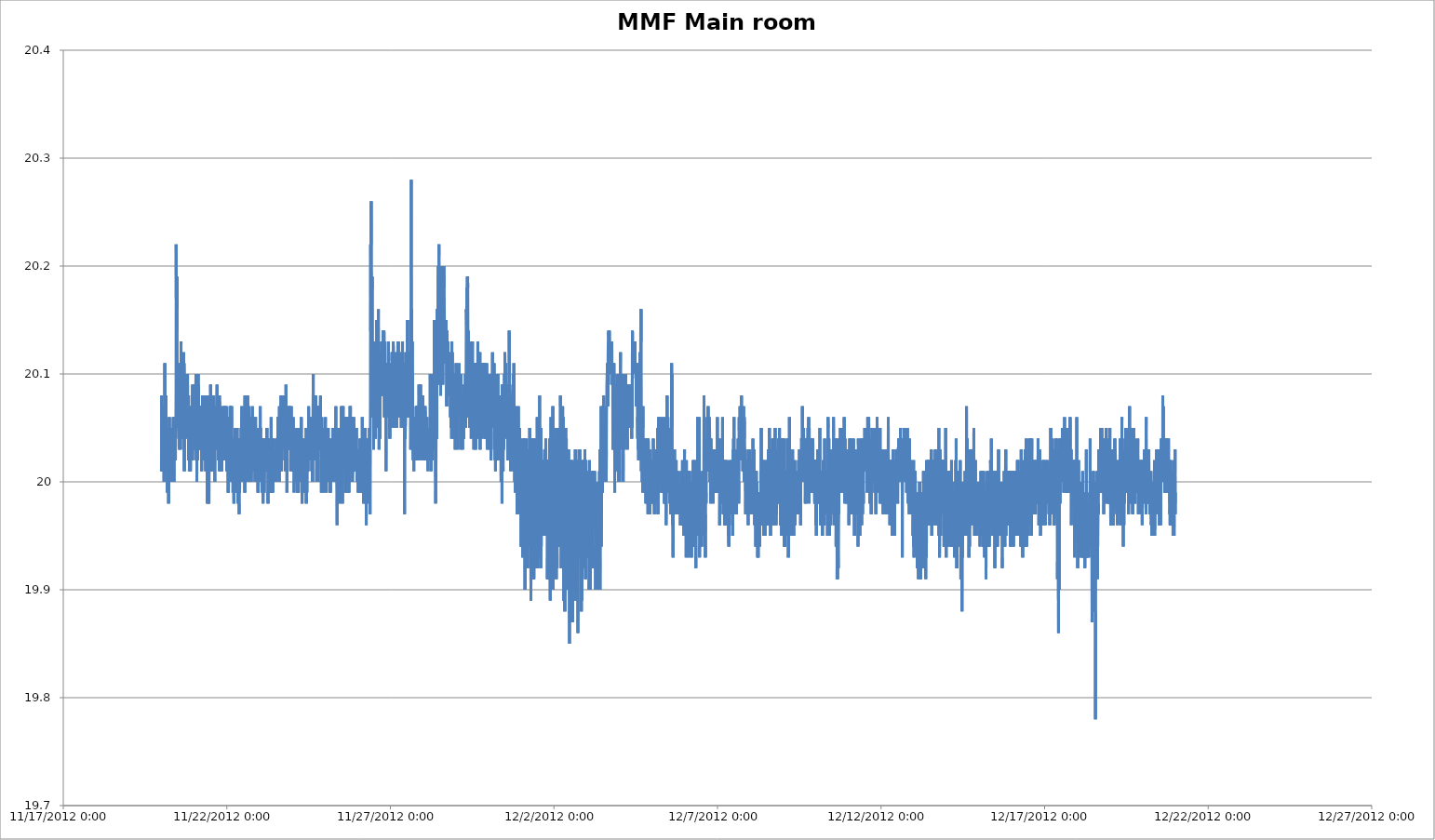
| Category | Series 0 |
|---|---|
| 41233.0 | 20.01 |
| 41233.004166666666 | 20.05 |
| 41233.00833333333 | 20.08 |
| 41233.0125 | 20.01 |
| 41233.01666666667 | 20.03 |
| 41233.020833333336 | 20.02 |
| 41233.025 | 20.02 |
| 41233.02916666667 | 20.03 |
| 41233.03333333333 | 20.01 |
| 41233.0375 | 20.03 |
| 41233.041666666664 | 20.03 |
| 41233.04583333333 | 20.04 |
| 41233.05 | 20.04 |
| 41233.05416666667 | 20.01 |
| 41233.058333333334 | 20.04 |
| 41233.0625 | 20.04 |
| 41233.066666666666 | 20.01 |
| 41233.07083333333 | 20.04 |
| 41233.075 | 20.03 |
| 41233.07916666667 | 20 |
| 41233.083333333336 | 20.04 |
| 41233.0875 | 20.05 |
| 41233.09166666667 | 20.07 |
| 41233.09583333333 | 20.06 |
| 41233.1 | 20.04 |
| 41233.104166666664 | 20.11 |
| 41233.10833333333 | 20.05 |
| 41233.1125 | 20.05 |
| 41233.11666666667 | 20.01 |
| 41233.120833333334 | 20.05 |
| 41233.125 | 20.04 |
| 41233.129166666666 | 20.01 |
| 41233.13333333333 | 20.04 |
| 41233.1375 | 20.08 |
| 41233.14166666667 | 20.05 |
| 41233.145833333336 | 20.01 |
| 41233.15 | 20.03 |
| 41233.15416666667 | 20.04 |
| 41233.15833333333 | 20.03 |
| 41233.1625 | 20.04 |
| 41233.166666666664 | 20.05 |
| 41233.17083333333 | 20.04 |
| 41233.175 | 20.02 |
| 41233.17916666667 | 19.99 |
| 41233.183333333334 | 20.03 |
| 41233.1875 | 20.04 |
| 41233.191666666666 | 20.01 |
| 41233.19583333333 | 20.02 |
| 41233.2 | 20.02 |
| 41233.20416666667 | 20.04 |
| 41233.208333333336 | 20.02 |
| 41233.2125 | 20.04 |
| 41233.21666666667 | 20.04 |
| 41233.22083333333 | 19.98 |
| 41233.225 | 20.02 |
| 41233.229166666664 | 20.03 |
| 41233.23333333333 | 20.02 |
| 41233.2375 | 20.02 |
| 41233.24166666667 | 20.06 |
| 41233.245833333334 | 20.04 |
| 41233.25 | 20 |
| 41233.254166666666 | 20.02 |
| 41233.25833333333 | 20.01 |
| 41233.2625 | 20.05 |
| 41233.26666666667 | 20.05 |
| 41233.270833333336 | 20.05 |
| 41233.275 | 20.02 |
| 41233.27916666667 | 20.02 |
| 41233.28333333333 | 20.04 |
| 41233.2875 | 20.01 |
| 41233.291666666664 | 20.05 |
| 41233.29583333333 | 20.01 |
| 41233.3 | 20.03 |
| 41233.30416666667 | 20.04 |
| 41233.308333333334 | 20.04 |
| 41233.3125 | 20.04 |
| 41233.316666666666 | 20.05 |
| 41233.32083333333 | 20.03 |
| 41233.325 | 20.03 |
| 41233.32916666667 | 20.01 |
| 41233.333333333336 | 20.01 |
| 41233.3375 | 20.02 |
| 41233.34166666667 | 20.03 |
| 41233.34583333333 | 20.04 |
| 41233.35 | 20 |
| 41233.354166666664 | 20.05 |
| 41233.35833333333 | 20.05 |
| 41233.3625 | 20.06 |
| 41233.36666666667 | 20.01 |
| 41233.370833333334 | 20.03 |
| 41233.375 | 20.02 |
| 41233.379166666666 | 20.03 |
| 41233.38333333333 | 20 |
| 41233.3875 | 20.06 |
| 41233.39166666667 | 20.06 |
| 41233.395833333336 | 20.03 |
| 41233.4 | 20.04 |
| 41233.40416666667 | 20.04 |
| 41233.40833333333 | 20.03 |
| 41233.4125 | 20.06 |
| 41233.416666666664 | 20.05 |
| 41233.42083333333 | 20.05 |
| 41233.425 | 20.05 |
| 41233.42916666667 | 20.02 |
| 41233.433333333334 | 20.05 |
| 41233.4375 | 20.04 |
| 41233.441666666666 | 20.06 |
| 41233.44583333333 | 20.09 |
| 41233.45 | 20.22 |
| 41233.45416666667 | 20.17 |
| 41233.458333333336 | 20.18 |
| 41233.4625 | 20.14 |
| 41233.46666666667 | 20.18 |
| 41233.47083333333 | 20.16 |
| 41233.475 | 20.19 |
| 41233.479166666664 | 20.17 |
| 41233.48333333333 | 20.12 |
| 41233.4875 | 20.06 |
| 41233.49166666667 | 20.06 |
| 41233.495833333334 | 20.05 |
| 41233.5 | 20.06 |
| 41233.504166666666 | 20.05 |
| 41233.50833333333 | 20.08 |
| 41233.5125 | 20.08 |
| 41233.51666666667 | 20.08 |
| 41233.520833333336 | 20.1 |
| 41233.525 | 20.09 |
| 41233.52916666667 | 20.06 |
| 41233.53333333333 | 20.06 |
| 41233.5375 | 20.11 |
| 41233.541666666664 | 20.06 |
| 41233.54583333333 | 20.03 |
| 41233.55 | 20.07 |
| 41233.55416666667 | 20.06 |
| 41233.558333333334 | 20.07 |
| 41233.5625 | 20.06 |
| 41233.566666666666 | 20.04 |
| 41233.57083333333 | 20.07 |
| 41233.575 | 20.06 |
| 41233.57916666667 | 20.04 |
| 41233.583333333336 | 20.03 |
| 41233.5875 | 20.09 |
| 41233.59166666667 | 20.08 |
| 41233.59583333333 | 20.07 |
| 41233.6 | 20.13 |
| 41233.604166666664 | 20.11 |
| 41233.60833333333 | 20.06 |
| 41233.6125 | 20.08 |
| 41233.61666666667 | 20.04 |
| 41233.620833333334 | 20.1 |
| 41233.625 | 20.06 |
| 41233.629166666666 | 20.07 |
| 41233.63333333333 | 20.05 |
| 41233.6375 | 20.11 |
| 41233.64166666667 | 20.07 |
| 41233.645833333336 | 20.08 |
| 41233.65 | 20.08 |
| 41233.65416666667 | 20.11 |
| 41233.65833333333 | 20.05 |
| 41233.6625 | 20.08 |
| 41233.666666666664 | 20.09 |
| 41233.67083333333 | 20.05 |
| 41233.675 | 20.05 |
| 41233.67916666667 | 20.09 |
| 41233.683333333334 | 20.12 |
| 41233.6875 | 20.09 |
| 41233.691666666666 | 20.11 |
| 41233.69583333333 | 20.11 |
| 41233.7 | 20.01 |
| 41233.70416666667 | 20.06 |
| 41233.708333333336 | 20.04 |
| 41233.7125 | 20.09 |
| 41233.71666666667 | 20.1 |
| 41233.72083333333 | 20.09 |
| 41233.725 | 20.09 |
| 41233.729166666664 | 20.07 |
| 41233.73333333333 | 20.1 |
| 41233.7375 | 20.08 |
| 41233.74166666667 | 20.07 |
| 41233.745833333334 | 20.09 |
| 41233.75 | 20.09 |
| 41233.754166666666 | 20.08 |
| 41233.75833333333 | 20.09 |
| 41233.7625 | 20.09 |
| 41233.76666666667 | 20.05 |
| 41233.770833333336 | 20.08 |
| 41233.775 | 20.06 |
| 41233.77916666667 | 20.04 |
| 41233.78333333333 | 20.07 |
| 41233.7875 | 20.09 |
| 41233.791666666664 | 20.06 |
| 41233.79583333333 | 20.07 |
| 41233.8 | 20.1 |
| 41233.80416666667 | 20.05 |
| 41233.808333333334 | 20.07 |
| 41233.8125 | 20.08 |
| 41233.816666666666 | 20.07 |
| 41233.82083333333 | 20.05 |
| 41233.825 | 20.04 |
| 41233.82916666667 | 20.08 |
| 41233.833333333336 | 20.02 |
| 41233.8375 | 20.04 |
| 41233.84166666667 | 20.05 |
| 41233.84583333333 | 20.07 |
| 41233.85 | 20.04 |
| 41233.854166666664 | 20.01 |
| 41233.85833333333 | 20.06 |
| 41233.8625 | 20.05 |
| 41233.86666666667 | 20.05 |
| 41233.870833333334 | 20.04 |
| 41233.875 | 20.05 |
| 41233.879166666666 | 20.03 |
| 41233.88333333333 | 20.07 |
| 41233.8875 | 20.01 |
| 41233.89166666667 | 20.04 |
| 41233.895833333336 | 20.06 |
| 41233.9 | 20.05 |
| 41233.90416666667 | 20.04 |
| 41233.90833333333 | 20.06 |
| 41233.9125 | 20.06 |
| 41233.916666666664 | 20.04 |
| 41233.92083333333 | 20.03 |
| 41233.925 | 20.05 |
| 41233.92916666667 | 20.04 |
| 41233.933333333334 | 20.06 |
| 41233.9375 | 20.07 |
| 41233.941666666666 | 20.03 |
| 41233.94583333333 | 20.05 |
| 41233.95 | 20.02 |
| 41233.95416666667 | 20.09 |
| 41233.958333333336 | 20.06 |
| 41233.9625 | 20.08 |
| 41233.96666666667 | 20.06 |
| 41233.97083333333 | 20.05 |
| 41233.975 | 20.04 |
| 41233.979166666664 | 20.08 |
| 41233.98333333333 | 20.07 |
| 41233.9875 | 20.07 |
| 41233.99166666667 | 20.04 |
| 41233.995833333334 | 20.06 |
| 41234.0 | 20.06 |
| 41234.004166666666 | 20.07 |
| 41234.00833333333 | 20.09 |
| 41234.0125 | 20.03 |
| 41234.01666666667 | 20.07 |
| 41234.020833333336 | 20.08 |
| 41234.025 | 20.06 |
| 41234.02916666667 | 20.07 |
| 41234.03333333333 | 20.06 |
| 41234.0375 | 20.06 |
| 41234.041666666664 | 20.06 |
| 41234.04583333333 | 20.08 |
| 41234.05 | 20.09 |
| 41234.05416666667 | 20.1 |
| 41234.058333333334 | 20.04 |
| 41234.0625 | 20.03 |
| 41234.066666666666 | 20.02 |
| 41234.07083333333 | 20.04 |
| 41234.075 | 20.04 |
| 41234.07916666667 | 20.07 |
| 41234.083333333336 | 20 |
| 41234.0875 | 20.07 |
| 41234.09166666667 | 20.05 |
| 41234.09583333333 | 20.05 |
| 41234.1 | 20.07 |
| 41234.104166666664 | 20.02 |
| 41234.10833333333 | 20.04 |
| 41234.1125 | 20.06 |
| 41234.11666666667 | 20.03 |
| 41234.120833333334 | 20.05 |
| 41234.125 | 20.1 |
| 41234.129166666666 | 20.03 |
| 41234.13333333333 | 20.07 |
| 41234.1375 | 20.09 |
| 41234.14166666667 | 20.05 |
| 41234.145833333336 | 20.03 |
| 41234.15 | 20.04 |
| 41234.15416666667 | 20.04 |
| 41234.15833333333 | 20.05 |
| 41234.1625 | 20.05 |
| 41234.166666666664 | 20.05 |
| 41234.17083333333 | 20.07 |
| 41234.175 | 20.05 |
| 41234.17916666667 | 20.05 |
| 41234.183333333334 | 20.03 |
| 41234.1875 | 20.07 |
| 41234.191666666666 | 20.05 |
| 41234.19583333333 | 20.03 |
| 41234.2 | 20.07 |
| 41234.20416666667 | 20.06 |
| 41234.208333333336 | 20.06 |
| 41234.2125 | 20.07 |
| 41234.21666666667 | 20.04 |
| 41234.22083333333 | 20.07 |
| 41234.225 | 20.07 |
| 41234.229166666664 | 20.01 |
| 41234.23333333333 | 20.03 |
| 41234.2375 | 20.05 |
| 41234.24166666667 | 20.02 |
| 41234.245833333334 | 20.02 |
| 41234.25 | 20.05 |
| 41234.254166666666 | 20.08 |
| 41234.25833333333 | 20.06 |
| 41234.2625 | 20.05 |
| 41234.26666666667 | 20.05 |
| 41234.270833333336 | 20.04 |
| 41234.275 | 20.02 |
| 41234.27916666667 | 20.07 |
| 41234.28333333333 | 20.07 |
| 41234.2875 | 20.03 |
| 41234.291666666664 | 20.05 |
| 41234.29583333333 | 20.05 |
| 41234.3 | 20.06 |
| 41234.30416666667 | 20.02 |
| 41234.308333333334 | 20.04 |
| 41234.3125 | 20.07 |
| 41234.316666666666 | 20.02 |
| 41234.32083333333 | 20.05 |
| 41234.325 | 20.05 |
| 41234.32916666667 | 20.05 |
| 41234.333333333336 | 20.06 |
| 41234.3375 | 20.08 |
| 41234.34166666667 | 20.08 |
| 41234.34583333333 | 20.02 |
| 41234.35 | 20.06 |
| 41234.354166666664 | 20.01 |
| 41234.35833333333 | 20.05 |
| 41234.3625 | 20.07 |
| 41234.36666666667 | 20.03 |
| 41234.36790509259 | 20.04 |
| 41234.36869212963 | 20.06 |
| 41234.370833333334 | 20.06 |
| 41234.375 | 20.05 |
| 41234.379166666666 | 20.05 |
| 41234.38333333333 | 20.04 |
| 41234.3875 | 20.08 |
| 41234.39166666667 | 20.05 |
| 41234.395833333336 | 20.01 |
| 41234.4 | 20.02 |
| 41234.40416666667 | 19.98 |
| 41234.40833333333 | 20.07 |
| 41234.4125 | 20.04 |
| 41234.416666666664 | 20.07 |
| 41234.42083333333 | 20.02 |
| 41234.425 | 20.04 |
| 41234.42916666667 | 20.03 |
| 41234.433333333334 | 20.02 |
| 41234.4375 | 19.98 |
| 41234.441666666666 | 19.98 |
| 41234.44583333333 | 20.02 |
| 41234.45 | 20.01 |
| 41234.45416666667 | 19.98 |
| 41234.458333333336 | 20.02 |
| 41234.4625 | 20.04 |
| 41234.46666666667 | 20.06 |
| 41234.47083333333 | 20.06 |
| 41234.475 | 20.04 |
| 41234.479166666664 | 20.08 |
| 41234.48333333333 | 20.08 |
| 41234.4875 | 20.08 |
| 41234.49166666667 | 20.01 |
| 41234.495833333334 | 20.08 |
| 41234.5 | 20.01 |
| 41234.504166666666 | 20.09 |
| 41234.50833333333 | 20.05 |
| 41234.5125 | 20.07 |
| 41234.51666666667 | 20.05 |
| 41234.520833333336 | 20.03 |
| 41234.525 | 20.03 |
| 41234.52916666667 | 20.04 |
| 41234.53333333333 | 20.05 |
| 41234.5375 | 20.04 |
| 41234.541666666664 | 20.01 |
| 41234.54583333333 | 20.03 |
| 41234.55 | 20.05 |
| 41234.55416666667 | 20.02 |
| 41234.558333333334 | 20.03 |
| 41234.5625 | 20.05 |
| 41234.566666666666 | 20.04 |
| 41234.57083333333 | 20.01 |
| 41234.575 | 20.07 |
| 41234.57916666667 | 20.06 |
| 41234.583333333336 | 20.05 |
| 41234.5875 | 20.06 |
| 41234.59166666667 | 20.06 |
| 41234.6 | 20.08 |
| 41234.604166666664 | 20.04 |
| 41234.60833333333 | 20.02 |
| 41234.6125 | 20.04 |
| 41234.61666666667 | 20.06 |
| 41234.620833333334 | 20.04 |
| 41234.625 | 20.04 |
| 41234.629166666666 | 20.01 |
| 41234.63333333333 | 20 |
| 41234.6375 | 20.04 |
| 41234.64166666667 | 20.03 |
| 41234.645833333336 | 20.06 |
| 41234.65 | 20.07 |
| 41234.65416666667 | 20.04 |
| 41234.65833333333 | 20.05 |
| 41234.6625 | 20.07 |
| 41234.666666666664 | 20.05 |
| 41234.67083333333 | 20.05 |
| 41234.675 | 20.05 |
| 41234.683333333334 | 20.04 |
| 41234.6875 | 20.07 |
| 41234.691666666666 | 20.07 |
| 41234.69583333333 | 20.08 |
| 41234.7 | 20.09 |
| 41234.70416666667 | 20.07 |
| 41234.708333333336 | 20.03 |
| 41234.7125 | 20.08 |
| 41234.71666666667 | 20.06 |
| 41234.72083333333 | 20.04 |
| 41234.725 | 20.04 |
| 41234.729166666664 | 20.06 |
| 41234.73333333333 | 20.04 |
| 41234.7375 | 20.08 |
| 41234.74166666667 | 20.02 |
| 41234.745833333334 | 20.03 |
| 41234.75 | 20.06 |
| 41234.754166666666 | 20.07 |
| 41234.75833333333 | 20.05 |
| 41234.7625 | 20.08 |
| 41234.76666666667 | 20.05 |
| 41234.770833333336 | 20.01 |
| 41234.775 | 20.08 |
| 41234.77916666667 | 20.06 |
| 41234.78333333333 | 20.07 |
| 41234.7875 | 20.07 |
| 41234.791666666664 | 20.04 |
| 41234.79583333333 | 20.04 |
| 41234.8 | 20.06 |
| 41234.80416666667 | 20.06 |
| 41234.808333333334 | 20.04 |
| 41234.8125 | 20.01 |
| 41234.816666666666 | 20.01 |
| 41234.82083333333 | 20.03 |
| 41234.825 | 20.04 |
| 41234.82916666667 | 20.05 |
| 41234.833333333336 | 20.05 |
| 41234.8375 | 20.05 |
| 41234.84166666667 | 20.06 |
| 41234.84583333333 | 20.01 |
| 41234.85 | 20.02 |
| 41234.854166666664 | 20.04 |
| 41234.85833333333 | 20.02 |
| 41234.8625 | 20.04 |
| 41234.86666666667 | 20.05 |
| 41234.870833333334 | 20.03 |
| 41234.875 | 20.06 |
| 41234.879166666666 | 20.07 |
| 41234.88333333333 | 20.02 |
| 41234.8875 | 20.04 |
| 41234.89166666667 | 20.04 |
| 41234.895833333336 | 20.02 |
| 41234.9 | 20.05 |
| 41234.90416666667 | 20.06 |
| 41234.90833333333 | 20.07 |
| 41234.9125 | 20.02 |
| 41234.916666666664 | 20.03 |
| 41234.92083333333 | 20.04 |
| 41234.925 | 20.04 |
| 41234.92916666667 | 20.04 |
| 41234.933333333334 | 20.03 |
| 41234.9375 | 20.06 |
| 41234.941666666666 | 20.06 |
| 41234.94583333333 | 20.07 |
| 41234.95 | 20.03 |
| 41234.95416666667 | 20.03 |
| 41234.958333333336 | 20.03 |
| 41234.9625 | 20.06 |
| 41234.96666666667 | 20.03 |
| 41234.97083333333 | 20.03 |
| 41234.975 | 20.03 |
| 41234.979166666664 | 20.03 |
| 41234.98333333333 | 20.07 |
| 41234.9875 | 20.07 |
| 41234.99166666667 | 20.03 |
| 41234.995833333334 | 20.04 |
| 41235.0 | 20.01 |
| 41235.004166666666 | 20.03 |
| 41235.00833333333 | 20.03 |
| 41235.01666666667 | 20.05 |
| 41235.020833333336 | 20.03 |
| 41235.025 | 20.03 |
| 41235.02916666667 | 20.02 |
| 41235.03333333333 | 20.02 |
| 41235.0375 | 20.03 |
| 41235.041666666664 | 19.99 |
| 41235.04583333333 | 20.03 |
| 41235.05 | 19.99 |
| 41235.058333333334 | 20.04 |
| 41235.0625 | 20.03 |
| 41235.066666666666 | 20.06 |
| 41235.07083333333 | 20.06 |
| 41235.075 | 20.04 |
| 41235.07916666667 | 20.01 |
| 41235.083333333336 | 20.04 |
| 41235.0875 | 20.04 |
| 41235.09166666667 | 20.05 |
| 41235.09583333333 | 20.06 |
| 41235.1 | 20.07 |
| 41235.104166666664 | 20.04 |
| 41235.10833333333 | 20.07 |
| 41235.1125 | 20.06 |
| 41235.11666666667 | 20.03 |
| 41235.120833333334 | 20.04 |
| 41235.125 | 20.06 |
| 41235.129166666666 | 20.04 |
| 41235.13333333333 | 20.03 |
| 41235.1375 | 20.03 |
| 41235.14166666667 | 20 |
| 41235.145833333336 | 20.07 |
| 41235.15 | 20.03 |
| 41235.15416666667 | 20 |
| 41235.15833333333 | 20.03 |
| 41235.1625 | 20.02 |
| 41235.166666666664 | 20.02 |
| 41235.17083333333 | 20.03 |
| 41235.175 | 20.01 |
| 41235.17916666667 | 20.04 |
| 41235.183333333334 | 20.02 |
| 41235.1875 | 19.99 |
| 41235.191666666666 | 20.02 |
| 41235.19583333333 | 20.02 |
| 41235.2 | 20.03 |
| 41235.20416666667 | 20 |
| 41235.208333333336 | 20 |
| 41235.2125 | 20.02 |
| 41235.21666666667 | 19.98 |
| 41235.22083333333 | 20.01 |
| 41235.225 | 20.01 |
| 41235.229166666664 | 19.99 |
| 41235.23333333333 | 19.99 |
| 41235.2375 | 20.01 |
| 41235.24166666667 | 20.01 |
| 41235.245833333334 | 20.04 |
| 41235.25 | 20.02 |
| 41235.254166666666 | 20.01 |
| 41235.25833333333 | 20.05 |
| 41235.2625 | 19.99 |
| 41235.26666666667 | 20.01 |
| 41235.270833333336 | 20.05 |
| 41235.275 | 20.05 |
| 41235.27916666667 | 20.03 |
| 41235.28333333333 | 20.03 |
| 41235.2875 | 20.02 |
| 41235.291666666664 | 20.02 |
| 41235.29583333333 | 20 |
| 41235.3 | 20 |
| 41235.30416666667 | 20.01 |
| 41235.308333333334 | 20.04 |
| 41235.3125 | 20.04 |
| 41235.316666666666 | 20.05 |
| 41235.32083333333 | 20.02 |
| 41235.325 | 20.03 |
| 41235.32916666667 | 20.04 |
| 41235.333333333336 | 20 |
| 41235.3375 | 20.03 |
| 41235.34166666667 | 19.98 |
| 41235.34583333333 | 20 |
| 41235.35 | 20.04 |
| 41235.354166666664 | 20.03 |
| 41235.35833333333 | 20.02 |
| 41235.3625 | 20.04 |
| 41235.36666666667 | 20.02 |
| 41235.370833333334 | 20.01 |
| 41235.375 | 19.97 |
| 41235.379166666666 | 19.98 |
| 41235.38333333333 | 20.01 |
| 41235.3875 | 20.04 |
| 41235.39166666667 | 19.99 |
| 41235.395833333336 | 19.99 |
| 41235.4 | 20.04 |
| 41235.40416666667 | 20.02 |
| 41235.40833333333 | 20.02 |
| 41235.4125 | 20.01 |
| 41235.416666666664 | 20.02 |
| 41235.42083333333 | 20.01 |
| 41235.425 | 20.04 |
| 41235.42916666667 | 20.01 |
| 41235.433333333334 | 20.03 |
| 41235.4375 | 20.05 |
| 41235.441666666666 | 20.02 |
| 41235.44583333333 | 20.05 |
| 41235.45 | 20.03 |
| 41235.45416666667 | 20.06 |
| 41235.458333333336 | 20.04 |
| 41235.4625 | 20.07 |
| 41235.46666666667 | 20.05 |
| 41235.47083333333 | 20 |
| 41235.475 | 20 |
| 41235.479166666664 | 20.01 |
| 41235.48333333333 | 20.04 |
| 41235.4875 | 20 |
| 41235.49166666667 | 20.05 |
| 41235.495833333334 | 20.01 |
| 41235.5 | 20.05 |
| 41235.504166666666 | 20.02 |
| 41235.50833333333 | 20.03 |
| 41235.5125 | 20.01 |
| 41235.51666666667 | 20.04 |
| 41235.520833333336 | 20 |
| 41235.525 | 20.03 |
| 41235.52916666667 | 20.02 |
| 41235.53333333333 | 20.04 |
| 41235.5375 | 20.04 |
| 41235.541666666664 | 20.01 |
| 41235.54583333333 | 20.03 |
| 41235.55 | 19.99 |
| 41235.55416666667 | 20.08 |
| 41235.558333333334 | 20.05 |
| 41235.5625 | 20.05 |
| 41235.566666666666 | 20.03 |
| 41235.57083333333 | 20.01 |
| 41235.575 | 20.02 |
| 41235.57916666667 | 20.05 |
| 41235.583333333336 | 20.04 |
| 41235.5875 | 20.04 |
| 41235.59166666667 | 20.03 |
| 41235.59583333333 | 20.04 |
| 41235.6 | 20 |
| 41235.604166666664 | 20.06 |
| 41235.60833333333 | 20.05 |
| 41235.6125 | 20.05 |
| 41235.61666666667 | 20.05 |
| 41235.620833333334 | 20.07 |
| 41235.625 | 20.04 |
| 41235.629166666666 | 20.02 |
| 41235.63333333333 | 20.06 |
| 41235.6375 | 20.08 |
| 41235.64166666667 | 20.05 |
| 41235.645833333336 | 20 |
| 41235.65 | 20.06 |
| 41235.65416666667 | 20.05 |
| 41235.65833333333 | 20.04 |
| 41235.6625 | 20.02 |
| 41235.666666666664 | 20.05 |
| 41235.67083333333 | 20.06 |
| 41235.675 | 20.07 |
| 41235.67916666667 | 20.04 |
| 41235.683333333334 | 20.04 |
| 41235.6875 | 20.03 |
| 41235.691666666666 | 20.03 |
| 41235.69583333333 | 20 |
| 41235.7 | 20.06 |
| 41235.70416666667 | 20.04 |
| 41235.708333333336 | 20.03 |
| 41235.7125 | 20.04 |
| 41235.71666666667 | 20.05 |
| 41235.72083333333 | 20.05 |
| 41235.725 | 20.04 |
| 41235.729166666664 | 20.01 |
| 41235.73333333333 | 20.04 |
| 41235.7375 | 20.04 |
| 41235.74166666667 | 20.05 |
| 41235.745833333334 | 20 |
| 41235.75 | 20.05 |
| 41235.754166666666 | 20.04 |
| 41235.75833333333 | 20.06 |
| 41235.7625 | 20.01 |
| 41235.76666666667 | 20.05 |
| 41235.770833333336 | 20.05 |
| 41235.775 | 20.05 |
| 41235.77916666667 | 20.07 |
| 41235.78333333333 | 20.05 |
| 41235.7875 | 20.04 |
| 41235.791666666664 | 20.04 |
| 41235.79583333333 | 20.04 |
| 41235.8 | 20.03 |
| 41235.80416666667 | 20.03 |
| 41235.808333333334 | 20.02 |
| 41235.8125 | 20.03 |
| 41235.816666666666 | 20.01 |
| 41235.82083333333 | 20.04 |
| 41235.825 | 20.06 |
| 41235.82916666667 | 20.05 |
| 41235.833333333336 | 20.05 |
| 41235.8375 | 20.02 |
| 41235.84166666667 | 20.01 |
| 41235.84583333333 | 20.04 |
| 41235.85 | 20.05 |
| 41235.854166666664 | 20.05 |
| 41235.85833333333 | 20.06 |
| 41235.8625 | 20 |
| 41235.86666666667 | 20.05 |
| 41235.870833333334 | 20.05 |
| 41235.875 | 20.05 |
| 41235.879166666666 | 20.06 |
| 41235.88333333333 | 20.05 |
| 41235.8875 | 20.05 |
| 41235.89166666667 | 20.02 |
| 41235.895833333336 | 20.03 |
| 41235.9 | 20.02 |
| 41235.90416666667 | 20.02 |
| 41235.90833333333 | 20.03 |
| 41235.9125 | 20.05 |
| 41235.916666666664 | 20.05 |
| 41235.92083333333 | 20.03 |
| 41235.925 | 20.01 |
| 41235.92916666667 | 20.04 |
| 41235.933333333334 | 20.04 |
| 41235.9375 | 20.02 |
| 41235.941666666666 | 20.03 |
| 41235.94583333333 | 20.01 |
| 41235.95 | 19.99 |
| 41235.95416666667 | 20.05 |
| 41235.958333333336 | 20.03 |
| 41235.9625 | 19.99 |
| 41235.96666666667 | 20.03 |
| 41235.97083333333 | 20.02 |
| 41235.975 | 20.01 |
| 41235.979166666664 | 20.05 |
| 41235.98333333333 | 20.01 |
| 41235.9875 | 20 |
| 41235.99166666667 | 20.03 |
| 41235.995833333334 | 20.04 |
| 41236.0 | 20.03 |
| 41236.004166666666 | 20.02 |
| 41236.00833333333 | 20.03 |
| 41236.0125 | 20.02 |
| 41236.01666666667 | 20.05 |
| 41236.020833333336 | 20.07 |
| 41236.025 | 20.04 |
| 41236.02916666667 | 20.05 |
| 41236.03333333333 | 20.01 |
| 41236.0375 | 20.03 |
| 41236.041666666664 | 20.04 |
| 41236.04583333333 | 20.02 |
| 41236.05 | 20.01 |
| 41236.05416666667 | 20.03 |
| 41236.058333333334 | 20.02 |
| 41236.0625 | 20 |
| 41236.066666666666 | 20.01 |
| 41236.07083333333 | 20.03 |
| 41236.075 | 20.03 |
| 41236.07916666667 | 19.99 |
| 41236.083333333336 | 20.03 |
| 41236.0875 | 20 |
| 41236.09166666667 | 20.04 |
| 41236.09583333333 | 20.03 |
| 41236.1 | 20.02 |
| 41236.104166666664 | 19.99 |
| 41236.10833333333 | 19.98 |
| 41236.1125 | 20.02 |
| 41236.11666666667 | 20.04 |
| 41236.120833333334 | 20.04 |
| 41236.125 | 20.01 |
| 41236.129166666666 | 20.01 |
| 41236.13333333333 | 20 |
| 41236.1375 | 20.01 |
| 41236.14166666667 | 19.99 |
| 41236.145833333336 | 20.01 |
| 41236.15 | 20.03 |
| 41236.15416666667 | 20.03 |
| 41236.15833333333 | 20.02 |
| 41236.1625 | 20.03 |
| 41236.166666666664 | 20.04 |
| 41236.17083333333 | 20.02 |
| 41236.175 | 20.03 |
| 41236.17916666667 | 20.04 |
| 41236.183333333334 | 20.03 |
| 41236.1875 | 20.03 |
| 41236.191666666666 | 20.02 |
| 41236.19583333333 | 20.04 |
| 41236.2 | 20.01 |
| 41236.20416666667 | 20.04 |
| 41236.208333333336 | 20.01 |
| 41236.2125 | 20.03 |
| 41236.21666666667 | 20.03 |
| 41236.22083333333 | 20.02 |
| 41236.225 | 20.05 |
| 41236.229166666664 | 20.02 |
| 41236.23333333333 | 20.01 |
| 41236.2375 | 20.04 |
| 41236.24166666667 | 20.03 |
| 41236.245833333334 | 20.04 |
| 41236.25 | 20.02 |
| 41236.254166666666 | 20.04 |
| 41236.25833333333 | 19.98 |
| 41236.2625 | 19.99 |
| 41236.26666666667 | 20 |
| 41236.270833333336 | 20.01 |
| 41236.275 | 20 |
| 41236.27916666667 | 20.01 |
| 41236.28333333333 | 20.01 |
| 41236.2875 | 20 |
| 41236.291666666664 | 20 |
| 41236.29583333333 | 20.04 |
| 41236.3 | 20 |
| 41236.30416666667 | 19.99 |
| 41236.308333333334 | 20.01 |
| 41236.3125 | 20 |
| 41236.316666666666 | 20.02 |
| 41236.32083333333 | 20.01 |
| 41236.325 | 20.02 |
| 41236.32916666667 | 20.01 |
| 41236.333333333336 | 20 |
| 41236.3375 | 20.01 |
| 41236.34166666667 | 20.01 |
| 41236.34583333333 | 20.03 |
| 41236.35 | 20.03 |
| 41236.354166666664 | 20.06 |
| 41236.35833333333 | 20.02 |
| 41236.3625 | 20.03 |
| 41236.36666666667 | 20.01 |
| 41236.370833333334 | 19.99 |
| 41236.375 | 20.04 |
| 41236.379166666666 | 19.99 |
| 41236.38333333333 | 20 |
| 41236.3875 | 20.02 |
| 41236.39166666667 | 20.02 |
| 41236.395833333336 | 20 |
| 41236.4 | 20 |
| 41236.40416666667 | 20 |
| 41236.40833333333 | 19.99 |
| 41236.4125 | 20.01 |
| 41236.416666666664 | 20.03 |
| 41236.42083333333 | 20 |
| 41236.425 | 20.02 |
| 41236.42916666667 | 20.02 |
| 41236.433333333334 | 20.04 |
| 41236.4375 | 20.03 |
| 41236.441666666666 | 20.02 |
| 41236.44583333333 | 20.02 |
| 41236.45 | 20.03 |
| 41236.45416666667 | 20 |
| 41236.458333333336 | 20.01 |
| 41236.4625 | 20.01 |
| 41236.46666666667 | 20 |
| 41236.47083333333 | 20 |
| 41236.475 | 20.03 |
| 41236.479166666664 | 20.02 |
| 41236.48333333333 | 20 |
| 41236.4875 | 20.01 |
| 41236.49166666667 | 20.02 |
| 41236.495833333334 | 20 |
| 41236.5 | 20.02 |
| 41236.504166666666 | 20.01 |
| 41236.50833333333 | 20 |
| 41236.5125 | 20.02 |
| 41236.51666666667 | 20.02 |
| 41236.520833333336 | 20.01 |
| 41236.525 | 20.01 |
| 41236.52916666667 | 20.01 |
| 41236.53333333333 | 20.04 |
| 41236.5375 | 20.03 |
| 41236.541666666664 | 20.04 |
| 41236.54583333333 | 20.04 |
| 41236.55 | 20.03 |
| 41236.55416666667 | 20.01 |
| 41236.558333333334 | 20.06 |
| 41236.5625 | 20.04 |
| 41236.566666666666 | 20.04 |
| 41236.57083333333 | 20.04 |
| 41236.575 | 20.04 |
| 41236.57916666667 | 20.04 |
| 41236.583333333336 | 20.05 |
| 41236.5875 | 20.05 |
| 41236.59166666667 | 20.04 |
| 41236.59583333333 | 20.06 |
| 41236.6 | 20 |
| 41236.604166666664 | 20.05 |
| 41236.60833333333 | 20.07 |
| 41236.6125 | 20.05 |
| 41236.61666666667 | 20.05 |
| 41236.620833333334 | 20.06 |
| 41236.625 | 20.06 |
| 41236.629166666666 | 20.01 |
| 41236.63333333333 | 20.02 |
| 41236.6375 | 20.03 |
| 41236.64166666667 | 20.04 |
| 41236.645833333336 | 20.03 |
| 41236.65 | 20.05 |
| 41236.65416666667 | 20.08 |
| 41236.65833333333 | 20.05 |
| 41236.6625 | 20.05 |
| 41236.666666666664 | 20.01 |
| 41236.67083333333 | 20.04 |
| 41236.675 | 20.03 |
| 41236.67916666667 | 20.06 |
| 41236.683333333334 | 20.03 |
| 41236.6875 | 20.02 |
| 41236.691666666666 | 20.07 |
| 41236.69583333333 | 20.05 |
| 41236.7 | 20.05 |
| 41236.70416666667 | 20.06 |
| 41236.708333333336 | 20.06 |
| 41236.7125 | 20.04 |
| 41236.71666666667 | 20.04 |
| 41236.72083333333 | 20.08 |
| 41236.725 | 20.08 |
| 41236.729166666664 | 20.07 |
| 41236.73333333333 | 20.06 |
| 41236.7375 | 20.04 |
| 41236.74166666667 | 20.06 |
| 41236.745833333334 | 20.04 |
| 41236.75 | 20.03 |
| 41236.754166666666 | 20.06 |
| 41236.75833333333 | 20.05 |
| 41236.7625 | 20.04 |
| 41236.76666666667 | 20.05 |
| 41236.770833333336 | 20.08 |
| 41236.775 | 20.05 |
| 41236.77916666667 | 20.04 |
| 41236.78333333333 | 20.01 |
| 41236.7875 | 20.05 |
| 41236.791666666664 | 20.05 |
| 41236.79583333333 | 20.03 |
| 41236.8 | 20.02 |
| 41236.80416666667 | 20.04 |
| 41236.808333333334 | 20.09 |
| 41236.8125 | 20.07 |
| 41236.816666666666 | 20.02 |
| 41236.82083333333 | 20.05 |
| 41236.825 | 20.04 |
| 41236.82916666667 | 20.05 |
| 41236.833333333336 | 20.03 |
| 41236.8375 | 19.99 |
| 41236.84166666667 | 20.05 |
| 41236.84583333333 | 20.03 |
| 41236.85 | 20.04 |
| 41236.854166666664 | 20.05 |
| 41236.85833333333 | 20.06 |
| 41236.8625 | 20.06 |
| 41236.86666666667 | 20.03 |
| 41236.870833333334 | 20.03 |
| 41236.875 | 20.06 |
| 41236.879166666666 | 20.05 |
| 41236.88333333333 | 20.04 |
| 41236.8875 | 20.04 |
| 41236.89166666667 | 20.04 |
| 41236.895833333336 | 20.07 |
| 41236.9 | 20.05 |
| 41236.90416666667 | 20.06 |
| 41236.90833333333 | 20.05 |
| 41236.9125 | 20.04 |
| 41236.916666666664 | 20.06 |
| 41236.92083333333 | 20.07 |
| 41236.925 | 20.03 |
| 41236.92916666667 | 20.06 |
| 41236.933333333334 | 20.04 |
| 41236.9375 | 20.04 |
| 41236.941666666666 | 20.06 |
| 41236.94583333333 | 20.04 |
| 41236.95 | 20.01 |
| 41236.95416666667 | 20.04 |
| 41236.958333333336 | 20.02 |
| 41236.9625 | 20.04 |
| 41236.96666666667 | 20.04 |
| 41236.97083333333 | 20.07 |
| 41236.975 | 20.03 |
| 41236.979166666664 | 20.02 |
| 41236.98333333333 | 20.03 |
| 41236.9875 | 20.05 |
| 41236.99166666667 | 20.04 |
| 41236.995833333334 | 20.02 |
| 41237.0 | 20.04 |
| 41237.004166666666 | 20.02 |
| 41237.00833333333 | 20.01 |
| 41237.0125 | 20.02 |
| 41237.01666666667 | 20.05 |
| 41237.020833333336 | 20.01 |
| 41237.025 | 20.04 |
| 41237.02916666667 | 20.06 |
| 41237.03333333333 | 20.05 |
| 41237.0375 | 20.02 |
| 41237.041666666664 | 20.03 |
| 41237.04583333333 | 20.05 |
| 41237.05 | 20.03 |
| 41237.05416666667 | 19.99 |
| 41237.0625 | 19.99 |
| 41237.066666666666 | 20.03 |
| 41237.07083333333 | 20.04 |
| 41237.075 | 20.02 |
| 41237.07916666667 | 20.02 |
| 41237.083333333336 | 20.05 |
| 41237.0875 | 20.03 |
| 41237.09166666667 | 20 |
| 41237.09583333333 | 20 |
| 41237.1 | 20.02 |
| 41237.104166666664 | 20.02 |
| 41237.10833333333 | 20.03 |
| 41237.1125 | 20.03 |
| 41237.11666666667 | 20.03 |
| 41237.120833333334 | 20.03 |
| 41237.125 | 20.03 |
| 41237.129166666666 | 20.05 |
| 41237.13333333333 | 20.02 |
| 41237.1375 | 20.01 |
| 41237.14166666667 | 20.04 |
| 41237.145833333336 | 20.04 |
| 41237.15 | 20.01 |
| 41237.15416666667 | 20.01 |
| 41237.1625 | 19.99 |
| 41237.166666666664 | 20 |
| 41237.17083333333 | 20.01 |
| 41237.17916666667 | 19.99 |
| 41237.183333333334 | 20.02 |
| 41237.1875 | 19.99 |
| 41237.191666666666 | 20.01 |
| 41237.19583333333 | 20.01 |
| 41237.2 | 20.05 |
| 41237.20416666667 | 20 |
| 41237.208333333336 | 20.02 |
| 41237.2125 | 20.04 |
| 41237.21666666667 | 20.03 |
| 41237.22083333333 | 20.03 |
| 41237.225 | 20.04 |
| 41237.229166666664 | 20.02 |
| 41237.23333333333 | 20.01 |
| 41237.2375 | 20.02 |
| 41237.24166666667 | 20.04 |
| 41237.245833333334 | 20.04 |
| 41237.25 | 20.03 |
| 41237.254166666666 | 20.03 |
| 41237.25833333333 | 20.02 |
| 41237.2625 | 20.01 |
| 41237.26666666667 | 20.03 |
| 41237.270833333336 | 20.02 |
| 41237.275 | 20.06 |
| 41237.27916666667 | 20.03 |
| 41237.28333333333 | 20.01 |
| 41237.2875 | 20.02 |
| 41237.291666666664 | 20 |
| 41237.29583333333 | 20.01 |
| 41237.3 | 19.98 |
| 41237.30416666667 | 20.01 |
| 41237.308333333334 | 20.02 |
| 41237.3125 | 20 |
| 41237.316666666666 | 19.99 |
| 41237.32083333333 | 20 |
| 41237.325 | 20 |
| 41237.32916666667 | 20 |
| 41237.333333333336 | 20.02 |
| 41237.3375 | 20.01 |
| 41237.34166666667 | 20.04 |
| 41237.34583333333 | 20.01 |
| 41237.35 | 20.03 |
| 41237.354166666664 | 20.02 |
| 41237.35833333333 | 20.02 |
| 41237.3625 | 20.02 |
| 41237.36666666667 | 20.02 |
| 41237.370833333334 | 20.02 |
| 41237.375 | 20.01 |
| 41237.379166666666 | 20.02 |
| 41237.38333333333 | 20.01 |
| 41237.3875 | 19.99 |
| 41237.39166666667 | 19.99 |
| 41237.395833333336 | 20.01 |
| 41237.4 | 20.01 |
| 41237.40416666667 | 20.01 |
| 41237.40833333333 | 20.01 |
| 41237.4125 | 20.02 |
| 41237.416666666664 | 20.01 |
| 41237.42083333333 | 20.03 |
| 41237.425 | 20.05 |
| 41237.42916666667 | 19.98 |
| 41237.433333333334 | 20.01 |
| 41237.4375 | 20.01 |
| 41237.441666666666 | 20.03 |
| 41237.44583333333 | 19.99 |
| 41237.45 | 20 |
| 41237.45416666667 | 20 |
| 41237.458333333336 | 20.01 |
| 41237.4625 | 20.04 |
| 41237.46666666667 | 20.02 |
| 41237.47083333333 | 20.04 |
| 41237.475 | 20.04 |
| 41237.479166666664 | 20.01 |
| 41237.48333333333 | 20.02 |
| 41237.4875 | 20.03 |
| 41237.49166666667 | 20.04 |
| 41237.495833333334 | 20.04 |
| 41237.5 | 20.07 |
| 41237.504166666666 | 20.05 |
| 41237.50833333333 | 20.04 |
| 41237.5125 | 20.04 |
| 41237.51666666667 | 20.03 |
| 41237.520833333336 | 20.03 |
| 41237.525 | 20.04 |
| 41237.52916666667 | 20.02 |
| 41237.53333333333 | 20.05 |
| 41237.5375 | 20.03 |
| 41237.541666666664 | 20.05 |
| 41237.54583333333 | 20.04 |
| 41237.55 | 20.06 |
| 41237.55416666667 | 20.05 |
| 41237.558333333334 | 20.04 |
| 41237.5625 | 20.05 |
| 41237.566666666666 | 20.05 |
| 41237.57083333333 | 20.03 |
| 41237.575 | 20.03 |
| 41237.57916666667 | 20.02 |
| 41237.583333333336 | 20.05 |
| 41237.5875 | 20.05 |
| 41237.59166666667 | 20.03 |
| 41237.59583333333 | 20.01 |
| 41237.6 | 20.02 |
| 41237.604166666664 | 20.05 |
| 41237.60833333333 | 20.02 |
| 41237.6125 | 20.02 |
| 41237.61666666667 | 20.03 |
| 41237.620833333334 | 20 |
| 41237.625 | 20.05 |
| 41237.629166666666 | 20.03 |
| 41237.63333333333 | 20.03 |
| 41237.6375 | 20.08 |
| 41237.64166666667 | 20.1 |
| 41237.645833333336 | 20.05 |
| 41237.65 | 20.04 |
| 41237.65416666667 | 20.02 |
| 41237.65833333333 | 20.07 |
| 41237.6625 | 20.06 |
| 41237.666666666664 | 20.06 |
| 41237.67083333333 | 20.05 |
| 41237.675 | 20.04 |
| 41237.683333333334 | 20.03 |
| 41237.6875 | 20.08 |
| 41237.691666666666 | 20.05 |
| 41237.69583333333 | 20.04 |
| 41237.7 | 20.06 |
| 41237.70416666667 | 20.04 |
| 41237.708333333336 | 20.05 |
| 41237.7125 | 20.06 |
| 41237.71666666667 | 20.07 |
| 41237.72083333333 | 20.08 |
| 41237.725 | 20.02 |
| 41237.729166666664 | 20.02 |
| 41237.73333333333 | 20.06 |
| 41237.7375 | 20.07 |
| 41237.74166666667 | 20.05 |
| 41237.745833333334 | 20 |
| 41237.75 | 20.07 |
| 41237.754166666666 | 20.06 |
| 41237.75833333333 | 20.06 |
| 41237.7625 | 20.04 |
| 41237.76666666667 | 20.06 |
| 41237.770833333336 | 20.06 |
| 41237.775 | 20.03 |
| 41237.77916666667 | 20.07 |
| 41237.78333333333 | 20.06 |
| 41237.7875 | 20.06 |
| 41237.791666666664 | 20 |
| 41237.79583333333 | 20.02 |
| 41237.8 | 20.05 |
| 41237.808333333334 | 20.07 |
| 41237.8125 | 20.05 |
| 41237.816666666666 | 20.04 |
| 41237.82083333333 | 20.06 |
| 41237.825 | 20.05 |
| 41237.82916666667 | 20.05 |
| 41237.833333333336 | 20.07 |
| 41237.8375 | 20.05 |
| 41237.84166666667 | 20.07 |
| 41237.84583333333 | 20.07 |
| 41237.85 | 20.03 |
| 41237.854166666664 | 20.03 |
| 41237.85833333333 | 20.07 |
| 41237.8625 | 20.08 |
| 41237.86666666667 | 20.03 |
| 41237.870833333334 | 20.05 |
| 41237.875 | 20.03 |
| 41237.879166666666 | 20.04 |
| 41237.88333333333 | 20.04 |
| 41237.89166666667 | 19.99 |
| 41237.895833333336 | 20.02 |
| 41237.9 | 20.03 |
| 41237.90416666667 | 20.06 |
| 41237.90833333333 | 20.03 |
| 41237.9125 | 20.03 |
| 41237.916666666664 | 20.04 |
| 41237.92083333333 | 20.03 |
| 41237.925 | 20.05 |
| 41237.933333333334 | 20.05 |
| 41237.9375 | 20.02 |
| 41237.941666666666 | 20.04 |
| 41237.94583333333 | 20.04 |
| 41237.95 | 20.04 |
| 41237.95416666667 | 20.04 |
| 41237.958333333336 | 20.03 |
| 41237.9625 | 20.03 |
| 41237.96666666667 | 19.99 |
| 41237.97083333333 | 20.03 |
| 41237.975 | 20.03 |
| 41237.979166666664 | 20.01 |
| 41237.98333333333 | 20.04 |
| 41237.9875 | 20.04 |
| 41237.99166666667 | 20.03 |
| 41237.995833333334 | 20.03 |
| 41238.0 | 20.01 |
| 41238.004166666666 | 20 |
| 41238.00833333333 | 20.04 |
| 41238.0125 | 20.06 |
| 41238.01666666667 | 20.04 |
| 41238.020833333336 | 20.04 |
| 41238.025 | 20.04 |
| 41238.02916666667 | 20.05 |
| 41238.03333333333 | 20.02 |
| 41238.0375 | 20.02 |
| 41238.041666666664 | 19.99 |
| 41238.04583333333 | 20.04 |
| 41238.05 | 20.02 |
| 41238.05416666667 | 20.01 |
| 41238.058333333334 | 20.02 |
| 41238.0625 | 20.05 |
| 41238.066666666666 | 20.04 |
| 41238.07083333333 | 20.02 |
| 41238.075 | 20.02 |
| 41238.07916666667 | 20.03 |
| 41238.083333333336 | 20 |
| 41238.0875 | 20.02 |
| 41238.09166666667 | 20.03 |
| 41238.09583333333 | 20.04 |
| 41238.1 | 20.05 |
| 41238.104166666664 | 20.01 |
| 41238.10833333333 | 20.02 |
| 41238.1125 | 20.04 |
| 41238.11666666667 | 20.02 |
| 41238.120833333334 | 20.03 |
| 41238.125 | 20.04 |
| 41238.129166666666 | 20.02 |
| 41238.13333333333 | 20.02 |
| 41238.1375 | 20.01 |
| 41238.14166666667 | 20 |
| 41238.145833333336 | 20.03 |
| 41238.15 | 19.99 |
| 41238.15416666667 | 20.01 |
| 41238.15833333333 | 20 |
| 41238.1625 | 20.02 |
| 41238.166666666664 | 19.99 |
| 41238.17083333333 | 20.01 |
| 41238.175 | 20 |
| 41238.17916666667 | 20.02 |
| 41238.183333333334 | 20 |
| 41238.1875 | 20.01 |
| 41238.191666666666 | 20.03 |
| 41238.19583333333 | 20.04 |
| 41238.2 | 20.02 |
| 41238.20416666667 | 20.01 |
| 41238.208333333336 | 20.01 |
| 41238.2125 | 20.03 |
| 41238.21666666667 | 20.03 |
| 41238.22083333333 | 20.01 |
| 41238.225 | 20 |
| 41238.229166666664 | 20.02 |
| 41238.23333333333 | 20.02 |
| 41238.2375 | 20.01 |
| 41238.24166666667 | 20.04 |
| 41238.245833333334 | 20.03 |
| 41238.25 | 20.05 |
| 41238.254166666666 | 20.01 |
| 41238.25833333333 | 20.02 |
| 41238.2625 | 20.01 |
| 41238.26666666667 | 20.02 |
| 41238.270833333336 | 20.03 |
| 41238.275 | 20.03 |
| 41238.27916666667 | 20 |
| 41238.28333333333 | 20.02 |
| 41238.2875 | 20.03 |
| 41238.291666666664 | 20.04 |
| 41238.3 | 20.05 |
| 41238.30416666667 | 20.02 |
| 41238.308333333334 | 20 |
| 41238.3125 | 20.02 |
| 41238.316666666666 | 20.01 |
| 41238.32083333333 | 20.01 |
| 41238.325 | 20.05 |
| 41238.32916666667 | 20.05 |
| 41238.333333333336 | 20.07 |
| 41238.3375 | 20.04 |
| 41238.34166666667 | 20.02 |
| 41238.34583333333 | 20.01 |
| 41238.35 | 20.02 |
| 41238.354166666664 | 20.01 |
| 41238.35833333333 | 20.01 |
| 41238.3625 | 20.01 |
| 41238.36666666667 | 19.99 |
| 41238.370833333334 | 19.96 |
| 41238.375 | 20.03 |
| 41238.379166666666 | 20.03 |
| 41238.38333333333 | 20.02 |
| 41238.3875 | 20.03 |
| 41238.39166666667 | 20.01 |
| 41238.395833333336 | 20 |
| 41238.4 | 20.05 |
| 41238.40416666667 | 20.02 |
| 41238.40833333333 | 19.99 |
| 41238.4125 | 20.03 |
| 41238.416666666664 | 20.02 |
| 41238.42083333333 | 20.03 |
| 41238.425 | 20.02 |
| 41238.42916666667 | 20.02 |
| 41238.433333333334 | 20.05 |
| 41238.4375 | 20.02 |
| 41238.441666666666 | 20.01 |
| 41238.44583333333 | 19.98 |
| 41238.45 | 20.02 |
| 41238.45416666667 | 20.03 |
| 41238.458333333336 | 20.03 |
| 41238.4625 | 20.02 |
| 41238.46666666667 | 20.02 |
| 41238.47083333333 | 20.02 |
| 41238.475 | 20.01 |
| 41238.479166666664 | 20.02 |
| 41238.48333333333 | 19.99 |
| 41238.4875 | 20.03 |
| 41238.49166666667 | 20.01 |
| 41238.495833333334 | 20.03 |
| 41238.5 | 20.01 |
| 41238.504166666666 | 20.07 |
| 41238.50833333333 | 20 |
| 41238.5125 | 20.02 |
| 41238.51666666667 | 20.05 |
| 41238.520833333336 | 20.03 |
| 41238.525 | 20.02 |
| 41238.52916666667 | 20.03 |
| 41238.53333333333 | 19.98 |
| 41238.5375 | 20.02 |
| 41238.541666666664 | 20.05 |
| 41238.54583333333 | 20.02 |
| 41238.55 | 20.02 |
| 41238.55416666667 | 20.07 |
| 41238.558333333334 | 20.03 |
| 41238.5625 | 20.03 |
| 41238.566666666666 | 20.02 |
| 41238.57083333333 | 20.02 |
| 41238.575 | 20.01 |
| 41238.57916666667 | 20.02 |
| 41238.583333333336 | 20.06 |
| 41238.5875 | 20.06 |
| 41238.59166666667 | 20.03 |
| 41238.59583333333 | 20.06 |
| 41238.6 | 20.04 |
| 41238.604166666664 | 20.04 |
| 41238.60833333333 | 20.03 |
| 41238.6125 | 20.02 |
| 41238.61666666667 | 20.04 |
| 41238.620833333334 | 20.01 |
| 41238.625 | 20.04 |
| 41238.629166666666 | 19.99 |
| 41238.63333333333 | 20.02 |
| 41238.6375 | 20.01 |
| 41238.64166666667 | 20.02 |
| 41238.645833333336 | 20.03 |
| 41238.65 | 20.05 |
| 41238.65416666667 | 20.04 |
| 41238.65833333333 | 20.05 |
| 41238.6625 | 20.04 |
| 41238.666666666664 | 20.03 |
| 41238.67083333333 | 20.02 |
| 41238.675 | 20.06 |
| 41238.67916666667 | 20.05 |
| 41238.683333333334 | 20.05 |
| 41238.6875 | 20.06 |
| 41238.691666666666 | 20.04 |
| 41238.69583333333 | 20.04 |
| 41238.7 | 20.05 |
| 41238.70416666667 | 20.03 |
| 41238.708333333336 | 20.01 |
| 41238.7125 | 19.99 |
| 41238.71666666667 | 20.03 |
| 41238.72083333333 | 20.06 |
| 41238.725 | 20.05 |
| 41238.729166666664 | 20.02 |
| 41238.73333333333 | 19.99 |
| 41238.7375 | 20 |
| 41238.74166666667 | 20.06 |
| 41238.745833333334 | 20.04 |
| 41238.75 | 20.03 |
| 41238.754166666666 | 20.02 |
| 41238.75833333333 | 20.02 |
| 41238.7625 | 20.04 |
| 41238.76666666667 | 20.07 |
| 41238.770833333336 | 20.04 |
| 41238.775 | 20.04 |
| 41238.77916666667 | 20.07 |
| 41238.78333333333 | 20.04 |
| 41238.7875 | 20.03 |
| 41238.791666666664 | 20.03 |
| 41238.79583333333 | 20.02 |
| 41238.8 | 20.04 |
| 41238.80416666667 | 20.04 |
| 41238.808333333334 | 20.03 |
| 41238.8125 | 20.01 |
| 41238.816666666666 | 20.06 |
| 41238.82083333333 | 20 |
| 41238.825 | 20 |
| 41238.82916666667 | 20.05 |
| 41238.833333333336 | 20.06 |
| 41238.8375 | 20.03 |
| 41238.84166666667 | 20 |
| 41238.84583333333 | 20 |
| 41238.85 | 20.02 |
| 41238.854166666664 | 20.04 |
| 41238.85833333333 | 20.01 |
| 41238.8625 | 20.04 |
| 41238.86666666667 | 20.01 |
| 41238.870833333334 | 20.05 |
| 41238.875 | 20.03 |
| 41238.879166666666 | 20.04 |
| 41238.88333333333 | 20.06 |
| 41238.8875 | 20.03 |
| 41238.89166666667 | 20.01 |
| 41238.895833333336 | 20.02 |
| 41238.9 | 20.03 |
| 41238.90416666667 | 20.01 |
| 41238.90833333333 | 20.01 |
| 41238.9125 | 20.02 |
| 41238.916666666664 | 20.02 |
| 41238.92083333333 | 20.04 |
| 41238.925 | 20.02 |
| 41238.933333333334 | 20.03 |
| 41238.9375 | 20.03 |
| 41238.941666666666 | 20.02 |
| 41238.94583333333 | 20.03 |
| 41238.95 | 20.02 |
| 41238.95416666667 | 20.02 |
| 41238.958333333336 | 20.04 |
| 41238.9625 | 20.05 |
| 41238.96666666667 | 20.04 |
| 41238.97083333333 | 20.03 |
| 41238.975 | 20.01 |
| 41238.979166666664 | 20 |
| 41238.98333333333 | 20.02 |
| 41238.9875 | 20.02 |
| 41238.99166666667 | 20.02 |
| 41238.995833333334 | 20.03 |
| 41239.0 | 20.03 |
| 41239.004166666666 | 20 |
| 41239.00833333333 | 20.02 |
| 41239.0125 | 20.02 |
| 41239.01666666667 | 19.99 |
| 41239.020833333336 | 19.99 |
| 41239.025 | 19.99 |
| 41239.02916666667 | 19.99 |
| 41239.03333333333 | 20.03 |
| 41239.0375 | 20.02 |
| 41239.041666666664 | 20.03 |
| 41239.04583333333 | 20.02 |
| 41239.05 | 20.03 |
| 41239.05416666667 | 20.03 |
| 41239.058333333334 | 20.01 |
| 41239.0625 | 19.99 |
| 41239.066666666666 | 20 |
| 41239.07083333333 | 20.04 |
| 41239.075 | 20 |
| 41239.07916666667 | 20.01 |
| 41239.083333333336 | 20.02 |
| 41239.0875 | 20.03 |
| 41239.09166666667 | 20.03 |
| 41239.09583333333 | 20.02 |
| 41239.1 | 20 |
| 41239.104166666664 | 20.01 |
| 41239.10833333333 | 20.03 |
| 41239.1125 | 20.03 |
| 41239.11666666667 | 20.02 |
| 41239.120833333334 | 19.99 |
| 41239.125 | 20.03 |
| 41239.129166666666 | 20.02 |
| 41239.13333333333 | 20.03 |
| 41239.1375 | 20.02 |
| 41239.14166666667 | 20.06 |
| 41239.145833333336 | 20.06 |
| 41239.15 | 20.02 |
| 41239.15416666667 | 20.03 |
| 41239.15833333333 | 19.99 |
| 41239.1625 | 20.04 |
| 41239.166666666664 | 20.02 |
| 41239.17083333333 | 20.04 |
| 41239.175 | 20 |
| 41239.17916666667 | 20.04 |
| 41239.183333333334 | 19.98 |
| 41239.1875 | 20.02 |
| 41239.191666666666 | 20.01 |
| 41239.19583333333 | 20.03 |
| 41239.2 | 19.99 |
| 41239.20416666667 | 20.02 |
| 41239.208333333336 | 20.01 |
| 41239.2125 | 20.04 |
| 41239.21666666667 | 20.04 |
| 41239.22083333333 | 20.01 |
| 41239.225 | 20.02 |
| 41239.229166666664 | 20.03 |
| 41239.23333333333 | 20.05 |
| 41239.2375 | 20.02 |
| 41239.24166666667 | 20.01 |
| 41239.245833333334 | 20.03 |
| 41239.25 | 20.01 |
| 41239.254166666666 | 20.04 |
| 41239.25833333333 | 20.03 |
| 41239.2625 | 19.96 |
| 41239.26666666667 | 20 |
| 41239.270833333336 | 20.01 |
| 41239.275 | 20.01 |
| 41239.27916666667 | 20.04 |
| 41239.28333333333 | 20.02 |
| 41239.2875 | 20.03 |
| 41239.291666666664 | 20.03 |
| 41239.29583333333 | 20.02 |
| 41239.3 | 20.02 |
| 41239.30416666667 | 19.98 |
| 41239.308333333334 | 20.02 |
| 41239.3125 | 20.01 |
| 41239.316666666666 | 20.02 |
| 41239.32083333333 | 20.02 |
| 41239.325 | 20.03 |
| 41239.32916666667 | 20.01 |
| 41239.333333333336 | 20.02 |
| 41239.3375 | 20.02 |
| 41239.34166666667 | 20.03 |
| 41239.34583333333 | 20.04 |
| 41239.35 | 20.04 |
| 41239.354166666664 | 20.03 |
| 41239.35833333333 | 20.01 |
| 41239.3625 | 20.05 |
| 41239.36666666667 | 20.01 |
| 41239.370833333334 | 20.02 |
| 41239.375 | 19.99 |
| 41239.379166666666 | 19.97 |
| 41239.38333333333 | 20.03 |
| 41239.3875 | 20.07 |
| 41239.39166666667 | 20.15 |
| 41239.395833333336 | 20.22 |
| 41239.4 | 20.14 |
| 41239.40416666667 | 20.2 |
| 41239.40833333333 | 20.19 |
| 41239.4125 | 20.26 |
| 41239.416666666664 | 20.22 |
| 41239.42083333333 | 20.16 |
| 41239.425 | 20.08 |
| 41239.42916666667 | 20.11 |
| 41239.433333333334 | 20.06 |
| 41239.4375 | 20.1 |
| 41239.441666666666 | 20.17 |
| 41239.44583333333 | 20.19 |
| 41239.45 | 20.18 |
| 41239.45416666667 | 20.12 |
| 41239.458333333336 | 20.07 |
| 41239.4625 | 20.13 |
| 41239.46666666667 | 20.09 |
| 41239.47083333333 | 20.07 |
| 41239.475 | 20.08 |
| 41239.479166666664 | 20.09 |
| 41239.48333333333 | 20.06 |
| 41239.4875 | 20.03 |
| 41239.49166666667 | 20.11 |
| 41239.495833333334 | 20.13 |
| 41239.5 | 20.09 |
| 41239.504166666666 | 20.09 |
| 41239.50833333333 | 20.1 |
| 41239.5125 | 20.09 |
| 41239.51666666667 | 20.1 |
| 41239.520833333336 | 20.11 |
| 41239.525 | 20.11 |
| 41239.52916666667 | 20.05 |
| 41239.53333333333 | 20.08 |
| 41239.5375 | 20.06 |
| 41239.541666666664 | 20.09 |
| 41239.54583333333 | 20.04 |
| 41239.55 | 20.07 |
| 41239.55416666667 | 20.09 |
| 41239.558333333334 | 20.09 |
| 41239.5625 | 20.1 |
| 41239.566666666666 | 20.08 |
| 41239.57083333333 | 20.11 |
| 41239.575 | 20.12 |
| 41239.57916666667 | 20.15 |
| 41239.583333333336 | 20.14 |
| 41239.5875 | 20.09 |
| 41239.59166666667 | 20.07 |
| 41239.59583333333 | 20.08 |
| 41239.6 | 20.13 |
| 41239.604166666664 | 20.05 |
| 41239.60833333333 | 20.05 |
| 41239.6125 | 20.09 |
| 41239.61666666667 | 20.1 |
| 41239.620833333334 | 20.11 |
| 41239.625 | 20.12 |
| 41239.629166666666 | 20.13 |
| 41239.63333333333 | 20.16 |
| 41239.6375 | 20.11 |
| 41239.64166666667 | 20.12 |
| 41239.645833333336 | 20.13 |
| 41239.65 | 20.08 |
| 41239.65416666667 | 20.03 |
| 41239.65833333333 | 20.09 |
| 41239.6625 | 20.1 |
| 41239.666666666664 | 20.07 |
| 41239.67083333333 | 20.06 |
| 41239.675 | 20.08 |
| 41239.67916666667 | 20.04 |
| 41239.683333333334 | 20.05 |
| 41239.6875 | 20.1 |
| 41239.691666666666 | 20.08 |
| 41239.69583333333 | 20.1 |
| 41239.7 | 20.1 |
| 41239.70416666667 | 20.08 |
| 41239.708333333336 | 20.12 |
| 41239.7125 | 20.1 |
| 41239.71666666667 | 20.08 |
| 41239.72083333333 | 20.09 |
| 41239.725 | 20.09 |
| 41239.729166666664 | 20.09 |
| 41239.73333333333 | 20.1 |
| 41239.7375 | 20.12 |
| 41239.74166666667 | 20.13 |
| 41239.745833333334 | 20.1 |
| 41239.75 | 20.11 |
| 41239.754166666666 | 20.1 |
| 41239.75833333333 | 20.1 |
| 41239.7625 | 20.12 |
| 41239.76666666667 | 20.1 |
| 41239.770833333336 | 20.08 |
| 41239.775 | 20.14 |
| 41239.77916666667 | 20.1 |
| 41239.78333333333 | 20.1 |
| 41239.7875 | 20.09 |
| 41239.791666666664 | 20.11 |
| 41239.79583333333 | 20.1 |
| 41239.8 | 20.12 |
| 41239.80416666667 | 20.14 |
| 41239.808333333334 | 20.13 |
| 41239.8125 | 20.11 |
| 41239.816666666666 | 20.06 |
| 41239.82083333333 | 20.13 |
| 41239.825 | 20.09 |
| 41239.82916666667 | 20.1 |
| 41239.833333333336 | 20.11 |
| 41239.8375 | 20.07 |
| 41239.84166666667 | 20.06 |
| 41239.84583333333 | 20.07 |
| 41239.85 | 20.11 |
| 41239.854166666664 | 20.1 |
| 41239.85833333333 | 20.11 |
| 41239.8625 | 20.09 |
| 41239.86666666667 | 20.01 |
| 41239.870833333334 | 20.06 |
| 41239.875 | 20.11 |
| 41239.879166666666 | 20.08 |
| 41239.88333333333 | 20.11 |
| 41239.8875 | 20.11 |
| 41239.89166666667 | 20.1 |
| 41239.895833333336 | 20.09 |
| 41239.9 | 20.1 |
| 41239.90416666667 | 20.09 |
| 41239.90833333333 | 20.1 |
| 41239.9125 | 20.08 |
| 41239.916666666664 | 20.09 |
| 41239.92083333333 | 20.08 |
| 41239.925 | 20.11 |
| 41239.92916666667 | 20.08 |
| 41239.933333333334 | 20.11 |
| 41239.9375 | 20.13 |
| 41239.941666666666 | 20.06 |
| 41239.94583333333 | 20.1 |
| 41239.95 | 20.08 |
| 41239.95416666667 | 20.11 |
| 41239.958333333336 | 20.09 |
| 41239.9625 | 20.08 |
| 41239.96666666667 | 20.07 |
| 41239.97083333333 | 20.07 |
| 41239.975 | 20.08 |
| 41239.979166666664 | 20.08 |
| 41239.98333333333 | 20.04 |
| 41239.9875 | 20.09 |
| 41239.99166666667 | 20.08 |
| 41239.995833333334 | 20.11 |
| 41240.0 | 20.05 |
| 41240.004166666666 | 20.06 |
| 41240.00833333333 | 20.06 |
| 41240.0125 | 20.06 |
| 41240.01666666667 | 20.08 |
| 41240.020833333336 | 20.07 |
| 41240.025 | 20.09 |
| 41240.02916666667 | 20.09 |
| 41240.03333333333 | 20.1 |
| 41240.0375 | 20.11 |
| 41240.041666666664 | 20.09 |
| 41240.04583333333 | 20.09 |
| 41240.05 | 20.12 |
| 41240.05416666667 | 20.11 |
| 41240.058333333334 | 20.12 |
| 41240.0625 | 20.08 |
| 41240.066666666666 | 20.05 |
| 41240.07083333333 | 20.11 |
| 41240.075 | 20.1 |
| 41240.07916666667 | 20.08 |
| 41240.083333333336 | 20.09 |
| 41240.0875 | 20.13 |
| 41240.09166666667 | 20.12 |
| 41240.09583333333 | 20.1 |
| 41240.1 | 20.11 |
| 41240.104166666664 | 20.1 |
| 41240.10833333333 | 20.11 |
| 41240.1125 | 20.11 |
| 41240.11666666667 | 20.1 |
| 41240.120833333334 | 20.1 |
| 41240.125 | 20.09 |
| 41240.129166666666 | 20.09 |
| 41240.13333333333 | 20.11 |
| 41240.14166666667 | 20.08 |
| 41240.145833333336 | 20.05 |
| 41240.15 | 20.1 |
| 41240.15416666667 | 20.12 |
| 41240.15833333333 | 20.12 |
| 41240.1625 | 20.09 |
| 41240.166666666664 | 20.11 |
| 41240.17083333333 | 20.08 |
| 41240.175 | 20.09 |
| 41240.17916666667 | 20.1 |
| 41240.183333333334 | 20.1 |
| 41240.1875 | 20.1 |
| 41240.191666666666 | 20.08 |
| 41240.19583333333 | 20.05 |
| 41240.2 | 20.07 |
| 41240.20416666667 | 20.08 |
| 41240.208333333336 | 20.07 |
| 41240.2125 | 20.08 |
| 41240.21666666667 | 20.12 |
| 41240.225 | 20.09 |
| 41240.229166666664 | 20.1 |
| 41240.23333333333 | 20.13 |
| 41240.2375 | 20.08 |
| 41240.24166666667 | 20.09 |
| 41240.245833333334 | 20.13 |
| 41240.25 | 20.09 |
| 41240.254166666666 | 20.09 |
| 41240.25833333333 | 20.08 |
| 41240.2625 | 20.11 |
| 41240.26666666667 | 20.08 |
| 41240.270833333336 | 20.11 |
| 41240.275 | 20.1 |
| 41240.27916666667 | 20.11 |
| 41240.28333333333 | 20.06 |
| 41240.2875 | 20.12 |
| 41240.291666666664 | 20.08 |
| 41240.29583333333 | 20.07 |
| 41240.3 | 20.08 |
| 41240.30416666667 | 20.08 |
| 41240.308333333334 | 20.09 |
| 41240.3125 | 20.1 |
| 41240.316666666666 | 20.1 |
| 41240.32083333333 | 20.1 |
| 41240.325 | 20.07 |
| 41240.32916666667 | 20.06 |
| 41240.333333333336 | 20.05 |
| 41240.3375 | 20.11 |
| 41240.34166666667 | 20.1 |
| 41240.34583333333 | 20.05 |
| 41240.35 | 20.08 |
| 41240.354166666664 | 20.07 |
| 41240.35833333333 | 20.06 |
| 41240.3625 | 20.08 |
| 41240.36666666667 | 20.09 |
| 41240.370833333334 | 20.13 |
| 41240.375 | 20.1 |
| 41240.379166666666 | 20.12 |
| 41240.38333333333 | 20.09 |
| 41240.3875 | 20.05 |
| 41240.39166666667 | 20.09 |
| 41240.395833333336 | 20.1 |
| 41240.4 | 20.1 |
| 41240.40416666667 | 20.08 |
| 41240.40833333333 | 20.11 |
| 41240.4125 | 20.11 |
| 41240.416666666664 | 20.06 |
| 41240.42083333333 | 20.1 |
| 41240.425 | 20.08 |
| 41240.42916666667 | 20.01 |
| 41240.433333333334 | 19.97 |
| 41240.4375 | 20.05 |
| 41240.441666666666 | 20.07 |
| 41240.44583333333 | 20.06 |
| 41240.45 | 20.09 |
| 41240.45416666667 | 20.04 |
| 41240.458333333336 | 20.04 |
| 41240.4625 | 20.06 |
| 41240.46666666667 | 20.11 |
| 41240.47083333333 | 20.07 |
| 41240.475 | 20.11 |
| 41240.479166666664 | 20.12 |
| 41240.48333333333 | 20.11 |
| 41240.4875 | 20.11 |
| 41240.49166666667 | 20.1 |
| 41240.495833333334 | 20.09 |
| 41240.5 | 20.07 |
| 41240.504166666666 | 20.09 |
| 41240.50833333333 | 20.11 |
| 41240.51666666667 | 20.1 |
| 41240.520833333336 | 20.1 |
| 41240.525 | 20.15 |
| 41240.52916666667 | 20.11 |
| 41240.53333333333 | 20.09 |
| 41240.5375 | 20.06 |
| 41240.541666666664 | 20.1 |
| 41240.54583333333 | 20.08 |
| 41240.55 | 20.09 |
| 41240.55416666667 | 20.12 |
| 41240.558333333334 | 20.06 |
| 41240.5625 | 20.1 |
| 41240.566666666666 | 20.12 |
| 41240.57083333333 | 20.09 |
| 41240.575 | 20.07 |
| 41240.57916666667 | 20.09 |
| 41240.583333333336 | 20.12 |
| 41240.5875 | 20.07 |
| 41240.59166666667 | 20.07 |
| 41240.6 | 20.11 |
| 41240.604166666664 | 20.07 |
| 41240.60833333333 | 20.08 |
| 41240.6125 | 20.08 |
| 41240.61666666667 | 20.11 |
| 41240.620833333334 | 20.03 |
| 41240.625 | 20.03 |
| 41240.629166666666 | 20.08 |
| 41240.63333333333 | 20.1 |
| 41240.6375 | 20.28 |
| 41240.64166666667 | 20.08 |
| 41240.645833333336 | 20.16 |
| 41240.65 | 20.05 |
| 41240.65416666667 | 20.12 |
| 41240.65833333333 | 20.13 |
| 41240.6625 | 20.04 |
| 41240.666666666664 | 20.13 |
| 41240.67083333333 | 20.05 |
| 41240.675 | 20.06 |
| 41240.67916666667 | 20.1 |
| 41240.683333333334 | 20.06 |
| 41240.6875 | 20.03 |
| 41240.691666666666 | 20.03 |
| 41240.69583333333 | 20.02 |
| 41240.7 | 20.04 |
| 41240.70416666667 | 20.06 |
| 41240.708333333336 | 20.04 |
| 41240.7125 | 20.03 |
| 41240.71666666667 | 20.01 |
| 41240.72083333333 | 20.06 |
| 41240.725 | 20.05 |
| 41240.729166666664 | 20.05 |
| 41240.73333333333 | 20.05 |
| 41240.7375 | 20.05 |
| 41240.74166666667 | 20.06 |
| 41240.745833333334 | 20.03 |
| 41240.75 | 20.06 |
| 41240.754166666666 | 20.04 |
| 41240.75833333333 | 20.04 |
| 41240.7625 | 20.06 |
| 41240.76666666667 | 20.04 |
| 41240.770833333336 | 20.05 |
| 41240.775 | 20.06 |
| 41240.77916666667 | 20.02 |
| 41240.78333333333 | 20.03 |
| 41240.7875 | 20.07 |
| 41240.791666666664 | 20.04 |
| 41240.79583333333 | 20.04 |
| 41240.8 | 20.02 |
| 41240.80416666667 | 20.07 |
| 41240.808333333334 | 20.06 |
| 41240.8125 | 20.07 |
| 41240.816666666666 | 20.04 |
| 41240.82083333333 | 20.05 |
| 41240.825 | 20.04 |
| 41240.82916666667 | 20.04 |
| 41240.833333333336 | 20.07 |
| 41240.8375 | 20.04 |
| 41240.84166666667 | 20.06 |
| 41240.84583333333 | 20.05 |
| 41240.85 | 20.05 |
| 41240.854166666664 | 20.04 |
| 41240.85833333333 | 20.05 |
| 41240.8625 | 20.04 |
| 41240.86666666667 | 20.04 |
| 41240.870833333334 | 20.02 |
| 41240.875 | 20.09 |
| 41240.879166666666 | 20.04 |
| 41240.88333333333 | 20.04 |
| 41240.89166666667 | 20.05 |
| 41240.895833333336 | 20.05 |
| 41240.9 | 20.05 |
| 41240.90416666667 | 20.06 |
| 41240.90833333333 | 20.04 |
| 41240.9125 | 20.06 |
| 41240.916666666664 | 20.05 |
| 41240.92083333333 | 20.09 |
| 41240.925 | 20.06 |
| 41240.933333333334 | 20.07 |
| 41240.9375 | 20.03 |
| 41240.941666666666 | 20.06 |
| 41240.94583333333 | 20.05 |
| 41240.95 | 20.04 |
| 41240.95416666667 | 20.02 |
| 41240.958333333336 | 20.03 |
| 41240.9625 | 20.06 |
| 41240.96666666667 | 20.05 |
| 41240.97083333333 | 20.05 |
| 41240.975 | 20.06 |
| 41240.979166666664 | 20.07 |
| 41240.98333333333 | 20.03 |
| 41240.9875 | 20.05 |
| 41240.99166666667 | 20.08 |
| 41240.995833333334 | 20.07 |
| 41241.0 | 20.06 |
| 41241.004166666666 | 20.06 |
| 41241.00833333333 | 20.04 |
| 41241.0125 | 20.05 |
| 41241.01666666667 | 20.06 |
| 41241.020833333336 | 20.06 |
| 41241.025 | 20.06 |
| 41241.02916666667 | 20.04 |
| 41241.03333333333 | 20.02 |
| 41241.0375 | 20.04 |
| 41241.041666666664 | 20.07 |
| 41241.04583333333 | 20.04 |
| 41241.05 | 20.05 |
| 41241.05416666667 | 20.04 |
| 41241.058333333334 | 20.02 |
| 41241.0625 | 20.07 |
| 41241.066666666666 | 20.05 |
| 41241.07083333333 | 20.06 |
| 41241.075 | 20.04 |
| 41241.07916666667 | 20.04 |
| 41241.083333333336 | 20.06 |
| 41241.0875 | 20.03 |
| 41241.09166666667 | 20.04 |
| 41241.1 | 20.05 |
| 41241.104166666664 | 20.04 |
| 41241.10833333333 | 20.03 |
| 41241.1125 | 20.02 |
| 41241.11666666667 | 20.06 |
| 41241.120833333334 | 20.05 |
| 41241.125 | 20.04 |
| 41241.129166666666 | 20.04 |
| 41241.13333333333 | 20.04 |
| 41241.14166666667 | 20.04 |
| 41241.145833333336 | 20.04 |
| 41241.15 | 20.01 |
| 41241.15416666667 | 20.04 |
| 41241.15833333333 | 20.03 |
| 41241.1625 | 20.03 |
| 41241.166666666664 | 20.05 |
| 41241.17083333333 | 20.03 |
| 41241.175 | 20.05 |
| 41241.17916666667 | 20.04 |
| 41241.183333333334 | 20.04 |
| 41241.1875 | 20.05 |
| 41241.191666666666 | 20.03 |
| 41241.19583333333 | 20.05 |
| 41241.2 | 20.03 |
| 41241.20416666667 | 20.02 |
| 41241.208333333336 | 20.03 |
| 41241.2125 | 20.04 |
| 41241.21666666667 | 20.1 |
| 41241.22083333333 | 20.05 |
| 41241.225 | 20.03 |
| 41241.229166666664 | 20.05 |
| 41241.23333333333 | 20.07 |
| 41241.2375 | 20.07 |
| 41241.24166666667 | 20.05 |
| 41241.245833333334 | 20.01 |
| 41241.25 | 20.06 |
| 41241.254166666666 | 20.05 |
| 41241.25833333333 | 20.04 |
| 41241.2625 | 20.06 |
| 41241.26666666667 | 20.04 |
| 41241.270833333336 | 20.06 |
| 41241.275 | 20.07 |
| 41241.27916666667 | 20.1 |
| 41241.28333333333 | 20.06 |
| 41241.2875 | 20.03 |
| 41241.291666666664 | 20.02 |
| 41241.29583333333 | 20.03 |
| 41241.3 | 20.04 |
| 41241.30416666667 | 20.04 |
| 41241.308333333334 | 20.03 |
| 41241.3125 | 20.04 |
| 41241.316666666666 | 20.09 |
| 41241.32083333333 | 20.05 |
| 41241.325 | 20.07 |
| 41241.32916666667 | 20.03 |
| 41241.333333333336 | 20.07 |
| 41241.3375 | 20.11 |
| 41241.34166666667 | 20.15 |
| 41241.34583333333 | 20.1 |
| 41241.35 | 20.15 |
| 41241.354166666664 | 20.13 |
| 41241.35833333333 | 20.05 |
| 41241.3625 | 20.07 |
| 41241.36666666667 | 20.11 |
| 41241.370833333334 | 20.07 |
| 41241.375 | 20.07 |
| 41241.379166666666 | 20.05 |
| 41241.38333333333 | 19.98 |
| 41241.3875 | 20.02 |
| 41241.39166666667 | 20 |
| 41241.395833333336 | 20.02 |
| 41241.4 | 20.05 |
| 41241.40416666667 | 20.09 |
| 41241.40833333333 | 20.1 |
| 41241.4125 | 20.09 |
| 41241.416666666664 | 20.11 |
| 41241.42083333333 | 20.04 |
| 41241.425 | 20.16 |
| 41241.42916666667 | 20.14 |
| 41241.433333333334 | 20.13 |
| 41241.4375 | 20.11 |
| 41241.441666666666 | 20.16 |
| 41241.44583333333 | 20.16 |
| 41241.45 | 20.1 |
| 41241.45416666667 | 20.14 |
| 41241.458333333336 | 20.17 |
| 41241.4625 | 20.2 |
| 41241.46666666667 | 20.16 |
| 41241.47083333333 | 20.18 |
| 41241.475 | 20.19 |
| 41241.479166666664 | 20.18 |
| 41241.48333333333 | 20.22 |
| 41241.4875 | 20.21 |
| 41241.49166666667 | 20.2 |
| 41241.495833333334 | 20.17 |
| 41241.5 | 20.14 |
| 41241.504166666666 | 20.09 |
| 41241.50833333333 | 20.12 |
| 41241.5125 | 20.11 |
| 41241.51666666667 | 20.14 |
| 41241.520833333336 | 20.16 |
| 41241.525 | 20.11 |
| 41241.52916666667 | 20.15 |
| 41241.53333333333 | 20.1 |
| 41241.5375 | 20.08 |
| 41241.541666666664 | 20.1 |
| 41241.54583333333 | 20.17 |
| 41241.55 | 20.13 |
| 41241.55416666667 | 20.18 |
| 41241.558333333334 | 20.15 |
| 41241.5625 | 20.14 |
| 41241.566666666666 | 20.2 |
| 41241.57083333333 | 20.17 |
| 41241.575 | 20.17 |
| 41241.57916666667 | 20.2 |
| 41241.583333333336 | 20.18 |
| 41241.5875 | 20.13 |
| 41241.59166666667 | 20.17 |
| 41241.59583333333 | 20.18 |
| 41241.6 | 20.14 |
| 41241.604166666664 | 20.09 |
| 41241.60833333333 | 20.18 |
| 41241.6125 | 20.18 |
| 41241.61666666667 | 20.18 |
| 41241.620833333334 | 20.18 |
| 41241.625 | 20.15 |
| 41241.629166666666 | 20.15 |
| 41241.63333333333 | 20.17 |
| 41241.6375 | 20.2 |
| 41241.64166666667 | 20.18 |
| 41241.645833333336 | 20.17 |
| 41241.65 | 20.17 |
| 41241.65416666667 | 20.15 |
| 41241.65833333333 | 20.11 |
| 41241.6625 | 20.11 |
| 41241.666666666664 | 20.12 |
| 41241.67083333333 | 20.14 |
| 41241.675 | 20.13 |
| 41241.67916666667 | 20.13 |
| 41241.683333333334 | 20.11 |
| 41241.6875 | 20.12 |
| 41241.691666666666 | 20.12 |
| 41241.69583333333 | 20.12 |
| 41241.7 | 20.15 |
| 41241.70416666667 | 20.12 |
| 41241.708333333336 | 20.12 |
| 41241.7125 | 20.11 |
| 41241.71666666667 | 20.12 |
| 41241.72083333333 | 20.07 |
| 41241.725 | 20.09 |
| 41241.729166666664 | 20.09 |
| 41241.73333333333 | 20.14 |
| 41241.7375 | 20.1 |
| 41241.74166666667 | 20.08 |
| 41241.745833333334 | 20.13 |
| 41241.75 | 20.08 |
| 41241.754166666666 | 20.09 |
| 41241.75833333333 | 20.09 |
| 41241.7625 | 20.13 |
| 41241.76666666667 | 20.12 |
| 41241.770833333336 | 20.08 |
| 41241.775 | 20.12 |
| 41241.77916666667 | 20.1 |
| 41241.78333333333 | 20.11 |
| 41241.7875 | 20.11 |
| 41241.791666666664 | 20.09 |
| 41241.79583333333 | 20.11 |
| 41241.8 | 20.1 |
| 41241.80416666667 | 20.1 |
| 41241.808333333334 | 20.1 |
| 41241.8125 | 20.08 |
| 41241.816666666666 | 20.08 |
| 41241.82083333333 | 20.11 |
| 41241.825 | 20.1 |
| 41241.82916666667 | 20.08 |
| 41241.833333333336 | 20.1 |
| 41241.8375 | 20.06 |
| 41241.84166666667 | 20.09 |
| 41241.84583333333 | 20.1 |
| 41241.85 | 20.07 |
| 41241.854166666664 | 20.09 |
| 41241.85833333333 | 20.05 |
| 41241.8625 | 20.12 |
| 41241.86666666667 | 20.11 |
| 41241.870833333334 | 20.04 |
| 41241.875 | 20.08 |
| 41241.879166666666 | 20.13 |
| 41241.88333333333 | 20.05 |
| 41241.89166666667 | 20.12 |
| 41241.895833333336 | 20.09 |
| 41241.9 | 20.05 |
| 41241.90416666667 | 20.06 |
| 41241.90833333333 | 20.08 |
| 41241.9125 | 20.08 |
| 41241.916666666664 | 20.07 |
| 41241.92083333333 | 20.06 |
| 41241.925 | 20.07 |
| 41241.92916666667 | 20.08 |
| 41241.933333333334 | 20.05 |
| 41241.9375 | 20.04 |
| 41241.941666666666 | 20.1 |
| 41241.94583333333 | 20.04 |
| 41241.95 | 20.08 |
| 41241.95416666667 | 20.06 |
| 41241.958333333336 | 20.05 |
| 41241.9625 | 20.06 |
| 41241.96666666667 | 20.07 |
| 41241.97083333333 | 20.06 |
| 41241.975 | 20.04 |
| 41241.979166666664 | 20.06 |
| 41241.98333333333 | 20.03 |
| 41241.9875 | 20.08 |
| 41241.99166666667 | 20.08 |
| 41241.995833333334 | 20.06 |
| 41242.0 | 20.1 |
| 41242.004166666666 | 20.1 |
| 41242.00833333333 | 20.11 |
| 41242.0125 | 20.09 |
| 41242.01666666667 | 20.04 |
| 41242.020833333336 | 20.1 |
| 41242.025 | 20.09 |
| 41242.02916666667 | 20.04 |
| 41242.03333333333 | 20.04 |
| 41242.0375 | 20.05 |
| 41242.041666666664 | 20.07 |
| 41242.04583333333 | 20.09 |
| 41242.05 | 20.04 |
| 41242.05416666667 | 20.06 |
| 41242.058333333334 | 20.09 |
| 41242.0625 | 20.07 |
| 41242.066666666666 | 20.03 |
| 41242.07083333333 | 20.09 |
| 41242.075 | 20.07 |
| 41242.07916666667 | 20.08 |
| 41242.083333333336 | 20.06 |
| 41242.0875 | 20.07 |
| 41242.09166666667 | 20.08 |
| 41242.09583333333 | 20.11 |
| 41242.1 | 20.11 |
| 41242.104166666664 | 20.08 |
| 41242.10833333333 | 20.07 |
| 41242.1125 | 20.07 |
| 41242.11666666667 | 20.07 |
| 41242.120833333334 | 20.07 |
| 41242.125 | 20.06 |
| 41242.129166666666 | 20.07 |
| 41242.13333333333 | 20.08 |
| 41242.1375 | 20.1 |
| 41242.14166666667 | 20.09 |
| 41242.145833333336 | 20.1 |
| 41242.15 | 20.09 |
| 41242.15416666667 | 20.1 |
| 41242.15833333333 | 20.08 |
| 41242.1625 | 20.03 |
| 41242.166666666664 | 20.06 |
| 41242.17083333333 | 20.05 |
| 41242.175 | 20.04 |
| 41242.17916666667 | 20.05 |
| 41242.183333333334 | 20.08 |
| 41242.1875 | 20.07 |
| 41242.191666666666 | 20.05 |
| 41242.19583333333 | 20.04 |
| 41242.2 | 20.08 |
| 41242.20416666667 | 20.06 |
| 41242.208333333336 | 20.03 |
| 41242.2125 | 20.08 |
| 41242.21666666667 | 20.07 |
| 41242.22083333333 | 20.07 |
| 41242.225 | 20.08 |
| 41242.229166666664 | 20.08 |
| 41242.23333333333 | 20.05 |
| 41242.2375 | 20.06 |
| 41242.24166666667 | 20.09 |
| 41242.245833333334 | 20.04 |
| 41242.25 | 20.08 |
| 41242.254166666666 | 20.08 |
| 41242.25833333333 | 20.07 |
| 41242.2625 | 20.06 |
| 41242.26666666667 | 20.06 |
| 41242.270833333336 | 20.08 |
| 41242.275 | 20.05 |
| 41242.27916666667 | 20.05 |
| 41242.28333333333 | 20.06 |
| 41242.2875 | 20.06 |
| 41242.291666666664 | 20.1 |
| 41242.29583333333 | 20.05 |
| 41242.3 | 20.08 |
| 41242.30416666667 | 20.06 |
| 41242.308333333334 | 20.06 |
| 41242.3125 | 20.1 |
| 41242.316666666666 | 20.14 |
| 41242.32083333333 | 20.16 |
| 41242.325 | 20.15 |
| 41242.32916666667 | 20.15 |
| 41242.333333333336 | 20.14 |
| 41242.3375 | 20.18 |
| 41242.34166666667 | 20.08 |
| 41242.34583333333 | 20.1 |
| 41242.35 | 20.08 |
| 41242.354166666664 | 20.19 |
| 41242.35833333333 | 20.15 |
| 41242.3625 | 20.19 |
| 41242.36666666667 | 20.18 |
| 41242.370833333334 | 20.15 |
| 41242.375 | 20.1 |
| 41242.379166666666 | 20.13 |
| 41242.38333333333 | 20.14 |
| 41242.3875 | 20.06 |
| 41242.39166666667 | 20.09 |
| 41242.395833333336 | 20.06 |
| 41242.4 | 20.08 |
| 41242.40416666667 | 20.07 |
| 41242.40833333333 | 20.09 |
| 41242.4125 | 20.06 |
| 41242.416666666664 | 20.09 |
| 41242.42083333333 | 20.05 |
| 41242.425 | 20.12 |
| 41242.42916666667 | 20.11 |
| 41242.433333333334 | 20.12 |
| 41242.4375 | 20.07 |
| 41242.441666666666 | 20.1 |
| 41242.44583333333 | 20.09 |
| 41242.45 | 20.08 |
| 41242.45416666667 | 20.05 |
| 41242.458333333336 | 20.12 |
| 41242.4625 | 20.13 |
| 41242.46666666667 | 20.1 |
| 41242.47083333333 | 20.04 |
| 41242.475 | 20.11 |
| 41242.479166666664 | 20.12 |
| 41242.48333333333 | 20.12 |
| 41242.4875 | 20.1 |
| 41242.49166666667 | 20.1 |
| 41242.495833333334 | 20.1 |
| 41242.5 | 20.11 |
| 41242.504166666666 | 20.08 |
| 41242.50833333333 | 20.13 |
| 41242.5125 | 20.08 |
| 41242.51666666667 | 20.09 |
| 41242.520833333336 | 20.08 |
| 41242.525 | 20.08 |
| 41242.52916666667 | 20.09 |
| 41242.53333333333 | 20.06 |
| 41242.5375 | 20.07 |
| 41242.541666666664 | 20.09 |
| 41242.54583333333 | 20.07 |
| 41242.55 | 20.03 |
| 41242.55416666667 | 20.05 |
| 41242.558333333334 | 20.09 |
| 41242.5625 | 20.09 |
| 41242.566666666666 | 20.09 |
| 41242.57083333333 | 20.08 |
| 41242.575 | 20.09 |
| 41242.57916666667 | 20.11 |
| 41242.583333333336 | 20.1 |
| 41242.5875 | 20.1 |
| 41242.59166666667 | 20.11 |
| 41242.59583333333 | 20.1 |
| 41242.6 | 20.05 |
| 41242.604166666664 | 20.09 |
| 41242.60833333333 | 20.03 |
| 41242.6125 | 20.09 |
| 41242.61666666667 | 20.07 |
| 41242.620833333334 | 20.1 |
| 41242.625 | 20.1 |
| 41242.629166666666 | 20.1 |
| 41242.63333333333 | 20.09 |
| 41242.6375 | 20.1 |
| 41242.64166666667 | 20.09 |
| 41242.645833333336 | 20.11 |
| 41242.65 | 20.1 |
| 41242.65416666667 | 20.06 |
| 41242.65833333333 | 20.1 |
| 41242.6625 | 20.04 |
| 41242.666666666664 | 20.09 |
| 41242.67083333333 | 20.13 |
| 41242.675 | 20.11 |
| 41242.67916666667 | 20.12 |
| 41242.683333333334 | 20.11 |
| 41242.6875 | 20.09 |
| 41242.691666666666 | 20.1 |
| 41242.69583333333 | 20.11 |
| 41242.7 | 20.11 |
| 41242.70416666667 | 20.12 |
| 41242.708333333336 | 20.12 |
| 41242.7125 | 20.09 |
| 41242.71666666667 | 20.11 |
| 41242.72083333333 | 20.11 |
| 41242.725 | 20.09 |
| 41242.729166666664 | 20.1 |
| 41242.73333333333 | 20.1 |
| 41242.7375 | 20.12 |
| 41242.74166666667 | 20.03 |
| 41242.745833333334 | 20.1 |
| 41242.75 | 20.04 |
| 41242.754166666666 | 20.1 |
| 41242.75833333333 | 20.08 |
| 41242.7625 | 20.07 |
| 41242.76666666667 | 20.07 |
| 41242.770833333336 | 20.1 |
| 41242.775 | 20.08 |
| 41242.77916666667 | 20.09 |
| 41242.78333333333 | 20.08 |
| 41242.7875 | 20.11 |
| 41242.791666666664 | 20.1 |
| 41242.79583333333 | 20.04 |
| 41242.8 | 20.11 |
| 41242.808333333334 | 20.08 |
| 41242.8125 | 20.1 |
| 41242.816666666666 | 20.08 |
| 41242.82083333333 | 20.07 |
| 41242.825 | 20.09 |
| 41242.82916666667 | 20.1 |
| 41242.833333333336 | 20.09 |
| 41242.8375 | 20.05 |
| 41242.84166666667 | 20.08 |
| 41242.84583333333 | 20.09 |
| 41242.85 | 20.1 |
| 41242.854166666664 | 20.09 |
| 41242.85833333333 | 20.1 |
| 41242.8625 | 20.09 |
| 41242.86666666667 | 20.06 |
| 41242.870833333334 | 20.11 |
| 41242.875 | 20.1 |
| 41242.879166666666 | 20.09 |
| 41242.88333333333 | 20.1 |
| 41242.8875 | 20.04 |
| 41242.89166666667 | 20.08 |
| 41242.895833333336 | 20.07 |
| 41242.9 | 20.08 |
| 41242.90416666667 | 20.1 |
| 41242.90833333333 | 20.08 |
| 41242.9125 | 20.09 |
| 41242.916666666664 | 20.04 |
| 41242.92083333333 | 20.05 |
| 41242.925 | 20.06 |
| 41242.933333333334 | 20.08 |
| 41242.9375 | 20.06 |
| 41242.941666666666 | 20.11 |
| 41242.94583333333 | 20.06 |
| 41242.95 | 20.06 |
| 41242.95416666667 | 20.04 |
| 41242.958333333336 | 20.03 |
| 41242.9625 | 20.06 |
| 41242.96666666667 | 20.09 |
| 41242.975 | 20.06 |
| 41242.979166666664 | 20.09 |
| 41242.98333333333 | 20.07 |
| 41242.9875 | 20.08 |
| 41242.99166666667 | 20.1 |
| 41242.995833333334 | 20.05 |
| 41243.0 | 20.09 |
| 41243.004166666666 | 20.09 |
| 41243.00833333333 | 20.05 |
| 41243.0125 | 20.06 |
| 41243.01666666667 | 20.08 |
| 41243.020833333336 | 20.03 |
| 41243.025 | 20.03 |
| 41243.02916666667 | 20.07 |
| 41243.03333333333 | 20.06 |
| 41243.0375 | 20.04 |
| 41243.041666666664 | 20.1 |
| 41243.04583333333 | 20.07 |
| 41243.05 | 20.05 |
| 41243.05416666667 | 20.04 |
| 41243.058333333334 | 20.05 |
| 41243.0625 | 20.05 |
| 41243.066666666666 | 20.06 |
| 41243.07083333333 | 20.1 |
| 41243.075 | 20.02 |
| 41243.07916666667 | 20.06 |
| 41243.083333333336 | 20.07 |
| 41243.0875 | 20.09 |
| 41243.09166666667 | 20.07 |
| 41243.09583333333 | 20.06 |
| 41243.1 | 20.09 |
| 41243.104166666664 | 20.09 |
| 41243.10833333333 | 20.09 |
| 41243.1125 | 20.07 |
| 41243.11666666667 | 20.1 |
| 41243.120833333334 | 20.12 |
| 41243.125 | 20.1 |
| 41243.129166666666 | 20.05 |
| 41243.13333333333 | 20.1 |
| 41243.1375 | 20.08 |
| 41243.14166666667 | 20.08 |
| 41243.145833333336 | 20.11 |
| 41243.15 | 20.08 |
| 41243.15416666667 | 20.08 |
| 41243.15833333333 | 20.07 |
| 41243.1625 | 20.07 |
| 41243.166666666664 | 20.08 |
| 41243.17083333333 | 20.11 |
| 41243.175 | 20.07 |
| 41243.17916666667 | 20.03 |
| 41243.183333333334 | 20.09 |
| 41243.1875 | 20.08 |
| 41243.191666666666 | 20.1 |
| 41243.19583333333 | 20.05 |
| 41243.2 | 20.02 |
| 41243.20416666667 | 20.06 |
| 41243.208333333336 | 20.05 |
| 41243.2125 | 20.01 |
| 41243.21666666667 | 20.05 |
| 41243.22083333333 | 20.07 |
| 41243.225 | 20.07 |
| 41243.229166666664 | 20.06 |
| 41243.23333333333 | 20.06 |
| 41243.2375 | 20.07 |
| 41243.24166666667 | 20.05 |
| 41243.245833333334 | 20.09 |
| 41243.25 | 20.07 |
| 41243.254166666666 | 20.07 |
| 41243.25833333333 | 20.03 |
| 41243.2625 | 20.07 |
| 41243.26666666667 | 20.02 |
| 41243.270833333336 | 20.03 |
| 41243.275 | 20.1 |
| 41243.27916666667 | 20.06 |
| 41243.28333333333 | 20.1 |
| 41243.2875 | 20.05 |
| 41243.291666666664 | 20.08 |
| 41243.29583333333 | 20.08 |
| 41243.3 | 20.07 |
| 41243.30416666667 | 20.03 |
| 41243.308333333334 | 20.04 |
| 41243.3125 | 20.02 |
| 41243.316666666666 | 20.04 |
| 41243.32083333333 | 20.03 |
| 41243.325 | 20.04 |
| 41243.32916666667 | 20.07 |
| 41243.333333333336 | 20.03 |
| 41243.3375 | 20.05 |
| 41243.34166666667 | 20.07 |
| 41243.34583333333 | 20.06 |
| 41243.35 | 20.06 |
| 41243.354166666664 | 20.08 |
| 41243.35833333333 | 20.03 |
| 41243.3625 | 20.07 |
| 41243.36666666667 | 20.03 |
| 41243.370833333334 | 20.05 |
| 41243.375 | 20.02 |
| 41243.379166666666 | 20.07 |
| 41243.38333333333 | 20 |
| 41243.3875 | 20.07 |
| 41243.39166666667 | 20.08 |
| 41243.395833333336 | 20.02 |
| 41243.4 | 20.01 |
| 41243.40416666667 | 20.06 |
| 41243.40833333333 | 20.04 |
| 41243.4125 | 19.98 |
| 41243.416666666664 | 20.09 |
| 41243.42083333333 | 20.04 |
| 41243.425 | 20.05 |
| 41243.433333333334 | 20.05 |
| 41243.4375 | 20.05 |
| 41243.441666666666 | 20.05 |
| 41243.44583333333 | 20.01 |
| 41243.45 | 20.04 |
| 41243.45416666667 | 20.07 |
| 41243.458333333336 | 20.08 |
| 41243.4625 | 20.04 |
| 41243.46666666667 | 20.03 |
| 41243.47083333333 | 20.06 |
| 41243.475 | 20.05 |
| 41243.479166666664 | 20.05 |
| 41243.48333333333 | 20.08 |
| 41243.4875 | 20.1 |
| 41243.49166666667 | 20.08 |
| 41243.495833333334 | 20.07 |
| 41243.5 | 20.12 |
| 41243.504166666666 | 20.07 |
| 41243.50833333333 | 20.09 |
| 41243.51666666667 | 20.08 |
| 41243.520833333336 | 20.05 |
| 41243.525 | 20.04 |
| 41243.52916666667 | 20.08 |
| 41243.53333333333 | 20.11 |
| 41243.5375 | 20.06 |
| 41243.541666666664 | 20.05 |
| 41243.54583333333 | 20.07 |
| 41243.55 | 20.08 |
| 41243.55416666667 | 20.08 |
| 41243.558333333334 | 20.06 |
| 41243.5625 | 20.07 |
| 41243.566666666666 | 20.09 |
| 41243.57083333333 | 20.07 |
| 41243.575 | 20.08 |
| 41243.57916666667 | 20.06 |
| 41243.583333333336 | 20.09 |
| 41243.5875 | 20.03 |
| 41243.59166666667 | 20.07 |
| 41243.59583333333 | 20.02 |
| 41243.6 | 20.06 |
| 41243.604166666664 | 20.07 |
| 41243.60833333333 | 20.08 |
| 41243.6125 | 20.09 |
| 41243.61666666667 | 20.06 |
| 41243.620833333334 | 20.08 |
| 41243.625 | 20.05 |
| 41243.629166666666 | 20.03 |
| 41243.63333333333 | 20.14 |
| 41243.6375 | 20.11 |
| 41243.64166666667 | 20.04 |
| 41243.645833333336 | 20.06 |
| 41243.65 | 20.06 |
| 41243.65416666667 | 20.03 |
| 41243.65833333333 | 20.04 |
| 41243.6625 | 20.07 |
| 41243.666666666664 | 20.05 |
| 41243.67083333333 | 20.03 |
| 41243.675 | 20.01 |
| 41243.67916666667 | 20.06 |
| 41243.683333333334 | 20.03 |
| 41243.6875 | 20.05 |
| 41243.691666666666 | 20.05 |
| 41243.69583333333 | 20.02 |
| 41243.7 | 20.04 |
| 41243.70416666667 | 20.05 |
| 41243.708333333336 | 20.08 |
| 41243.7125 | 20.06 |
| 41243.71666666667 | 20.05 |
| 41243.72083333333 | 20.08 |
| 41243.725 | 20.08 |
| 41243.729166666664 | 20.07 |
| 41243.73333333333 | 20.04 |
| 41243.7375 | 20.08 |
| 41243.74166666667 | 20.07 |
| 41243.745833333334 | 20.09 |
| 41243.75 | 20.06 |
| 41243.754166666666 | 20.1 |
| 41243.75833333333 | 20.04 |
| 41243.7625 | 20.1 |
| 41243.76666666667 | 20.01 |
| 41243.770833333336 | 20.05 |
| 41243.775 | 20.11 |
| 41243.77916666667 | 20.03 |
| 41243.78333333333 | 20.06 |
| 41243.7875 | 20.03 |
| 41243.791666666664 | 20.06 |
| 41243.79583333333 | 20.02 |
| 41243.8 | 20 |
| 41243.80416666667 | 20.02 |
| 41243.808333333334 | 20.04 |
| 41243.8125 | 20.06 |
| 41243.816666666666 | 20.03 |
| 41243.82083333333 | 19.99 |
| 41243.825 | 20.03 |
| 41243.82916666667 | 20.04 |
| 41243.833333333336 | 20.07 |
| 41243.8375 | 20.02 |
| 41243.84166666667 | 19.99 |
| 41243.84583333333 | 19.99 |
| 41243.85 | 19.99 |
| 41243.854166666664 | 20 |
| 41243.85833333333 | 20.03 |
| 41243.8625 | 20.01 |
| 41243.86666666667 | 20 |
| 41243.870833333334 | 19.97 |
| 41243.875 | 20.04 |
| 41243.879166666666 | 19.98 |
| 41243.88333333333 | 19.97 |
| 41243.8875 | 20.01 |
| 41243.89166666667 | 20.03 |
| 41243.895833333336 | 20.04 |
| 41243.9 | 20.03 |
| 41243.90416666667 | 20 |
| 41243.90833333333 | 20.02 |
| 41243.9125 | 20.07 |
| 41243.916666666664 | 19.98 |
| 41243.92083333333 | 20.02 |
| 41243.925 | 20 |
| 41243.92916666667 | 20 |
| 41243.933333333334 | 20.03 |
| 41243.9375 | 20 |
| 41243.941666666666 | 20 |
| 41243.94583333333 | 20.05 |
| 41243.95 | 20 |
| 41243.95416666667 | 20.03 |
| 41243.958333333336 | 20 |
| 41243.9625 | 20 |
| 41243.96666666667 | 20.02 |
| 41243.97083333333 | 19.97 |
| 41243.975 | 20 |
| 41243.979166666664 | 20.01 |
| 41243.98333333333 | 20.02 |
| 41243.9875 | 20.01 |
| 41243.99166666667 | 19.97 |
| 41243.995833333334 | 19.94 |
| 41244.0 | 20.01 |
| 41244.004166666666 | 20.01 |
| 41244.00833333333 | 19.94 |
| 41244.0125 | 20.02 |
| 41244.01666666667 | 20.01 |
| 41244.020833333336 | 19.98 |
| 41244.025 | 20.02 |
| 41244.02916666667 | 20.03 |
| 41244.03333333333 | 20.04 |
| 41244.0375 | 19.94 |
| 41244.041666666664 | 19.96 |
| 41244.04583333333 | 19.93 |
| 41244.05 | 19.97 |
| 41244.05416666667 | 19.95 |
| 41244.058333333334 | 20.02 |
| 41244.0625 | 20 |
| 41244.066666666666 | 19.97 |
| 41244.07083333333 | 20.01 |
| 41244.075 | 19.99 |
| 41244.07916666667 | 19.98 |
| 41244.083333333336 | 19.95 |
| 41244.0875 | 20.04 |
| 41244.09166666667 | 20.01 |
| 41244.09583333333 | 20.04 |
| 41244.1 | 19.97 |
| 41244.104166666664 | 20 |
| 41244.10833333333 | 19.94 |
| 41244.1125 | 19.98 |
| 41244.11666666667 | 19.9 |
| 41244.120833333334 | 20.03 |
| 41244.125 | 19.99 |
| 41244.129166666666 | 19.96 |
| 41244.13333333333 | 19.99 |
| 41244.1375 | 20.01 |
| 41244.14166666667 | 19.98 |
| 41244.145833333336 | 19.97 |
| 41244.15 | 20.01 |
| 41244.15416666667 | 19.92 |
| 41244.15833333333 | 19.96 |
| 41244.1625 | 20.04 |
| 41244.166666666664 | 19.98 |
| 41244.17083333333 | 19.96 |
| 41244.175 | 19.99 |
| 41244.17916666667 | 19.96 |
| 41244.183333333334 | 19.97 |
| 41244.1875 | 19.95 |
| 41244.191666666666 | 20.01 |
| 41244.19583333333 | 19.92 |
| 41244.2 | 19.94 |
| 41244.20416666667 | 20.03 |
| 41244.208333333336 | 20.02 |
| 41244.2125 | 20.01 |
| 41244.21666666667 | 19.99 |
| 41244.22083333333 | 19.97 |
| 41244.225 | 19.95 |
| 41244.229166666664 | 20 |
| 41244.23333333333 | 20.03 |
| 41244.2375 | 19.97 |
| 41244.24166666667 | 19.95 |
| 41244.245833333334 | 19.96 |
| 41244.25 | 19.97 |
| 41244.254166666666 | 20 |
| 41244.25833333333 | 20.05 |
| 41244.2625 | 20.01 |
| 41244.26666666667 | 19.97 |
| 41244.270833333336 | 19.94 |
| 41244.275 | 19.98 |
| 41244.27916666667 | 19.97 |
| 41244.28333333333 | 19.97 |
| 41244.2875 | 19.97 |
| 41244.291666666664 | 20 |
| 41244.29583333333 | 19.89 |
| 41244.3 | 19.94 |
| 41244.30416666667 | 19.99 |
| 41244.308333333334 | 20.01 |
| 41244.3125 | 20.02 |
| 41244.316666666666 | 20.04 |
| 41244.32083333333 | 19.95 |
| 41244.325 | 20.04 |
| 41244.32916666667 | 19.99 |
| 41244.333333333336 | 20 |
| 41244.3375 | 19.98 |
| 41244.34166666667 | 19.99 |
| 41244.34583333333 | 19.98 |
| 41244.35 | 19.94 |
| 41244.354166666664 | 19.96 |
| 41244.35833333333 | 20.01 |
| 41244.3625 | 20.01 |
| 41244.36666666667 | 19.97 |
| 41244.370833333334 | 19.91 |
| 41244.375 | 19.97 |
| 41244.379166666666 | 20.01 |
| 41244.38333333333 | 19.99 |
| 41244.3875 | 19.91 |
| 41244.39166666667 | 20.01 |
| 41244.395833333336 | 20.04 |
| 41244.4 | 19.93 |
| 41244.40416666667 | 19.96 |
| 41244.40833333333 | 19.99 |
| 41244.4125 | 19.92 |
| 41244.416666666664 | 20.04 |
| 41244.42083333333 | 19.98 |
| 41244.425 | 20.01 |
| 41244.42916666667 | 19.92 |
| 41244.433333333334 | 19.93 |
| 41244.4375 | 20.02 |
| 41244.441666666666 | 19.92 |
| 41244.44583333333 | 20.01 |
| 41244.45 | 19.98 |
| 41244.45416666667 | 20.03 |
| 41244.458333333336 | 19.99 |
| 41244.4625 | 19.95 |
| 41244.46666666667 | 20.01 |
| 41244.47083333333 | 19.93 |
| 41244.475 | 20.03 |
| 41244.479166666664 | 19.93 |
| 41244.48333333333 | 20.01 |
| 41244.4875 | 20.06 |
| 41244.49166666667 | 20.02 |
| 41244.495833333334 | 20.01 |
| 41244.5 | 20.02 |
| 41244.504166666666 | 19.92 |
| 41244.50833333333 | 20.05 |
| 41244.5125 | 19.96 |
| 41244.51666666667 | 20.03 |
| 41244.520833333336 | 19.93 |
| 41244.525 | 20.05 |
| 41244.52916666667 | 19.99 |
| 41244.53333333333 | 20.05 |
| 41244.5375 | 20.01 |
| 41244.541666666664 | 19.97 |
| 41244.54583333333 | 19.97 |
| 41244.55 | 20.01 |
| 41244.55416666667 | 20.02 |
| 41244.558333333334 | 20.06 |
| 41244.5625 | 20.08 |
| 41244.566666666666 | 20.03 |
| 41244.57083333333 | 20.05 |
| 41244.575 | 20.02 |
| 41244.57916666667 | 19.96 |
| 41244.583333333336 | 19.96 |
| 41244.5875 | 19.98 |
| 41244.59166666667 | 20.02 |
| 41244.59583333333 | 19.97 |
| 41244.6 | 19.92 |
| 41244.604166666664 | 20.05 |
| 41244.60833333333 | 20 |
| 41244.6125 | 19.94 |
| 41244.61666666667 | 19.98 |
| 41244.620833333334 | 20 |
| 41244.625 | 20.02 |
| 41244.629166666666 | 19.97 |
| 41244.63333333333 | 20.02 |
| 41244.6375 | 19.96 |
| 41244.64166666667 | 19.95 |
| 41244.645833333336 | 20 |
| 41244.65 | 19.97 |
| 41244.65416666667 | 19.98 |
| 41244.65833333333 | 19.96 |
| 41244.6625 | 19.98 |
| 41244.666666666664 | 19.97 |
| 41244.67083333333 | 19.98 |
| 41244.675 | 20.02 |
| 41244.67916666667 | 19.99 |
| 41244.6875 | 20.02 |
| 41244.691666666666 | 20.01 |
| 41244.69583333333 | 19.99 |
| 41244.7 | 20.01 |
| 41244.70416666667 | 19.99 |
| 41244.708333333336 | 19.98 |
| 41244.7125 | 19.95 |
| 41244.71666666667 | 20.03 |
| 41244.72083333333 | 20 |
| 41244.725 | 20.03 |
| 41244.729166666664 | 20.02 |
| 41244.73333333333 | 20.01 |
| 41244.7375 | 19.99 |
| 41244.74166666667 | 19.96 |
| 41244.745833333334 | 20.03 |
| 41244.75 | 20.04 |
| 41244.754166666666 | 20.03 |
| 41244.75833333333 | 20.01 |
| 41244.7625 | 19.95 |
| 41244.76666666667 | 20.02 |
| 41244.770833333336 | 19.96 |
| 41244.775 | 19.99 |
| 41244.77916666667 | 19.99 |
| 41244.78333333333 | 20.01 |
| 41244.7875 | 19.95 |
| 41244.791666666664 | 20.01 |
| 41244.79583333333 | 20.02 |
| 41244.8 | 19.91 |
| 41244.80416666667 | 19.93 |
| 41244.808333333334 | 20.02 |
| 41244.8125 | 19.94 |
| 41244.816666666666 | 19.91 |
| 41244.82083333333 | 19.91 |
| 41244.825 | 20.02 |
| 41244.82916666667 | 19.96 |
| 41244.833333333336 | 20.01 |
| 41244.8375 | 19.98 |
| 41244.84166666667 | 20.02 |
| 41244.84583333333 | 20.02 |
| 41244.85 | 19.94 |
| 41244.854166666664 | 19.95 |
| 41244.85833333333 | 20.01 |
| 41244.8625 | 19.99 |
| 41244.86666666667 | 19.98 |
| 41244.870833333334 | 19.93 |
| 41244.875 | 20.04 |
| 41244.879166666666 | 19.92 |
| 41244.88333333333 | 20.03 |
| 41244.8875 | 19.89 |
| 41244.89166666667 | 19.95 |
| 41244.895833333336 | 19.94 |
| 41244.9 | 20.01 |
| 41244.90416666667 | 20.02 |
| 41244.90833333333 | 20.06 |
| 41244.9125 | 19.96 |
| 41244.916666666664 | 20.01 |
| 41244.92083333333 | 19.98 |
| 41244.925 | 19.96 |
| 41244.92916666667 | 19.99 |
| 41244.933333333334 | 19.96 |
| 41244.9375 | 20.03 |
| 41244.941666666666 | 19.96 |
| 41244.94583333333 | 20.01 |
| 41244.95 | 19.91 |
| 41244.95416666667 | 19.94 |
| 41244.958333333336 | 19.99 |
| 41244.9625 | 19.94 |
| 41244.96666666667 | 20.07 |
| 41244.97083333333 | 19.95 |
| 41244.975 | 19.9 |
| 41244.979166666664 | 19.91 |
| 41244.98333333333 | 19.95 |
| 41244.9875 | 19.96 |
| 41244.99166666667 | 20.03 |
| 41244.995833333334 | 19.95 |
| 41245.0 | 20 |
| 41245.004166666666 | 19.98 |
| 41245.00833333333 | 19.93 |
| 41245.0125 | 19.96 |
| 41245.01666666667 | 20 |
| 41245.020833333336 | 20.02 |
| 41245.025 | 19.99 |
| 41245.02916666667 | 20.02 |
| 41245.03333333333 | 19.98 |
| 41245.0375 | 20.02 |
| 41245.041666666664 | 20.01 |
| 41245.04583333333 | 19.95 |
| 41245.05 | 20 |
| 41245.05416666667 | 19.93 |
| 41245.058333333334 | 20.05 |
| 41245.0625 | 19.95 |
| 41245.066666666666 | 20.02 |
| 41245.07083333333 | 19.91 |
| 41245.075 | 20.02 |
| 41245.07916666667 | 19.95 |
| 41245.083333333336 | 19.97 |
| 41245.0875 | 20.03 |
| 41245.09166666667 | 20.04 |
| 41245.09583333333 | 19.92 |
| 41245.1 | 20.02 |
| 41245.104166666664 | 19.98 |
| 41245.10833333333 | 19.98 |
| 41245.1125 | 19.94 |
| 41245.11666666667 | 20.01 |
| 41245.120833333334 | 20 |
| 41245.125 | 20 |
| 41245.129166666666 | 20.03 |
| 41245.13333333333 | 19.95 |
| 41245.1375 | 19.95 |
| 41245.14166666667 | 20 |
| 41245.145833333336 | 20.05 |
| 41245.15 | 20 |
| 41245.15416666667 | 20.01 |
| 41245.15833333333 | 20.01 |
| 41245.1625 | 19.96 |
| 41245.166666666664 | 19.98 |
| 41245.17083333333 | 20.04 |
| 41245.175 | 20.04 |
| 41245.17916666667 | 19.94 |
| 41245.1875 | 19.98 |
| 41245.191666666666 | 20.06 |
| 41245.19583333333 | 20.08 |
| 41245.2 | 20.07 |
| 41245.20416666667 | 20.02 |
| 41245.208333333336 | 20.06 |
| 41245.2125 | 20 |
| 41245.21666666667 | 19.97 |
| 41245.22083333333 | 20.04 |
| 41245.225 | 19.92 |
| 41245.229166666664 | 19.99 |
| 41245.23333333333 | 20.05 |
| 41245.2375 | 19.98 |
| 41245.24166666667 | 19.96 |
| 41245.245833333334 | 20.01 |
| 41245.25 | 20.01 |
| 41245.254166666666 | 19.95 |
| 41245.25833333333 | 19.98 |
| 41245.2625 | 20 |
| 41245.26666666667 | 20.07 |
| 41245.270833333336 | 19.99 |
| 41245.275 | 20.02 |
| 41245.27916666667 | 19.93 |
| 41245.28333333333 | 20 |
| 41245.2875 | 20.06 |
| 41245.291666666664 | 19.89 |
| 41245.29583333333 | 20.01 |
| 41245.3 | 19.95 |
| 41245.30416666667 | 19.91 |
| 41245.308333333334 | 19.98 |
| 41245.3125 | 19.93 |
| 41245.316666666666 | 19.92 |
| 41245.32083333333 | 19.99 |
| 41245.325 | 20.03 |
| 41245.32916666667 | 20.05 |
| 41245.333333333336 | 19.88 |
| 41245.3375 | 20.03 |
| 41245.34166666667 | 19.9 |
| 41245.34583333333 | 20.04 |
| 41245.35 | 19.99 |
| 41245.354166666664 | 19.97 |
| 41245.35833333333 | 20.05 |
| 41245.3625 | 19.99 |
| 41245.36666666667 | 20.03 |
| 41245.370833333334 | 19.93 |
| 41245.375 | 20.02 |
| 41245.379166666666 | 20.04 |
| 41245.38333333333 | 19.98 |
| 41245.3875 | 19.93 |
| 41245.39166666667 | 19.93 |
| 41245.395833333336 | 19.99 |
| 41245.4 | 19.96 |
| 41245.40416666667 | 19.99 |
| 41245.40833333333 | 20 |
| 41245.4125 | 19.9 |
| 41245.416666666664 | 19.98 |
| 41245.42083333333 | 19.94 |
| 41245.425 | 19.99 |
| 41245.42916666667 | 19.94 |
| 41245.433333333334 | 19.94 |
| 41245.4375 | 20.01 |
| 41245.441666666666 | 19.94 |
| 41245.44583333333 | 20.03 |
| 41245.45 | 19.9 |
| 41245.45416666667 | 19.93 |
| 41245.458333333336 | 19.97 |
| 41245.4625 | 19.97 |
| 41245.46666666667 | 19.96 |
| 41245.47083333333 | 19.96 |
| 41245.475 | 19.85 |
| 41245.479166666664 | 19.99 |
| 41245.48333333333 | 20.01 |
| 41245.4875 | 19.95 |
| 41245.49166666667 | 19.9 |
| 41245.495833333334 | 19.99 |
| 41245.5 | 20 |
| 41245.504166666666 | 19.93 |
| 41245.50833333333 | 19.87 |
| 41245.5125 | 19.94 |
| 41245.51666666667 | 20 |
| 41245.520833333336 | 19.92 |
| 41245.525 | 20.02 |
| 41245.52916666667 | 20.02 |
| 41245.53333333333 | 20.02 |
| 41245.5375 | 19.9 |
| 41245.541666666664 | 20.02 |
| 41245.54583333333 | 19.96 |
| 41245.55 | 19.98 |
| 41245.55416666667 | 20.01 |
| 41245.558333333334 | 19.98 |
| 41245.5625 | 19.98 |
| 41245.566666666666 | 19.88 |
| 41245.57083333333 | 19.87 |
| 41245.575 | 19.94 |
| 41245.57916666667 | 20.01 |
| 41245.583333333336 | 19.92 |
| 41245.5875 | 19.98 |
| 41245.59166666667 | 19.91 |
| 41245.59583333333 | 19.93 |
| 41245.6 | 19.96 |
| 41245.604166666664 | 19.95 |
| 41245.60833333333 | 19.97 |
| 41245.6125 | 19.98 |
| 41245.61666666667 | 20.01 |
| 41245.620833333334 | 19.93 |
| 41245.625 | 19.99 |
| 41245.629166666666 | 19.98 |
| 41245.63333333333 | 19.96 |
| 41245.6375 | 19.97 |
| 41245.64166666667 | 19.94 |
| 41245.645833333336 | 20.02 |
| 41245.65 | 19.89 |
| 41245.65416666667 | 20.03 |
| 41245.65833333333 | 19.92 |
| 41245.6625 | 19.93 |
| 41245.666666666664 | 19.9 |
| 41245.67083333333 | 19.92 |
| 41245.675 | 19.98 |
| 41245.67916666667 | 19.93 |
| 41245.683333333334 | 20.01 |
| 41245.6875 | 19.99 |
| 41245.691666666666 | 20.01 |
| 41245.69583333333 | 19.99 |
| 41245.7 | 20.01 |
| 41245.70416666667 | 19.98 |
| 41245.708333333336 | 19.97 |
| 41245.7125 | 19.95 |
| 41245.71666666667 | 20.02 |
| 41245.72083333333 | 19.91 |
| 41245.725 | 20.01 |
| 41245.729166666664 | 19.95 |
| 41245.73333333333 | 19.86 |
| 41245.7375 | 19.98 |
| 41245.74166666667 | 20.02 |
| 41245.745833333334 | 19.97 |
| 41245.75 | 20.02 |
| 41245.754166666666 | 19.93 |
| 41245.75833333333 | 19.98 |
| 41245.7625 | 19.99 |
| 41245.76666666667 | 20.03 |
| 41245.770833333336 | 20.02 |
| 41245.775 | 20 |
| 41245.77916666667 | 20.02 |
| 41245.78333333333 | 19.98 |
| 41245.7875 | 20.03 |
| 41245.791666666664 | 20 |
| 41245.79583333333 | 19.96 |
| 41245.8 | 19.93 |
| 41245.80416666667 | 20.01 |
| 41245.808333333334 | 19.95 |
| 41245.8125 | 19.99 |
| 41245.816666666666 | 19.99 |
| 41245.82083333333 | 19.98 |
| 41245.825 | 20.01 |
| 41245.82916666667 | 19.96 |
| 41245.833333333336 | 19.99 |
| 41245.8375 | 19.88 |
| 41245.84166666667 | 20 |
| 41245.84583333333 | 20 |
| 41245.85 | 19.95 |
| 41245.854166666664 | 20.02 |
| 41245.85833333333 | 19.89 |
| 41245.8625 | 19.98 |
| 41245.86666666667 | 20 |
| 41245.870833333334 | 19.97 |
| 41245.875 | 19.92 |
| 41245.879166666666 | 19.92 |
| 41245.88333333333 | 20 |
| 41245.8875 | 19.99 |
| 41245.89166666667 | 19.94 |
| 41245.895833333336 | 19.99 |
| 41245.9 | 20.01 |
| 41245.90416666667 | 19.95 |
| 41245.90833333333 | 19.92 |
| 41245.9125 | 19.96 |
| 41245.916666666664 | 19.94 |
| 41245.92083333333 | 20.02 |
| 41245.925 | 19.93 |
| 41245.92916666667 | 20 |
| 41245.933333333334 | 19.98 |
| 41245.9375 | 20 |
| 41245.941666666666 | 19.98 |
| 41245.94583333333 | 20.03 |
| 41245.95 | 20.01 |
| 41245.95416666667 | 20 |
| 41245.958333333336 | 19.97 |
| 41245.9625 | 20.02 |
| 41245.96666666667 | 19.91 |
| 41245.97083333333 | 19.97 |
| 41245.975 | 20.02 |
| 41245.979166666664 | 19.96 |
| 41245.98333333333 | 19.99 |
| 41245.9875 | 19.96 |
| 41245.99166666667 | 19.96 |
| 41245.995833333334 | 19.94 |
| 41246.0 | 19.99 |
| 41246.004166666666 | 19.96 |
| 41246.00833333333 | 19.97 |
| 41246.0125 | 19.96 |
| 41246.01666666667 | 19.96 |
| 41246.020833333336 | 20 |
| 41246.025 | 19.93 |
| 41246.02916666667 | 20 |
| 41246.03333333333 | 20 |
| 41246.0375 | 19.96 |
| 41246.041666666664 | 19.96 |
| 41246.04583333333 | 19.99 |
| 41246.05 | 19.95 |
| 41246.05416666667 | 20.01 |
| 41246.058333333334 | 19.97 |
| 41246.0625 | 19.97 |
| 41246.066666666666 | 19.97 |
| 41246.07083333333 | 19.98 |
| 41246.075 | 19.9 |
| 41246.07916666667 | 19.91 |
| 41246.083333333336 | 20.02 |
| 41246.0875 | 19.98 |
| 41246.09166666667 | 19.91 |
| 41246.09583333333 | 20 |
| 41246.1 | 19.96 |
| 41246.104166666664 | 19.96 |
| 41246.10833333333 | 20 |
| 41246.1125 | 19.9 |
| 41246.11666666667 | 19.98 |
| 41246.120833333334 | 19.93 |
| 41246.125 | 19.94 |
| 41246.129166666666 | 19.97 |
| 41246.13333333333 | 19.98 |
| 41246.1375 | 20 |
| 41246.14166666667 | 19.97 |
| 41246.145833333336 | 20 |
| 41246.15 | 19.96 |
| 41246.15416666667 | 19.95 |
| 41246.15833333333 | 19.96 |
| 41246.1625 | 20.01 |
| 41246.166666666664 | 19.98 |
| 41246.17083333333 | 19.97 |
| 41246.175 | 19.92 |
| 41246.17916666667 | 19.97 |
| 41246.183333333334 | 19.92 |
| 41246.1875 | 19.94 |
| 41246.191666666666 | 19.99 |
| 41246.19583333333 | 19.99 |
| 41246.2 | 20.01 |
| 41246.20416666667 | 19.99 |
| 41246.208333333336 | 19.99 |
| 41246.2125 | 20.01 |
| 41246.21666666667 | 20 |
| 41246.22083333333 | 19.99 |
| 41246.225 | 19.99 |
| 41246.229166666664 | 19.96 |
| 41246.23333333333 | 19.99 |
| 41246.2375 | 19.97 |
| 41246.24166666667 | 20.01 |
| 41246.245833333334 | 19.98 |
| 41246.25 | 19.98 |
| 41246.254166666666 | 19.97 |
| 41246.25833333333 | 19.97 |
| 41246.2625 | 19.99 |
| 41246.26666666667 | 19.98 |
| 41246.270833333336 | 19.9 |
| 41246.275 | 19.94 |
| 41246.27916666667 | 20 |
| 41246.28333333333 | 19.96 |
| 41246.2875 | 19.94 |
| 41246.291666666664 | 19.95 |
| 41246.29583333333 | 19.93 |
| 41246.3 | 19.96 |
| 41246.30416666667 | 19.93 |
| 41246.308333333334 | 19.97 |
| 41246.3125 | 19.92 |
| 41246.316666666666 | 19.92 |
| 41246.32083333333 | 19.98 |
| 41246.325 | 19.9 |
| 41246.32916666667 | 19.98 |
| 41246.333333333336 | 19.94 |
| 41246.3375 | 19.96 |
| 41246.34166666667 | 19.96 |
| 41246.34583333333 | 20 |
| 41246.35 | 19.99 |
| 41246.354166666664 | 19.94 |
| 41246.35833333333 | 19.92 |
| 41246.3625 | 19.94 |
| 41246.36666666667 | 20 |
| 41246.370833333334 | 19.97 |
| 41246.375 | 19.97 |
| 41246.379166666666 | 19.97 |
| 41246.38333333333 | 19.92 |
| 41246.3875 | 19.97 |
| 41246.39166666667 | 20.01 |
| 41246.395833333336 | 19.95 |
| 41246.4 | 19.99 |
| 41246.40416666667 | 20.03 |
| 41246.40833333333 | 19.9 |
| 41246.4125 | 19.98 |
| 41246.416666666664 | 19.98 |
| 41246.42083333333 | 19.96 |
| 41246.425 | 19.98 |
| 41246.42916666667 | 20.01 |
| 41246.433333333334 | 19.99 |
| 41246.4375 | 20.03 |
| 41246.441666666666 | 20.07 |
| 41246.44583333333 | 19.94 |
| 41246.45 | 20.01 |
| 41246.45416666667 | 19.97 |
| 41246.458333333336 | 20.04 |
| 41246.4625 | 20.04 |
| 41246.46666666667 | 20.03 |
| 41246.47083333333 | 20 |
| 41246.475 | 20 |
| 41246.479166666664 | 20.02 |
| 41246.48333333333 | 19.99 |
| 41246.4875 | 19.99 |
| 41246.49166666667 | 20.07 |
| 41246.495833333334 | 20 |
| 41246.5 | 20.05 |
| 41246.504166666666 | 20 |
| 41246.50833333333 | 20.01 |
| 41246.5125 | 20.01 |
| 41246.51666666667 | 20.05 |
| 41246.520833333336 | 20.08 |
| 41246.525 | 20.06 |
| 41246.52916666667 | 20.05 |
| 41246.53333333333 | 20.03 |
| 41246.5375 | 20.06 |
| 41246.541666666664 | 20 |
| 41246.54583333333 | 20.04 |
| 41246.55 | 20.04 |
| 41246.55416666667 | 20.03 |
| 41246.558333333334 | 20.03 |
| 41246.5625 | 20.06 |
| 41246.566666666666 | 20.02 |
| 41246.57083333333 | 20.04 |
| 41246.575 | 20.07 |
| 41246.57916666667 | 20.01 |
| 41246.583333333336 | 20 |
| 41246.5875 | 20.05 |
| 41246.59166666667 | 20 |
| 41246.59583333333 | 20.06 |
| 41246.6 | 20 |
| 41246.604166666664 | 20.03 |
| 41246.60833333333 | 20.06 |
| 41246.6125 | 20.06 |
| 41246.61666666667 | 20.09 |
| 41246.620833333334 | 20.09 |
| 41246.625 | 20.1 |
| 41246.629166666666 | 20.09 |
| 41246.63333333333 | 20.11 |
| 41246.6375 | 20.11 |
| 41246.64166666667 | 20.11 |
| 41246.645833333336 | 20.07 |
| 41246.65 | 20.1 |
| 41246.65416666667 | 20.12 |
| 41246.65833333333 | 20.13 |
| 41246.6625 | 20.12 |
| 41246.666666666664 | 20.09 |
| 41246.67083333333 | 20.14 |
| 41246.675 | 20.14 |
| 41246.67916666667 | 20.13 |
| 41246.683333333334 | 20.13 |
| 41246.6875 | 20.12 |
| 41246.691666666666 | 20.14 |
| 41246.69583333333 | 20.12 |
| 41246.7 | 20.1 |
| 41246.70416666667 | 20.1 |
| 41246.708333333336 | 20.13 |
| 41246.7125 | 20.11 |
| 41246.71666666667 | 20.11 |
| 41246.72083333333 | 20.12 |
| 41246.725 | 20.1 |
| 41246.729166666664 | 20.11 |
| 41246.73333333333 | 20.11 |
| 41246.7375 | 20.1 |
| 41246.74166666667 | 20.12 |
| 41246.745833333334 | 20.12 |
| 41246.75 | 20.1 |
| 41246.754166666666 | 20.11 |
| 41246.75833333333 | 20.1 |
| 41246.7625 | 20.12 |
| 41246.76666666667 | 20.11 |
| 41246.770833333336 | 20.13 |
| 41246.775 | 20.1 |
| 41246.77916666667 | 20.1 |
| 41246.78333333333 | 20.11 |
| 41246.7875 | 20.09 |
| 41246.791666666664 | 20.11 |
| 41246.79583333333 | 20.1 |
| 41246.8 | 20.03 |
| 41246.80416666667 | 20.08 |
| 41246.808333333334 | 20.09 |
| 41246.8125 | 20.06 |
| 41246.816666666666 | 20.08 |
| 41246.82083333333 | 20.09 |
| 41246.825 | 20.04 |
| 41246.82916666667 | 20.03 |
| 41246.833333333336 | 20.11 |
| 41246.8375 | 20.06 |
| 41246.84166666667 | 20.08 |
| 41246.84583333333 | 20.08 |
| 41246.85 | 20.08 |
| 41246.854166666664 | 20.05 |
| 41246.85833333333 | 19.99 |
| 41246.8625 | 20.07 |
| 41246.86666666667 | 20.06 |
| 41246.870833333334 | 20.07 |
| 41246.875 | 20.09 |
| 41246.879166666666 | 20.09 |
| 41246.88333333333 | 20.08 |
| 41246.8875 | 20.03 |
| 41246.89166666667 | 20.06 |
| 41246.895833333336 | 20.08 |
| 41246.9 | 20.07 |
| 41246.90416666667 | 20.01 |
| 41246.90833333333 | 20.09 |
| 41246.9125 | 20.08 |
| 41246.916666666664 | 20.07 |
| 41246.92083333333 | 20.03 |
| 41246.925 | 20.04 |
| 41246.92916666667 | 20.1 |
| 41246.933333333334 | 20.08 |
| 41246.9375 | 20.07 |
| 41246.941666666666 | 20.1 |
| 41246.94583333333 | 20.06 |
| 41246.95 | 20.09 |
| 41246.95416666667 | 20.09 |
| 41246.958333333336 | 20.07 |
| 41246.9625 | 20.1 |
| 41246.96666666667 | 20.08 |
| 41246.97083333333 | 20.1 |
| 41246.975 | 20.07 |
| 41246.979166666664 | 20 |
| 41246.98333333333 | 20.06 |
| 41246.9875 | 20.02 |
| 41246.99166666667 | 20.05 |
| 41246.995833333334 | 20.06 |
| 41247.0 | 20.07 |
| 41247.004166666666 | 20.07 |
| 41247.00833333333 | 20 |
| 41247.0125 | 20.1 |
| 41247.01666666667 | 20.08 |
| 41247.020833333336 | 20.07 |
| 41247.025 | 20.07 |
| 41247.02916666667 | 20.07 |
| 41247.03333333333 | 20.12 |
| 41247.0375 | 20.05 |
| 41247.041666666664 | 20.06 |
| 41247.04583333333 | 20.07 |
| 41247.05 | 20.05 |
| 41247.05416666667 | 20.08 |
| 41247.058333333334 | 20.1 |
| 41247.0625 | 20.08 |
| 41247.066666666666 | 20.08 |
| 41247.07083333333 | 20.07 |
| 41247.075 | 20.06 |
| 41247.07916666667 | 20.07 |
| 41247.083333333336 | 20.05 |
| 41247.0875 | 20.03 |
| 41247.09166666667 | 20.08 |
| 41247.09583333333 | 20.07 |
| 41247.1 | 20.08 |
| 41247.104166666664 | 20.06 |
| 41247.10833333333 | 20.05 |
| 41247.1125 | 20.07 |
| 41247.11666666667 | 20 |
| 41247.120833333334 | 20.1 |
| 41247.125 | 20.06 |
| 41247.129166666666 | 20.07 |
| 41247.13333333333 | 20.06 |
| 41247.1375 | 20.09 |
| 41247.14166666667 | 20.1 |
| 41247.145833333336 | 20.07 |
| 41247.15 | 20.08 |
| 41247.15416666667 | 20.05 |
| 41247.15833333333 | 20.03 |
| 41247.1625 | 20.06 |
| 41247.166666666664 | 20.08 |
| 41247.17083333333 | 20.05 |
| 41247.175 | 20.07 |
| 41247.17916666667 | 20.09 |
| 41247.183333333334 | 20.08 |
| 41247.1875 | 20.06 |
| 41247.191666666666 | 20.1 |
| 41247.19583333333 | 20.04 |
| 41247.2 | 20.09 |
| 41247.20416666667 | 20.07 |
| 41247.208333333336 | 20.04 |
| 41247.2125 | 20.08 |
| 41247.21666666667 | 20.04 |
| 41247.22083333333 | 20.06 |
| 41247.225 | 20.05 |
| 41247.229166666664 | 20.07 |
| 41247.23333333333 | 20.09 |
| 41247.2375 | 20.08 |
| 41247.24166666667 | 20.08 |
| 41247.245833333334 | 20.03 |
| 41247.25 | 20.04 |
| 41247.254166666666 | 20.07 |
| 41247.2625 | 20.07 |
| 41247.26666666667 | 20.07 |
| 41247.270833333336 | 20.09 |
| 41247.275 | 20.06 |
| 41247.27916666667 | 20.07 |
| 41247.28333333333 | 20.09 |
| 41247.2875 | 20.08 |
| 41247.291666666664 | 20.08 |
| 41247.29583333333 | 20.07 |
| 41247.3 | 20.08 |
| 41247.30416666667 | 20.06 |
| 41247.308333333334 | 20.07 |
| 41247.3125 | 20.05 |
| 41247.316666666666 | 20.07 |
| 41247.32083333333 | 20.07 |
| 41247.325 | 20.07 |
| 41247.32916666667 | 20.07 |
| 41247.333333333336 | 20.07 |
| 41247.3375 | 20.07 |
| 41247.34166666667 | 20.07 |
| 41247.34583333333 | 20.06 |
| 41247.35 | 20.08 |
| 41247.354166666664 | 20.06 |
| 41247.35833333333 | 20.08 |
| 41247.3625 | 20.09 |
| 41247.36666666667 | 20.06 |
| 41247.370833333334 | 20.05 |
| 41247.375 | 20.05 |
| 41247.379166666666 | 20.04 |
| 41247.38333333333 | 20.08 |
| 41247.3875 | 20.09 |
| 41247.39166666667 | 20.05 |
| 41247.395833333336 | 20.12 |
| 41247.4 | 20.14 |
| 41247.40416666667 | 20.13 |
| 41247.40833333333 | 20.11 |
| 41247.4125 | 20.12 |
| 41247.416666666664 | 20.1 |
| 41247.42083333333 | 20.11 |
| 41247.425 | 20.12 |
| 41247.42916666667 | 20.1 |
| 41247.433333333334 | 20.12 |
| 41247.4375 | 20.13 |
| 41247.441666666666 | 20.13 |
| 41247.44583333333 | 20.12 |
| 41247.45 | 20.13 |
| 41247.45416666667 | 20.11 |
| 41247.458333333336 | 20.11 |
| 41247.4625 | 20.12 |
| 41247.46666666667 | 20.13 |
| 41247.47083333333 | 20.1 |
| 41247.475 | 20.1 |
| 41247.479166666664 | 20.13 |
| 41247.48333333333 | 20.11 |
| 41247.4875 | 20.1 |
| 41247.49166666667 | 20.11 |
| 41247.495833333334 | 20.1 |
| 41247.5 | 20.1 |
| 41247.504166666666 | 20.11 |
| 41247.50833333333 | 20.09 |
| 41247.5125 | 20.09 |
| 41247.51666666667 | 20.1 |
| 41247.520833333336 | 20.07 |
| 41247.525 | 20.1 |
| 41247.52916666667 | 20.07 |
| 41247.53333333333 | 20.09 |
| 41247.5375 | 20.11 |
| 41247.541666666664 | 20.09 |
| 41247.54583333333 | 20.07 |
| 41247.55 | 20.09 |
| 41247.55416666667 | 20.1 |
| 41247.558333333334 | 20.04 |
| 41247.5625 | 20.06 |
| 41247.566666666666 | 20.05 |
| 41247.57083333333 | 20.03 |
| 41247.575 | 20.07 |
| 41247.57916666667 | 20.06 |
| 41247.583333333336 | 20.05 |
| 41247.5875 | 20.02 |
| 41247.59166666667 | 20.06 |
| 41247.59583333333 | 20.07 |
| 41247.6 | 20.04 |
| 41247.604166666664 | 20.03 |
| 41247.60833333333 | 20.05 |
| 41247.6125 | 20.06 |
| 41247.61666666667 | 20.06 |
| 41247.620833333334 | 20.07 |
| 41247.625 | 20.07 |
| 41247.629166666666 | 20.04 |
| 41247.63333333333 | 20.12 |
| 41247.6375 | 20.12 |
| 41247.64166666667 | 20.09 |
| 41247.645833333336 | 20.1 |
| 41247.65 | 20.12 |
| 41247.65416666667 | 20.16 |
| 41247.65833333333 | 20.13 |
| 41247.6625 | 20.16 |
| 41247.666666666664 | 20.02 |
| 41247.67083333333 | 20.01 |
| 41247.675 | 20.01 |
| 41247.67916666667 | 20.06 |
| 41247.683333333334 | 20.04 |
| 41247.6875 | 20.02 |
| 41247.691666666666 | 20.03 |
| 41247.69583333333 | 20.05 |
| 41247.7 | 20 |
| 41247.70416666667 | 20.03 |
| 41247.708333333336 | 20.02 |
| 41247.7125 | 19.99 |
| 41247.71666666667 | 20 |
| 41247.72083333333 | 20.07 |
| 41247.725 | 20.05 |
| 41247.729166666664 | 20.02 |
| 41247.73333333333 | 20.01 |
| 41247.7375 | 20.02 |
| 41247.74166666667 | 20 |
| 41247.745833333334 | 20.02 |
| 41247.75 | 20.02 |
| 41247.754166666666 | 20 |
| 41247.75833333333 | 20.01 |
| 41247.7625 | 20.04 |
| 41247.76666666667 | 20.01 |
| 41247.770833333336 | 20.01 |
| 41247.775 | 20.04 |
| 41247.77916666667 | 19.99 |
| 41247.78333333333 | 20.01 |
| 41247.7875 | 20 |
| 41247.791666666664 | 20 |
| 41247.79583333333 | 20.01 |
| 41247.8 | 19.99 |
| 41247.80416666667 | 20 |
| 41247.808333333334 | 20.01 |
| 41247.8125 | 19.98 |
| 41247.816666666666 | 19.98 |
| 41247.82083333333 | 20.02 |
| 41247.825 | 20.02 |
| 41247.82916666667 | 20.01 |
| 41247.833333333336 | 20.01 |
| 41247.8375 | 20.02 |
| 41247.84166666667 | 19.99 |
| 41247.84583333333 | 20.01 |
| 41247.85 | 20.03 |
| 41247.854166666664 | 20.04 |
| 41247.85833333333 | 20.02 |
| 41247.8625 | 19.99 |
| 41247.86666666667 | 20.01 |
| 41247.870833333334 | 19.98 |
| 41247.875 | 19.97 |
| 41247.879166666666 | 19.99 |
| 41247.88333333333 | 20.04 |
| 41247.8875 | 20.03 |
| 41247.89166666667 | 19.99 |
| 41247.895833333336 | 19.99 |
| 41247.9 | 20 |
| 41247.90416666667 | 20.02 |
| 41247.90833333333 | 20.01 |
| 41247.9125 | 20.01 |
| 41247.916666666664 | 19.98 |
| 41247.92083333333 | 20 |
| 41247.925 | 20.02 |
| 41247.92916666667 | 19.97 |
| 41247.933333333334 | 19.99 |
| 41247.9375 | 19.99 |
| 41247.941666666666 | 20.03 |
| 41247.94583333333 | 20.01 |
| 41247.95 | 20.02 |
| 41247.95416666667 | 20 |
| 41247.958333333336 | 19.98 |
| 41247.9625 | 20.01 |
| 41247.96666666667 | 19.98 |
| 41247.97083333333 | 19.98 |
| 41247.975 | 20.01 |
| 41247.979166666664 | 20.01 |
| 41247.98333333333 | 19.99 |
| 41247.9875 | 19.99 |
| 41247.99166666667 | 20.01 |
| 41247.995833333334 | 20.02 |
| 41248.0 | 20.01 |
| 41248.004166666666 | 20.02 |
| 41248.00833333333 | 20 |
| 41248.0125 | 19.98 |
| 41248.01666666667 | 20.02 |
| 41248.020833333336 | 20 |
| 41248.025 | 20 |
| 41248.02916666667 | 20.01 |
| 41248.03333333333 | 20.01 |
| 41248.0375 | 20.04 |
| 41248.041666666664 | 20.03 |
| 41248.04583333333 | 19.98 |
| 41248.05 | 20.01 |
| 41248.05416666667 | 20 |
| 41248.058333333334 | 19.99 |
| 41248.0625 | 19.99 |
| 41248.066666666666 | 20 |
| 41248.07083333333 | 19.97 |
| 41248.075 | 19.98 |
| 41248.07916666667 | 20 |
| 41248.083333333336 | 20 |
| 41248.0875 | 19.99 |
| 41248.09166666667 | 20 |
| 41248.09583333333 | 20 |
| 41248.1 | 20 |
| 41248.104166666664 | 19.98 |
| 41248.10833333333 | 20.02 |
| 41248.1125 | 20.03 |
| 41248.11666666667 | 20.02 |
| 41248.120833333334 | 20.03 |
| 41248.125 | 20.03 |
| 41248.129166666666 | 20.01 |
| 41248.13333333333 | 20 |
| 41248.1375 | 20.03 |
| 41248.14166666667 | 20.03 |
| 41248.145833333336 | 19.98 |
| 41248.15 | 20.02 |
| 41248.15416666667 | 20.02 |
| 41248.15833333333 | 20 |
| 41248.1625 | 20 |
| 41248.166666666664 | 20.03 |
| 41248.17083333333 | 20.02 |
| 41248.175 | 20.05 |
| 41248.17916666667 | 19.97 |
| 41248.183333333334 | 20.02 |
| 41248.1875 | 20.02 |
| 41248.191666666666 | 20 |
| 41248.19583333333 | 20.03 |
| 41248.2 | 20.06 |
| 41248.20416666667 | 20.02 |
| 41248.208333333336 | 19.99 |
| 41248.2125 | 20.05 |
| 41248.21666666667 | 20.03 |
| 41248.22083333333 | 20.01 |
| 41248.225 | 20.06 |
| 41248.229166666664 | 20.03 |
| 41248.23333333333 | 20 |
| 41248.2375 | 20.02 |
| 41248.24166666667 | 20 |
| 41248.245833333334 | 20 |
| 41248.25 | 20.01 |
| 41248.254166666666 | 20.01 |
| 41248.25833333333 | 20.02 |
| 41248.2625 | 20.04 |
| 41248.26666666667 | 20.01 |
| 41248.270833333336 | 20.05 |
| 41248.275 | 20.03 |
| 41248.27916666667 | 20 |
| 41248.28333333333 | 20.02 |
| 41248.2875 | 20.04 |
| 41248.291666666664 | 20.04 |
| 41248.29583333333 | 19.99 |
| 41248.3 | 19.99 |
| 41248.30416666667 | 20.01 |
| 41248.308333333334 | 20.06 |
| 41248.3125 | 20 |
| 41248.316666666666 | 19.99 |
| 41248.32083333333 | 20 |
| 41248.325 | 20.01 |
| 41248.32916666667 | 20 |
| 41248.333333333336 | 20 |
| 41248.3375 | 20.04 |
| 41248.34166666667 | 20 |
| 41248.34583333333 | 20.03 |
| 41248.35 | 20.05 |
| 41248.354166666664 | 20.01 |
| 41248.35833333333 | 20 |
| 41248.3625 | 20.01 |
| 41248.36666666667 | 20 |
| 41248.370833333334 | 20.04 |
| 41248.375 | 20.06 |
| 41248.379166666666 | 19.98 |
| 41248.38333333333 | 20.04 |
| 41248.3875 | 19.99 |
| 41248.39166666667 | 19.98 |
| 41248.395833333336 | 20.04 |
| 41248.4 | 20.01 |
| 41248.40416666667 | 19.98 |
| 41248.40833333333 | 20.01 |
| 41248.4125 | 20.02 |
| 41248.416666666664 | 19.99 |
| 41248.42083333333 | 20.04 |
| 41248.425 | 20.02 |
| 41248.42916666667 | 19.96 |
| 41248.433333333334 | 19.99 |
| 41248.4375 | 20.02 |
| 41248.441666666666 | 19.99 |
| 41248.44583333333 | 20.05 |
| 41248.45 | 20 |
| 41248.45416666667 | 19.99 |
| 41248.458333333336 | 20.08 |
| 41248.4625 | 20.05 |
| 41248.46666666667 | 20 |
| 41248.47083333333 | 20.03 |
| 41248.475 | 20 |
| 41248.479166666664 | 20.01 |
| 41248.48333333333 | 20.06 |
| 41248.4875 | 20.02 |
| 41248.49166666667 | 19.99 |
| 41248.495833333334 | 20.03 |
| 41248.5 | 20.02 |
| 41248.504166666666 | 20.03 |
| 41248.50833333333 | 20.04 |
| 41248.5125 | 20.01 |
| 41248.51666666667 | 20.05 |
| 41248.520833333336 | 19.99 |
| 41248.525 | 20.02 |
| 41248.52916666667 | 20.02 |
| 41248.53333333333 | 20.01 |
| 41248.5375 | 20.01 |
| 41248.541666666664 | 19.99 |
| 41248.54583333333 | 20.03 |
| 41248.55 | 19.98 |
| 41248.55416666667 | 20 |
| 41248.558333333334 | 20.04 |
| 41248.5625 | 20.02 |
| 41248.566666666666 | 19.97 |
| 41248.57083333333 | 19.99 |
| 41248.575 | 19.97 |
| 41248.57916666667 | 20 |
| 41248.583333333336 | 20.03 |
| 41248.5875 | 20.03 |
| 41248.59166666667 | 20.02 |
| 41248.59583333333 | 20.11 |
| 41248.6 | 20.1 |
| 41248.604166666664 | 20.05 |
| 41248.60833333333 | 20.1 |
| 41248.6125 | 20 |
| 41248.61666666667 | 20.01 |
| 41248.620833333334 | 20.01 |
| 41248.625 | 20.02 |
| 41248.629166666666 | 20.01 |
| 41248.63333333333 | 19.96 |
| 41248.6375 | 19.97 |
| 41248.64166666667 | 19.93 |
| 41248.645833333336 | 19.98 |
| 41248.65 | 19.97 |
| 41248.65416666667 | 19.97 |
| 41248.65833333333 | 20.01 |
| 41248.6625 | 20 |
| 41248.666666666664 | 20 |
| 41248.67083333333 | 19.99 |
| 41248.675 | 20 |
| 41248.67916666667 | 19.97 |
| 41248.683333333334 | 19.99 |
| 41248.6875 | 20.03 |
| 41248.691666666666 | 20 |
| 41248.69583333333 | 20 |
| 41248.7 | 19.97 |
| 41248.70416666667 | 20.02 |
| 41248.708333333336 | 20 |
| 41248.7125 | 20.01 |
| 41248.71666666667 | 20 |
| 41248.72083333333 | 19.98 |
| 41248.725 | 19.98 |
| 41248.729166666664 | 19.98 |
| 41248.73333333333 | 20 |
| 41248.7375 | 20.02 |
| 41248.74166666667 | 19.97 |
| 41248.745833333334 | 20 |
| 41248.75 | 19.99 |
| 41248.754166666666 | 19.98 |
| 41248.75833333333 | 19.97 |
| 41248.7625 | 19.98 |
| 41248.76666666667 | 19.98 |
| 41248.770833333336 | 20 |
| 41248.775 | 19.99 |
| 41248.77916666667 | 19.99 |
| 41248.78333333333 | 20.01 |
| 41248.7875 | 19.99 |
| 41248.791666666664 | 19.99 |
| 41248.79583333333 | 19.97 |
| 41248.8 | 19.97 |
| 41248.80416666667 | 20 |
| 41248.808333333334 | 19.98 |
| 41248.8125 | 19.98 |
| 41248.816666666666 | 20 |
| 41248.82083333333 | 20 |
| 41248.825 | 19.97 |
| 41248.82916666667 | 19.98 |
| 41248.833333333336 | 19.99 |
| 41248.8375 | 19.99 |
| 41248.84166666667 | 19.99 |
| 41248.84583333333 | 19.98 |
| 41248.85 | 19.99 |
| 41248.854166666664 | 19.99 |
| 41248.85833333333 | 19.99 |
| 41248.8625 | 20 |
| 41248.86666666667 | 19.96 |
| 41248.870833333334 | 19.99 |
| 41248.875 | 19.98 |
| 41248.879166666666 | 20 |
| 41248.88333333333 | 20.01 |
| 41248.8875 | 20.01 |
| 41248.89166666667 | 20 |
| 41248.895833333336 | 19.99 |
| 41248.9 | 20 |
| 41248.90416666667 | 19.97 |
| 41248.90833333333 | 19.97 |
| 41248.9125 | 20 |
| 41248.916666666664 | 19.96 |
| 41248.92083333333 | 19.96 |
| 41248.925 | 20 |
| 41248.92916666667 | 20.02 |
| 41248.933333333334 | 19.96 |
| 41248.9375 | 19.99 |
| 41248.941666666666 | 20 |
| 41248.94583333333 | 19.97 |
| 41248.95 | 19.97 |
| 41248.95416666667 | 19.97 |
| 41248.958333333336 | 19.98 |
| 41248.9625 | 19.98 |
| 41248.96666666667 | 19.96 |
| 41248.97083333333 | 19.95 |
| 41248.975 | 19.95 |
| 41248.979166666664 | 19.98 |
| 41248.98333333333 | 19.97 |
| 41248.9875 | 19.97 |
| 41248.99166666667 | 20.03 |
| 41248.995833333334 | 19.99 |
| 41249.0 | 19.98 |
| 41249.004166666666 | 19.98 |
| 41249.00833333333 | 20 |
| 41249.0125 | 19.98 |
| 41249.01666666667 | 20 |
| 41249.020833333336 | 19.98 |
| 41249.025 | 19.98 |
| 41249.02916666667 | 19.99 |
| 41249.03333333333 | 19.98 |
| 41249.0375 | 19.98 |
| 41249.041666666664 | 19.93 |
| 41249.04583333333 | 19.97 |
| 41249.05 | 20.02 |
| 41249.05416666667 | 19.99 |
| 41249.058333333334 | 19.98 |
| 41249.0625 | 19.94 |
| 41249.066666666666 | 19.98 |
| 41249.07083333333 | 20 |
| 41249.075 | 19.98 |
| 41249.07916666667 | 19.96 |
| 41249.083333333336 | 19.96 |
| 41249.0875 | 19.98 |
| 41249.09166666667 | 19.97 |
| 41249.09583333333 | 20.01 |
| 41249.1 | 19.99 |
| 41249.104166666664 | 19.96 |
| 41249.10833333333 | 19.97 |
| 41249.1125 | 19.95 |
| 41249.11666666667 | 19.93 |
| 41249.120833333334 | 19.98 |
| 41249.125 | 19.96 |
| 41249.129166666666 | 19.95 |
| 41249.13333333333 | 19.99 |
| 41249.1375 | 19.99 |
| 41249.14166666667 | 19.95 |
| 41249.145833333336 | 20.01 |
| 41249.15 | 19.98 |
| 41249.15416666667 | 19.98 |
| 41249.15833333333 | 20 |
| 41249.1625 | 19.96 |
| 41249.166666666664 | 19.99 |
| 41249.17083333333 | 20 |
| 41249.175 | 19.94 |
| 41249.17916666667 | 19.98 |
| 41249.183333333334 | 19.95 |
| 41249.1875 | 19.97 |
| 41249.191666666666 | 19.97 |
| 41249.19583333333 | 19.97 |
| 41249.2 | 19.97 |
| 41249.20416666667 | 19.93 |
| 41249.208333333336 | 19.97 |
| 41249.2125 | 19.96 |
| 41249.21666666667 | 19.95 |
| 41249.22083333333 | 20 |
| 41249.225 | 19.98 |
| 41249.229166666664 | 20 |
| 41249.23333333333 | 20 |
| 41249.2375 | 19.94 |
| 41249.24166666667 | 19.96 |
| 41249.245833333334 | 19.96 |
| 41249.25 | 19.98 |
| 41249.254166666666 | 19.96 |
| 41249.25833333333 | 20.02 |
| 41249.2625 | 19.98 |
| 41249.26666666667 | 19.95 |
| 41249.270833333336 | 19.98 |
| 41249.275 | 19.97 |
| 41249.27916666667 | 19.98 |
| 41249.28333333333 | 19.99 |
| 41249.2875 | 19.94 |
| 41249.291666666664 | 19.96 |
| 41249.29583333333 | 19.99 |
| 41249.3 | 19.97 |
| 41249.30416666667 | 19.95 |
| 41249.308333333334 | 19.95 |
| 41249.3125 | 19.94 |
| 41249.316666666666 | 20.02 |
| 41249.32083333333 | 19.95 |
| 41249.325 | 19.94 |
| 41249.32916666667 | 19.94 |
| 41249.333333333336 | 19.98 |
| 41249.3375 | 19.92 |
| 41249.34166666667 | 19.97 |
| 41249.34583333333 | 19.98 |
| 41249.35 | 19.97 |
| 41249.354166666664 | 19.95 |
| 41249.35833333333 | 19.98 |
| 41249.3625 | 20 |
| 41249.36666666667 | 19.95 |
| 41249.370833333334 | 19.97 |
| 41249.375 | 20 |
| 41249.379166666666 | 19.96 |
| 41249.38333333333 | 20.01 |
| 41249.3875 | 19.95 |
| 41249.39166666667 | 20.06 |
| 41249.395833333336 | 20 |
| 41249.4 | 20.03 |
| 41249.40416666667 | 19.96 |
| 41249.40833333333 | 19.99 |
| 41249.4125 | 19.97 |
| 41249.416666666664 | 19.97 |
| 41249.42083333333 | 19.95 |
| 41249.425 | 19.97 |
| 41249.42916666667 | 19.97 |
| 41249.433333333334 | 20.03 |
| 41249.4375 | 20.04 |
| 41249.441666666666 | 20.06 |
| 41249.44583333333 | 20.04 |
| 41249.45 | 19.95 |
| 41249.45082175926 | 19.93 |
| 41249.45416666667 | 19.94 |
| 41249.458333333336 | 19.95 |
| 41249.4625 | 20 |
| 41249.46666666667 | 19.95 |
| 41249.47083333333 | 19.98 |
| 41249.475 | 19.97 |
| 41249.479166666664 | 19.97 |
| 41249.48333333333 | 19.96 |
| 41249.4875 | 19.98 |
| 41249.49166666667 | 19.95 |
| 41249.495833333334 | 19.95 |
| 41249.5 | 19.99 |
| 41249.504166666666 | 19.94 |
| 41249.50833333333 | 19.94 |
| 41249.5125 | 19.98 |
| 41249.51666666667 | 19.98 |
| 41249.520833333336 | 19.95 |
| 41249.525 | 19.97 |
| 41249.52916666667 | 19.97 |
| 41249.53333333333 | 19.97 |
| 41249.5375 | 20.01 |
| 41249.541666666664 | 20 |
| 41249.54583333333 | 19.96 |
| 41249.55 | 20 |
| 41249.55416666667 | 19.97 |
| 41249.558333333334 | 19.95 |
| 41249.5625 | 19.98 |
| 41249.566666666666 | 19.97 |
| 41249.57083333333 | 19.96 |
| 41249.575 | 19.97 |
| 41249.57916666667 | 20 |
| 41249.583333333336 | 20.04 |
| 41249.5875 | 20.08 |
| 41249.59166666667 | 20 |
| 41249.59583333333 | 20 |
| 41249.6 | 19.98 |
| 41249.604166666664 | 19.94 |
| 41249.60833333333 | 19.97 |
| 41249.6125 | 19.96 |
| 41249.61666666667 | 19.94 |
| 41249.620833333334 | 19.96 |
| 41249.625 | 19.97 |
| 41249.629166666666 | 19.93 |
| 41249.63333333333 | 19.94 |
| 41249.6375 | 19.97 |
| 41249.64166666667 | 19.97 |
| 41249.645833333336 | 20.02 |
| 41249.65 | 19.98 |
| 41249.65416666667 | 19.99 |
| 41249.65833333333 | 20.01 |
| 41249.6625 | 20.02 |
| 41249.666666666664 | 20.03 |
| 41249.67083333333 | 20.01 |
| 41249.675 | 20.03 |
| 41249.67916666667 | 20.04 |
| 41249.683333333334 | 20.02 |
| 41249.6875 | 20.06 |
| 41249.691666666666 | 20.01 |
| 41249.69583333333 | 20.03 |
| 41249.7 | 20.02 |
| 41249.70416666667 | 20.04 |
| 41249.708333333336 | 20.02 |
| 41249.7125 | 20.07 |
| 41249.71666666667 | 20.02 |
| 41249.72083333333 | 20.04 |
| 41249.725 | 20.06 |
| 41249.729166666664 | 20.03 |
| 41249.73333333333 | 20.01 |
| 41249.7375 | 20.02 |
| 41249.74166666667 | 20.01 |
| 41249.745833333334 | 20.06 |
| 41249.75 | 20.01 |
| 41249.754166666666 | 20.04 |
| 41249.75833333333 | 20.05 |
| 41249.7625 | 20.05 |
| 41249.76666666667 | 20.02 |
| 41249.770833333336 | 20 |
| 41249.775 | 20.04 |
| 41249.77916666667 | 20.03 |
| 41249.78333333333 | 20.01 |
| 41249.7875 | 20.01 |
| 41249.791666666664 | 19.98 |
| 41249.79583333333 | 20.01 |
| 41249.8 | 20.04 |
| 41249.80416666667 | 20.03 |
| 41249.808333333334 | 20.03 |
| 41249.8125 | 20.01 |
| 41249.816666666666 | 20.02 |
| 41249.82083333333 | 20.03 |
| 41249.825 | 20.01 |
| 41249.82916666667 | 20.02 |
| 41249.833333333336 | 20.03 |
| 41249.8375 | 20.02 |
| 41249.84166666667 | 20.01 |
| 41249.84583333333 | 20.02 |
| 41249.85 | 20.02 |
| 41249.854166666664 | 20.03 |
| 41249.85833333333 | 20.02 |
| 41249.8625 | 20.02 |
| 41249.86666666667 | 19.98 |
| 41249.870833333334 | 20.02 |
| 41249.875 | 20.03 |
| 41249.879166666666 | 20.02 |
| 41249.88333333333 | 20.02 |
| 41249.8875 | 20.01 |
| 41249.89166666667 | 20.02 |
| 41249.895833333336 | 20 |
| 41249.9 | 20 |
| 41249.90416666667 | 20.01 |
| 41249.90833333333 | 20.01 |
| 41249.9125 | 20.03 |
| 41249.916666666664 | 19.99 |
| 41249.92083333333 | 20 |
| 41249.925 | 20 |
| 41249.92916666667 | 19.99 |
| 41249.933333333334 | 20 |
| 41249.9375 | 19.99 |
| 41249.941666666666 | 20.02 |
| 41249.94583333333 | 20.02 |
| 41249.95 | 20 |
| 41249.95416666667 | 19.99 |
| 41249.958333333336 | 20.02 |
| 41249.9625 | 20.01 |
| 41249.96666666667 | 20 |
| 41249.97083333333 | 20.02 |
| 41249.975 | 20.02 |
| 41249.979166666664 | 20.02 |
| 41249.98333333333 | 20.01 |
| 41249.9875 | 20.01 |
| 41249.99166666667 | 20.02 |
| 41249.995833333334 | 20.06 |
| 41250.0 | 20 |
| 41250.004166666666 | 19.99 |
| 41250.00833333333 | 20 |
| 41250.0125 | 20.01 |
| 41250.01666666667 | 20.02 |
| 41250.020833333336 | 20 |
| 41250.025 | 20.02 |
| 41250.02916666667 | 20 |
| 41250.03333333333 | 19.99 |
| 41250.0375 | 20 |
| 41250.041666666664 | 20 |
| 41250.04583333333 | 19.99 |
| 41250.05 | 20 |
| 41250.05416666667 | 20.02 |
| 41250.058333333334 | 20.03 |
| 41250.0625 | 20.04 |
| 41250.066666666666 | 19.96 |
| 41250.07083333333 | 19.99 |
| 41250.075 | 20.02 |
| 41250.07916666667 | 20.01 |
| 41250.083333333336 | 20.03 |
| 41250.0875 | 20.01 |
| 41250.09166666667 | 20.01 |
| 41250.09583333333 | 20 |
| 41250.1 | 19.98 |
| 41250.104166666664 | 20.01 |
| 41250.10833333333 | 20 |
| 41250.1125 | 19.98 |
| 41250.11666666667 | 20 |
| 41250.120833333334 | 19.99 |
| 41250.125 | 19.99 |
| 41250.129166666666 | 20.03 |
| 41250.13333333333 | 19.98 |
| 41250.1375 | 19.99 |
| 41250.14166666667 | 19.98 |
| 41250.145833333336 | 20.02 |
| 41250.15 | 20.03 |
| 41250.15416666667 | 20.06 |
| 41250.15833333333 | 19.98 |
| 41250.1625 | 20 |
| 41250.166666666664 | 19.99 |
| 41250.17083333333 | 20 |
| 41250.175 | 19.97 |
| 41250.17916666667 | 20.02 |
| 41250.183333333334 | 19.99 |
| 41250.1875 | 19.98 |
| 41250.191666666666 | 20 |
| 41250.19583333333 | 20.01 |
| 41250.2 | 20.02 |
| 41250.20416666667 | 19.99 |
| 41250.208333333336 | 19.98 |
| 41250.2125 | 19.96 |
| 41250.21666666667 | 19.97 |
| 41250.22083333333 | 19.96 |
| 41250.225 | 19.99 |
| 41250.229166666664 | 19.99 |
| 41250.23333333333 | 19.97 |
| 41250.2375 | 19.97 |
| 41250.24166666667 | 19.97 |
| 41250.245833333334 | 19.99 |
| 41250.25 | 20.02 |
| 41250.254166666666 | 20 |
| 41250.25833333333 | 19.98 |
| 41250.2625 | 19.96 |
| 41250.26666666667 | 19.98 |
| 41250.270833333336 | 20.02 |
| 41250.275 | 20 |
| 41250.27916666667 | 20 |
| 41250.28333333333 | 19.96 |
| 41250.2875 | 19.98 |
| 41250.291666666664 | 19.98 |
| 41250.29583333333 | 19.97 |
| 41250.3 | 19.97 |
| 41250.30416666667 | 20.01 |
| 41250.308333333334 | 19.98 |
| 41250.3125 | 19.99 |
| 41250.316666666666 | 19.97 |
| 41250.32083333333 | 19.98 |
| 41250.325 | 19.99 |
| 41250.32916666667 | 19.98 |
| 41250.333333333336 | 19.96 |
| 41250.3375 | 19.95 |
| 41250.34166666667 | 19.96 |
| 41250.34583333333 | 19.94 |
| 41250.35 | 19.98 |
| 41250.354166666664 | 20 |
| 41250.35833333333 | 20.02 |
| 41250.3625 | 19.96 |
| 41250.36666666667 | 19.98 |
| 41250.370833333334 | 20.01 |
| 41250.375 | 20.01 |
| 41250.379166666666 | 19.98 |
| 41250.38333333333 | 20.01 |
| 41250.3875 | 20 |
| 41250.39166666667 | 19.99 |
| 41250.395833333336 | 19.99 |
| 41250.4 | 19.99 |
| 41250.40416666667 | 19.98 |
| 41250.40833333333 | 19.97 |
| 41250.4125 | 20 |
| 41250.416666666664 | 19.99 |
| 41250.42083333333 | 19.99 |
| 41250.425 | 20.02 |
| 41250.42916666667 | 20 |
| 41250.433333333334 | 19.97 |
| 41250.4375 | 19.97 |
| 41250.441666666666 | 20 |
| 41250.44583333333 | 19.98 |
| 41250.45 | 19.99 |
| 41250.45416666667 | 19.99 |
| 41250.458333333336 | 19.98 |
| 41250.4625 | 19.95 |
| 41250.46666666667 | 19.95 |
| 41250.47083333333 | 19.99 |
| 41250.475 | 19.99 |
| 41250.479166666664 | 20.01 |
| 41250.48333333333 | 20.03 |
| 41250.4875 | 19.99 |
| 41250.49166666667 | 20.04 |
| 41250.495833333334 | 20.01 |
| 41250.5 | 20.01 |
| 41250.504166666666 | 20.06 |
| 41250.50833333333 | 20.02 |
| 41250.5125 | 19.98 |
| 41250.51666666667 | 20 |
| 41250.520833333336 | 19.99 |
| 41250.525 | 20.03 |
| 41250.52916666667 | 20.01 |
| 41250.53333333333 | 20.01 |
| 41250.5375 | 20.02 |
| 41250.541666666664 | 20.02 |
| 41250.54583333333 | 20.03 |
| 41250.55 | 20 |
| 41250.55416666667 | 20 |
| 41250.558333333334 | 19.97 |
| 41250.5625 | 19.98 |
| 41250.566666666666 | 19.98 |
| 41250.57083333333 | 20 |
| 41250.575 | 20.03 |
| 41250.57916666667 | 19.97 |
| 41250.583333333336 | 20 |
| 41250.5875 | 20 |
| 41250.59166666667 | 20.01 |
| 41250.59583333333 | 19.99 |
| 41250.6 | 20.02 |
| 41250.604166666664 | 20.03 |
| 41250.60833333333 | 20.01 |
| 41250.6125 | 20.01 |
| 41250.61666666667 | 20 |
| 41250.620833333334 | 20 |
| 41250.625 | 20.01 |
| 41250.629166666666 | 20.04 |
| 41250.63333333333 | 20 |
| 41250.6375 | 20.02 |
| 41250.64166666667 | 20.03 |
| 41250.645833333336 | 20.01 |
| 41250.65 | 19.98 |
| 41250.65416666667 | 20 |
| 41250.65833333333 | 20.05 |
| 41250.6625 | 20.06 |
| 41250.666666666664 | 20.04 |
| 41250.67083333333 | 20.03 |
| 41250.675 | 20.04 |
| 41250.67916666667 | 20.02 |
| 41250.683333333334 | 20.04 |
| 41250.6875 | 20.07 |
| 41250.691666666666 | 20.04 |
| 41250.69583333333 | 20.02 |
| 41250.7 | 20.05 |
| 41250.70416666667 | 20.03 |
| 41250.708333333336 | 20.06 |
| 41250.7125 | 20.03 |
| 41250.71666666667 | 20.04 |
| 41250.72083333333 | 20.06 |
| 41250.725 | 20.04 |
| 41250.729166666664 | 20.05 |
| 41250.73333333333 | 20.08 |
| 41250.7375 | 20.04 |
| 41250.74166666667 | 20.03 |
| 41250.745833333334 | 20.05 |
| 41250.75 | 20.04 |
| 41250.754166666666 | 20.05 |
| 41250.75833333333 | 20.02 |
| 41250.7625 | 20.03 |
| 41250.76666666667 | 20.05 |
| 41250.770833333336 | 20.06 |
| 41250.775 | 20.01 |
| 41250.77916666667 | 20.02 |
| 41250.78333333333 | 20.04 |
| 41250.7875 | 20.02 |
| 41250.791666666664 | 20.03 |
| 41250.79583333333 | 20.03 |
| 41250.8 | 20.07 |
| 41250.80416666667 | 20.03 |
| 41250.808333333334 | 20.01 |
| 41250.8125 | 20 |
| 41250.816666666666 | 20.02 |
| 41250.82083333333 | 20.06 |
| 41250.825 | 20.04 |
| 41250.82916666667 | 20.04 |
| 41250.833333333336 | 20.03 |
| 41250.8375 | 20.03 |
| 41250.84166666667 | 20.01 |
| 41250.84583333333 | 20.03 |
| 41250.85 | 20.03 |
| 41250.854166666664 | 20.01 |
| 41250.85833333333 | 19.97 |
| 41250.8625 | 20 |
| 41250.86666666667 | 19.98 |
| 41250.870833333334 | 20 |
| 41250.875 | 20 |
| 41250.879166666666 | 20 |
| 41250.88333333333 | 19.98 |
| 41250.8875 | 20.01 |
| 41250.89166666667 | 19.99 |
| 41250.895833333336 | 19.99 |
| 41250.9 | 19.99 |
| 41250.90416666667 | 20 |
| 41250.90833333333 | 20.01 |
| 41250.9125 | 19.99 |
| 41250.916666666664 | 20.02 |
| 41250.92083333333 | 19.97 |
| 41250.925 | 20 |
| 41250.92916666667 | 19.99 |
| 41250.933333333334 | 19.97 |
| 41250.9375 | 19.96 |
| 41250.941666666666 | 20.02 |
| 41250.94583333333 | 20.03 |
| 41250.95 | 19.99 |
| 41250.95416666667 | 20.01 |
| 41250.958333333336 | 19.97 |
| 41250.9625 | 20.03 |
| 41250.96666666667 | 20.01 |
| 41250.97083333333 | 20.01 |
| 41250.975 | 19.97 |
| 41250.979166666664 | 20.02 |
| 41250.98333333333 | 19.99 |
| 41250.9875 | 20.03 |
| 41250.99166666667 | 20.03 |
| 41250.995833333334 | 20 |
| 41251.0 | 20 |
| 41251.004166666666 | 19.99 |
| 41251.00833333333 | 19.99 |
| 41251.0125 | 19.99 |
| 41251.01666666667 | 20.02 |
| 41251.020833333336 | 19.99 |
| 41251.025 | 19.97 |
| 41251.02916666667 | 20.02 |
| 41251.03333333333 | 19.99 |
| 41251.0375 | 20.02 |
| 41251.041666666664 | 19.98 |
| 41251.04583333333 | 19.99 |
| 41251.05 | 20.02 |
| 41251.05416666667 | 20 |
| 41251.058333333334 | 20.01 |
| 41251.0625 | 20 |
| 41251.066666666666 | 20.02 |
| 41251.07083333333 | 20.01 |
| 41251.075 | 19.98 |
| 41251.07916666667 | 20.02 |
| 41251.083333333336 | 20.04 |
| 41251.0875 | 19.97 |
| 41251.09166666667 | 19.99 |
| 41251.09583333333 | 20 |
| 41251.1 | 20 |
| 41251.104166666664 | 20 |
| 41251.10833333333 | 19.99 |
| 41251.1125 | 20.02 |
| 41251.11666666667 | 20.03 |
| 41251.120833333334 | 20 |
| 41251.125 | 19.98 |
| 41251.129166666666 | 19.98 |
| 41251.13333333333 | 19.96 |
| 41251.1375 | 19.97 |
| 41251.14166666667 | 19.97 |
| 41251.145833333336 | 19.98 |
| 41251.15 | 19.99 |
| 41251.15416666667 | 20.01 |
| 41251.15833333333 | 19.99 |
| 41251.1625 | 19.96 |
| 41251.166666666664 | 20.01 |
| 41251.17083333333 | 19.94 |
| 41251.175 | 20.01 |
| 41251.17916666667 | 19.95 |
| 41251.183333333334 | 19.96 |
| 41251.1875 | 20.01 |
| 41251.191666666666 | 19.95 |
| 41251.19583333333 | 19.98 |
| 41251.2 | 19.99 |
| 41251.20416666667 | 19.97 |
| 41251.208333333336 | 20 |
| 41251.2125 | 19.94 |
| 41251.21666666667 | 19.95 |
| 41251.22083333333 | 19.95 |
| 41251.225 | 19.96 |
| 41251.229166666664 | 19.93 |
| 41251.23333333333 | 19.97 |
| 41251.2375 | 19.95 |
| 41251.24166666667 | 19.94 |
| 41251.245833333334 | 19.93 |
| 41251.25 | 19.97 |
| 41251.254166666666 | 19.97 |
| 41251.25833333333 | 19.98 |
| 41251.2625 | 19.97 |
| 41251.26666666667 | 19.96 |
| 41251.270833333336 | 19.99 |
| 41251.275 | 19.96 |
| 41251.27916666667 | 19.99 |
| 41251.28333333333 | 19.98 |
| 41251.2875 | 19.97 |
| 41251.291666666664 | 19.94 |
| 41251.29583333333 | 19.99 |
| 41251.3 | 19.97 |
| 41251.30416666667 | 19.97 |
| 41251.308333333334 | 19.97 |
| 41251.3125 | 19.97 |
| 41251.316666666666 | 19.96 |
| 41251.32083333333 | 19.99 |
| 41251.325 | 20.01 |
| 41251.32916666667 | 19.97 |
| 41251.333333333336 | 19.96 |
| 41251.3375 | 20.05 |
| 41251.34166666667 | 19.99 |
| 41251.34583333333 | 19.99 |
| 41251.35 | 19.98 |
| 41251.354166666664 | 19.96 |
| 41251.35833333333 | 19.99 |
| 41251.3625 | 19.98 |
| 41251.36666666667 | 19.96 |
| 41251.370833333334 | 19.97 |
| 41251.375 | 19.98 |
| 41251.379166666666 | 19.99 |
| 41251.38333333333 | 20 |
| 41251.3875 | 19.99 |
| 41251.39166666667 | 20.02 |
| 41251.395833333336 | 19.98 |
| 41251.4 | 20.02 |
| 41251.40416666667 | 19.97 |
| 41251.40833333333 | 19.96 |
| 41251.4125 | 19.95 |
| 41251.416666666664 | 19.99 |
| 41251.42083333333 | 20.01 |
| 41251.425 | 19.99 |
| 41251.42916666667 | 20 |
| 41251.433333333334 | 20 |
| 41251.4375 | 19.99 |
| 41251.441666666666 | 19.98 |
| 41251.44583333333 | 19.99 |
| 41251.45 | 19.98 |
| 41251.45416666667 | 19.95 |
| 41251.458333333336 | 19.99 |
| 41251.4625 | 19.96 |
| 41251.46666666667 | 19.98 |
| 41251.47083333333 | 20.01 |
| 41251.475 | 20.01 |
| 41251.479166666664 | 20 |
| 41251.48333333333 | 20.02 |
| 41251.4875 | 20.02 |
| 41251.49166666667 | 20 |
| 41251.495833333334 | 20.01 |
| 41251.5 | 19.99 |
| 41251.504166666666 | 19.98 |
| 41251.50833333333 | 19.98 |
| 41251.5125 | 20 |
| 41251.51666666667 | 19.96 |
| 41251.520833333336 | 19.96 |
| 41251.525 | 19.97 |
| 41251.52916666667 | 19.97 |
| 41251.53333333333 | 20 |
| 41251.5375 | 19.98 |
| 41251.541666666664 | 20.01 |
| 41251.54583333333 | 20.02 |
| 41251.55 | 19.98 |
| 41251.55416666667 | 20.03 |
| 41251.558333333334 | 20 |
| 41251.5625 | 19.98 |
| 41251.566666666666 | 19.96 |
| 41251.57083333333 | 20.01 |
| 41251.575 | 19.98 |
| 41251.57916666667 | 19.99 |
| 41251.583333333336 | 19.99 |
| 41251.5875 | 20.05 |
| 41251.59166666667 | 19.99 |
| 41251.59583333333 | 19.96 |
| 41251.6 | 20.01 |
| 41251.604166666664 | 20.01 |
| 41251.60833333333 | 20.01 |
| 41251.6125 | 19.99 |
| 41251.61666666667 | 20.01 |
| 41251.620833333334 | 19.95 |
| 41251.625 | 19.99 |
| 41251.629166666666 | 19.99 |
| 41251.63333333333 | 19.99 |
| 41251.6375 | 20.01 |
| 41251.64166666667 | 19.98 |
| 41251.645833333336 | 19.96 |
| 41251.65 | 20.01 |
| 41251.65416666667 | 20 |
| 41251.65833333333 | 20.03 |
| 41251.6625 | 20.01 |
| 41251.666666666664 | 19.99 |
| 41251.67083333333 | 20.02 |
| 41251.675 | 19.99 |
| 41251.67916666667 | 19.96 |
| 41251.683333333334 | 20.04 |
| 41251.6875 | 19.99 |
| 41251.691666666666 | 19.98 |
| 41251.69583333333 | 20 |
| 41251.7 | 19.98 |
| 41251.70416666667 | 19.99 |
| 41251.708333333336 | 20 |
| 41251.7125 | 19.99 |
| 41251.71666666667 | 20.02 |
| 41251.72083333333 | 20.04 |
| 41251.725 | 20.01 |
| 41251.729166666664 | 19.99 |
| 41251.73333333333 | 19.98 |
| 41251.7375 | 19.96 |
| 41251.74166666667 | 19.99 |
| 41251.745833333334 | 19.98 |
| 41251.75 | 20.02 |
| 41251.754166666666 | 19.99 |
| 41251.75833333333 | 19.99 |
| 41251.7625 | 20.05 |
| 41251.76666666667 | 20 |
| 41251.770833333336 | 19.99 |
| 41251.775 | 20.01 |
| 41251.77916666667 | 20.01 |
| 41251.78333333333 | 20.03 |
| 41251.7875 | 20.01 |
| 41251.791666666664 | 19.96 |
| 41251.79583333333 | 20.02 |
| 41251.8 | 19.97 |
| 41251.80416666667 | 20.01 |
| 41251.808333333334 | 20 |
| 41251.8125 | 20.01 |
| 41251.816666666666 | 20.01 |
| 41251.82083333333 | 20.02 |
| 41251.825 | 20 |
| 41251.82916666667 | 20.01 |
| 41251.833333333336 | 20.01 |
| 41251.8375 | 20.03 |
| 41251.84166666667 | 20.01 |
| 41251.84583333333 | 20.03 |
| 41251.85 | 19.99 |
| 41251.854166666664 | 20 |
| 41251.85833333333 | 20 |
| 41251.8625 | 20.04 |
| 41251.86666666667 | 19.99 |
| 41251.870833333334 | 20.03 |
| 41251.875 | 19.98 |
| 41251.879166666666 | 20 |
| 41251.88333333333 | 20 |
| 41251.8875 | 19.99 |
| 41251.89166666667 | 20.04 |
| 41251.895833333336 | 20.05 |
| 41251.9 | 19.99 |
| 41251.90416666667 | 19.98 |
| 41251.90833333333 | 19.99 |
| 41251.9125 | 20 |
| 41251.916666666664 | 20.02 |
| 41251.92083333333 | 19.96 |
| 41251.925 | 19.96 |
| 41251.92916666667 | 19.96 |
| 41251.933333333334 | 19.99 |
| 41251.9375 | 20.01 |
| 41251.941666666666 | 20.04 |
| 41251.94583333333 | 20.01 |
| 41251.95 | 19.99 |
| 41251.95416666667 | 19.98 |
| 41251.958333333336 | 19.95 |
| 41251.9625 | 19.97 |
| 41251.96666666667 | 19.98 |
| 41251.97083333333 | 19.96 |
| 41251.975 | 19.98 |
| 41251.979166666664 | 19.99 |
| 41251.98333333333 | 19.97 |
| 41251.9875 | 19.98 |
| 41251.99166666667 | 20.02 |
| 41251.995833333334 | 20.04 |
| 41252.0 | 19.97 |
| 41252.004166666666 | 19.97 |
| 41252.00833333333 | 19.98 |
| 41252.0125 | 19.97 |
| 41252.01666666667 | 19.98 |
| 41252.020833333336 | 19.96 |
| 41252.025 | 20.01 |
| 41252.02916666667 | 19.98 |
| 41252.03333333333 | 19.99 |
| 41252.0375 | 20.04 |
| 41252.041666666664 | 19.95 |
| 41252.04583333333 | 19.94 |
| 41252.05 | 19.97 |
| 41252.05416666667 | 19.94 |
| 41252.058333333334 | 19.98 |
| 41252.0625 | 19.96 |
| 41252.066666666666 | 20 |
| 41252.07083333333 | 20.01 |
| 41252.075 | 19.98 |
| 41252.07916666667 | 19.96 |
| 41252.083333333336 | 19.96 |
| 41252.0875 | 19.96 |
| 41252.09166666667 | 19.97 |
| 41252.09583333333 | 19.98 |
| 41252.1 | 19.96 |
| 41252.104166666664 | 19.99 |
| 41252.10833333333 | 19.97 |
| 41252.1125 | 19.97 |
| 41252.11666666667 | 20.01 |
| 41252.120833333334 | 19.98 |
| 41252.125 | 19.99 |
| 41252.129166666666 | 19.99 |
| 41252.13333333333 | 19.96 |
| 41252.1375 | 20.04 |
| 41252.14166666667 | 19.95 |
| 41252.145833333336 | 19.95 |
| 41252.15 | 19.96 |
| 41252.15416666667 | 19.95 |
| 41252.15833333333 | 19.95 |
| 41252.1625 | 20 |
| 41252.166666666664 | 19.93 |
| 41252.17083333333 | 19.99 |
| 41252.175 | 20 |
| 41252.17916666667 | 19.97 |
| 41252.183333333334 | 19.97 |
| 41252.1875 | 19.98 |
| 41252.191666666666 | 20.01 |
| 41252.19583333333 | 19.98 |
| 41252.2 | 20.06 |
| 41252.20416666667 | 19.98 |
| 41252.208333333336 | 19.96 |
| 41252.2125 | 19.98 |
| 41252.21666666667 | 19.95 |
| 41252.22083333333 | 19.98 |
| 41252.225 | 19.99 |
| 41252.229166666664 | 19.98 |
| 41252.23333333333 | 19.95 |
| 41252.2375 | 19.99 |
| 41252.24166666667 | 19.97 |
| 41252.245833333334 | 20.02 |
| 41252.25 | 19.97 |
| 41252.254166666666 | 19.97 |
| 41252.25833333333 | 19.99 |
| 41252.2625 | 20.01 |
| 41252.26666666667 | 19.98 |
| 41252.270833333336 | 20 |
| 41252.275 | 19.96 |
| 41252.27916666667 | 20.02 |
| 41252.28333333333 | 20.02 |
| 41252.2875 | 19.96 |
| 41252.291666666664 | 19.99 |
| 41252.29583333333 | 20.03 |
| 41252.3 | 20.02 |
| 41252.30416666667 | 19.97 |
| 41252.308333333334 | 20.01 |
| 41252.3125 | 19.98 |
| 41252.316666666666 | 19.98 |
| 41252.32083333333 | 19.95 |
| 41252.325 | 20 |
| 41252.32916666667 | 19.95 |
| 41252.333333333336 | 19.98 |
| 41252.3375 | 19.99 |
| 41252.34166666667 | 19.98 |
| 41252.34583333333 | 19.98 |
| 41252.35 | 19.96 |
| 41252.354166666664 | 19.97 |
| 41252.35833333333 | 20.01 |
| 41252.3625 | 20.02 |
| 41252.36666666667 | 20 |
| 41252.370833333334 | 19.96 |
| 41252.375 | 19.98 |
| 41252.379166666666 | 19.97 |
| 41252.38333333333 | 19.98 |
| 41252.3875 | 19.99 |
| 41252.39166666667 | 19.97 |
| 41252.395833333336 | 19.98 |
| 41252.4 | 19.97 |
| 41252.40416666667 | 20 |
| 41252.40833333333 | 19.97 |
| 41252.4125 | 19.97 |
| 41252.416666666664 | 19.99 |
| 41252.42083333333 | 20.01 |
| 41252.425 | 19.98 |
| 41252.42916666667 | 20 |
| 41252.433333333334 | 20 |
| 41252.4375 | 20 |
| 41252.441666666666 | 19.97 |
| 41252.44583333333 | 20 |
| 41252.45 | 19.97 |
| 41252.45416666667 | 20.01 |
| 41252.458333333336 | 19.99 |
| 41252.4625 | 19.97 |
| 41252.46666666667 | 19.98 |
| 41252.47083333333 | 19.98 |
| 41252.475 | 20.01 |
| 41252.479166666664 | 20.02 |
| 41252.48333333333 | 19.97 |
| 41252.4875 | 20 |
| 41252.49166666667 | 19.98 |
| 41252.495833333334 | 20 |
| 41252.5 | 20.01 |
| 41252.504166666666 | 20.03 |
| 41252.50833333333 | 20.01 |
| 41252.5125 | 20 |
| 41252.51666666667 | 20.02 |
| 41252.520833333336 | 19.98 |
| 41252.525 | 19.99 |
| 41252.52916666667 | 20.03 |
| 41252.53333333333 | 20.01 |
| 41252.5375 | 20.02 |
| 41252.541666666664 | 19.96 |
| 41252.54583333333 | 20 |
| 41252.55 | 20.01 |
| 41252.55416666667 | 20.01 |
| 41252.558333333334 | 20 |
| 41252.5625 | 20.03 |
| 41252.566666666666 | 20.02 |
| 41252.57083333333 | 20.04 |
| 41252.575 | 20.03 |
| 41252.57916666667 | 20.02 |
| 41252.583333333336 | 20.03 |
| 41252.5875 | 20.04 |
| 41252.59166666667 | 20.02 |
| 41252.59583333333 | 20.07 |
| 41252.6 | 20.04 |
| 41252.604166666664 | 20 |
| 41252.60833333333 | 20.02 |
| 41252.6125 | 20.02 |
| 41252.61666666667 | 20.05 |
| 41252.620833333334 | 20.02 |
| 41252.625 | 20.03 |
| 41252.629166666666 | 20.03 |
| 41252.63333333333 | 20.05 |
| 41252.6375 | 20.03 |
| 41252.64166666667 | 20.03 |
| 41252.645833333336 | 20.02 |
| 41252.65 | 20.04 |
| 41252.65416666667 | 20.04 |
| 41252.65833333333 | 20.01 |
| 41252.6625 | 20.04 |
| 41252.666666666664 | 20 |
| 41252.67083333333 | 20.02 |
| 41252.675 | 20.03 |
| 41252.67916666667 | 20.01 |
| 41252.683333333334 | 19.98 |
| 41252.6875 | 20.01 |
| 41252.691666666666 | 20 |
| 41252.69583333333 | 20 |
| 41252.7 | 20.03 |
| 41252.70416666667 | 20.01 |
| 41252.708333333336 | 19.98 |
| 41252.7125 | 20.04 |
| 41252.71666666667 | 20.04 |
| 41252.72083333333 | 19.99 |
| 41252.725 | 20.02 |
| 41252.729166666664 | 19.99 |
| 41252.73333333333 | 20.04 |
| 41252.7375 | 20.01 |
| 41252.74166666667 | 20.04 |
| 41252.745833333334 | 20.02 |
| 41252.75 | 20.02 |
| 41252.754166666666 | 20.03 |
| 41252.75833333333 | 20.04 |
| 41252.7625 | 20.01 |
| 41252.76666666667 | 20.05 |
| 41252.770833333336 | 20.03 |
| 41252.775 | 19.99 |
| 41252.77916666667 | 20.05 |
| 41252.78333333333 | 20.03 |
| 41252.7875 | 20.06 |
| 41252.791666666664 | 20.02 |
| 41252.79583333333 | 19.98 |
| 41252.8 | 20.03 |
| 41252.80416666667 | 20.05 |
| 41252.808333333334 | 20.01 |
| 41252.8125 | 20.01 |
| 41252.816666666666 | 20 |
| 41252.82083333333 | 20.02 |
| 41252.825 | 19.99 |
| 41252.82916666667 | 19.99 |
| 41252.833333333336 | 20.04 |
| 41252.8375 | 20.01 |
| 41252.84166666667 | 20.04 |
| 41252.84583333333 | 20.02 |
| 41252.85 | 20 |
| 41252.854166666664 | 20.03 |
| 41252.85833333333 | 20.02 |
| 41252.8625 | 20.01 |
| 41252.86666666667 | 19.99 |
| 41252.870833333334 | 19.99 |
| 41252.875 | 20.02 |
| 41252.879166666666 | 20 |
| 41252.88333333333 | 20 |
| 41252.8875 | 20.03 |
| 41252.89166666667 | 19.99 |
| 41252.895833333336 | 20.02 |
| 41252.9 | 20 |
| 41252.90416666667 | 20.01 |
| 41252.90833333333 | 20.01 |
| 41252.9125 | 19.99 |
| 41252.916666666664 | 20.04 |
| 41252.92083333333 | 20 |
| 41252.925 | 20.01 |
| 41252.92916666667 | 20.01 |
| 41252.933333333334 | 20.01 |
| 41252.9375 | 20.02 |
| 41252.941666666666 | 20 |
| 41252.94583333333 | 19.99 |
| 41252.95 | 20.01 |
| 41252.95416666667 | 19.99 |
| 41252.958333333336 | 20.02 |
| 41252.9625 | 19.99 |
| 41252.96666666667 | 20.01 |
| 41252.97083333333 | 19.98 |
| 41252.975 | 20.02 |
| 41252.979166666664 | 20 |
| 41252.98333333333 | 20 |
| 41252.9875 | 19.98 |
| 41252.99166666667 | 19.99 |
| 41252.995833333334 | 20.02 |
| 41253.0 | 20.01 |
| 41253.004166666666 | 20.02 |
| 41253.00833333333 | 19.96 |
| 41253.0125 | 20.02 |
| 41253.01666666667 | 19.99 |
| 41253.020833333336 | 19.95 |
| 41253.025 | 19.95 |
| 41253.02916666667 | 20 |
| 41253.03333333333 | 19.98 |
| 41253.0375 | 19.99 |
| 41253.041666666664 | 20 |
| 41253.04583333333 | 19.98 |
| 41253.05 | 19.98 |
| 41253.05416666667 | 20 |
| 41253.058333333334 | 19.98 |
| 41253.0625 | 20.03 |
| 41253.066666666666 | 20 |
| 41253.07083333333 | 20.01 |
| 41253.075 | 20.01 |
| 41253.07916666667 | 19.98 |
| 41253.083333333336 | 20.02 |
| 41253.0875 | 20.02 |
| 41253.09166666667 | 20.01 |
| 41253.09583333333 | 20.01 |
| 41253.1 | 20 |
| 41253.104166666664 | 20.01 |
| 41253.10833333333 | 20 |
| 41253.1125 | 20.01 |
| 41253.11666666667 | 20 |
| 41253.120833333334 | 20.01 |
| 41253.125 | 20.03 |
| 41253.129166666666 | 20.05 |
| 41253.13333333333 | 20.02 |
| 41253.1375 | 20 |
| 41253.14166666667 | 20.01 |
| 41253.145833333336 | 19.98 |
| 41253.15 | 20 |
| 41253.15416666667 | 19.96 |
| 41253.15833333333 | 19.98 |
| 41253.1625 | 19.97 |
| 41253.166666666664 | 20 |
| 41253.17083333333 | 20.01 |
| 41253.175 | 19.97 |
| 41253.17916666667 | 19.98 |
| 41253.183333333334 | 19.96 |
| 41253.1875 | 19.99 |
| 41253.191666666666 | 19.96 |
| 41253.19583333333 | 19.96 |
| 41253.2 | 19.96 |
| 41253.20416666667 | 19.97 |
| 41253.208333333336 | 19.95 |
| 41253.2125 | 19.97 |
| 41253.21666666667 | 19.98 |
| 41253.22083333333 | 19.97 |
| 41253.225 | 19.98 |
| 41253.229166666664 | 20.01 |
| 41253.23333333333 | 20.02 |
| 41253.2375 | 19.96 |
| 41253.24166666667 | 20 |
| 41253.245833333334 | 19.96 |
| 41253.25 | 19.99 |
| 41253.254166666666 | 19.98 |
| 41253.25833333333 | 19.97 |
| 41253.2625 | 19.96 |
| 41253.26666666667 | 19.97 |
| 41253.270833333336 | 19.97 |
| 41253.275 | 20.04 |
| 41253.27916666667 | 19.99 |
| 41253.28333333333 | 19.97 |
| 41253.2875 | 19.98 |
| 41253.291666666664 | 19.98 |
| 41253.29583333333 | 19.97 |
| 41253.3 | 19.99 |
| 41253.30416666667 | 19.98 |
| 41253.308333333334 | 19.99 |
| 41253.3125 | 19.98 |
| 41253.316666666666 | 20.01 |
| 41253.32083333333 | 19.97 |
| 41253.325 | 19.97 |
| 41253.32916666667 | 19.99 |
| 41253.333333333336 | 19.98 |
| 41253.3375 | 19.97 |
| 41253.34166666667 | 19.98 |
| 41253.34583333333 | 20 |
| 41253.35 | 19.99 |
| 41253.354166666664 | 19.98 |
| 41253.35833333333 | 19.98 |
| 41253.3625 | 19.95 |
| 41253.36666666667 | 19.98 |
| 41253.370833333334 | 20.01 |
| 41253.375 | 19.98 |
| 41253.379166666666 | 20.06 |
| 41253.38333333333 | 20.05 |
| 41253.3875 | 19.97 |
| 41253.39166666667 | 19.99 |
| 41253.395833333336 | 20.01 |
| 41253.4 | 19.97 |
| 41253.40416666667 | 20.04 |
| 41253.40833333333 | 20.01 |
| 41253.4125 | 19.99 |
| 41253.416666666664 | 19.96 |
| 41253.42083333333 | 20.01 |
| 41253.425 | 19.95 |
| 41253.42916666667 | 20 |
| 41253.433333333334 | 19.99 |
| 41253.4375 | 19.97 |
| 41253.441666666666 | 19.99 |
| 41253.44583333333 | 20.03 |
| 41253.45 | 19.98 |
| 41253.45416666667 | 20.01 |
| 41253.458333333336 | 20 |
| 41253.4625 | 19.96 |
| 41253.46666666667 | 20.02 |
| 41253.47083333333 | 19.98 |
| 41253.475 | 19.97 |
| 41253.479166666664 | 19.98 |
| 41253.48333333333 | 20.01 |
| 41253.4875 | 19.99 |
| 41253.49166666667 | 20.03 |
| 41253.495833333334 | 20 |
| 41253.5 | 19.99 |
| 41253.504166666666 | 20.02 |
| 41253.50833333333 | 20 |
| 41253.5125 | 20.01 |
| 41253.51666666667 | 20.03 |
| 41253.520833333336 | 20.03 |
| 41253.525 | 20.03 |
| 41253.52916666667 | 20.03 |
| 41253.53333333333 | 20.03 |
| 41253.5375 | 20.01 |
| 41253.541666666664 | 19.99 |
| 41253.54583333333 | 20.06 |
| 41253.55 | 20.02 |
| 41253.55416666667 | 20.02 |
| 41253.558333333334 | 20.01 |
| 41253.5625 | 20.01 |
| 41253.566666666666 | 19.96 |
| 41253.57083333333 | 20.02 |
| 41253.575 | 19.99 |
| 41253.57916666667 | 20 |
| 41253.583333333336 | 19.99 |
| 41253.5875 | 20.04 |
| 41253.59166666667 | 20.01 |
| 41253.59583333333 | 20 |
| 41253.6 | 19.97 |
| 41253.604166666664 | 20.03 |
| 41253.6078125 | 20.02 |
| 41253.60833333333 | 20 |
| 41253.6125 | 19.98 |
| 41253.61666666667 | 20 |
| 41253.620833333334 | 20.03 |
| 41253.625 | 19.94 |
| 41253.629166666666 | 19.98 |
| 41253.63333333333 | 20.01 |
| 41253.6375 | 20.03 |
| 41253.64166666667 | 20.04 |
| 41253.645833333336 | 20.04 |
| 41253.65 | 20.01 |
| 41253.65416666667 | 19.91 |
| 41253.65833333333 | 19.95 |
| 41253.6625 | 20 |
| 41253.666666666664 | 19.96 |
| 41253.67083333333 | 19.91 |
| 41253.675 | 19.91 |
| 41253.67916666667 | 19.95 |
| 41253.683333333334 | 19.95 |
| 41253.6875 | 19.95 |
| 41253.691666666666 | 19.92 |
| 41253.69583333333 | 19.92 |
| 41253.7 | 19.98 |
| 41253.70416666667 | 19.99 |
| 41253.708333333336 | 19.97 |
| 41253.7125 | 20 |
| 41253.71666666667 | 20.02 |
| 41253.72083333333 | 20 |
| 41253.725 | 20.04 |
| 41253.729166666664 | 20.03 |
| 41253.73333333333 | 20.01 |
| 41253.7375 | 20.03 |
| 41253.74166666667 | 20.03 |
| 41253.745833333334 | 20.03 |
| 41253.75 | 20.03 |
| 41253.754166666666 | 19.99 |
| 41253.75833333333 | 20.05 |
| 41253.7625 | 20.02 |
| 41253.76666666667 | 20 |
| 41253.770833333336 | 20.03 |
| 41253.775 | 20.05 |
| 41253.77916666667 | 20.04 |
| 41253.78333333333 | 20.04 |
| 41253.7875 | 20.05 |
| 41253.791666666664 | 20.04 |
| 41253.79583333333 | 20.02 |
| 41253.8 | 20.02 |
| 41253.80416666667 | 20.05 |
| 41253.808333333334 | 19.99 |
| 41253.8125 | 20.02 |
| 41253.816666666666 | 20.03 |
| 41253.82083333333 | 20.04 |
| 41253.825 | 20.02 |
| 41253.82916666667 | 20.04 |
| 41253.833333333336 | 20.02 |
| 41253.8375 | 20.03 |
| 41253.84166666667 | 20.01 |
| 41253.84583333333 | 20.02 |
| 41253.85 | 20.05 |
| 41253.854166666664 | 20.02 |
| 41253.85833333333 | 20.02 |
| 41253.8625 | 20.02 |
| 41253.86666666667 | 20.03 |
| 41253.870833333334 | 20.02 |
| 41253.875 | 20.06 |
| 41253.879166666666 | 20 |
| 41253.88333333333 | 20.02 |
| 41253.8875 | 20.01 |
| 41253.89166666667 | 19.98 |
| 41253.895833333336 | 20 |
| 41253.9 | 20.04 |
| 41253.90416666667 | 20.01 |
| 41253.90833333333 | 20.02 |
| 41253.9125 | 20 |
| 41253.916666666664 | 20.03 |
| 41253.92083333333 | 20.01 |
| 41253.925 | 20.02 |
| 41253.92916666667 | 20 |
| 41253.933333333334 | 20.01 |
| 41253.9375 | 20 |
| 41253.941666666666 | 20.01 |
| 41253.94583333333 | 19.98 |
| 41253.95 | 19.98 |
| 41253.95416666667 | 19.99 |
| 41253.958333333336 | 19.99 |
| 41253.9625 | 19.99 |
| 41253.96666666667 | 20.01 |
| 41253.97083333333 | 20.01 |
| 41253.975 | 20.02 |
| 41253.979166666664 | 20.01 |
| 41253.98333333333 | 20.01 |
| 41253.9875 | 20.03 |
| 41253.99166666667 | 19.98 |
| 41253.995833333334 | 20.02 |
| 41254.0 | 20.01 |
| 41254.004166666666 | 19.99 |
| 41254.00833333333 | 20.01 |
| 41254.0125 | 19.99 |
| 41254.01666666667 | 19.96 |
| 41254.020833333336 | 20 |
| 41254.025 | 19.99 |
| 41254.02916666667 | 20 |
| 41254.03333333333 | 20 |
| 41254.0375 | 19.98 |
| 41254.041666666664 | 20.04 |
| 41254.04583333333 | 20.04 |
| 41254.05 | 20 |
| 41254.05416666667 | 19.98 |
| 41254.058333333334 | 20.01 |
| 41254.0625 | 20.02 |
| 41254.066666666666 | 19.98 |
| 41254.07083333333 | 20 |
| 41254.075 | 20.02 |
| 41254.07916666667 | 20.01 |
| 41254.083333333336 | 19.99 |
| 41254.0875 | 20.01 |
| 41254.09166666667 | 20.04 |
| 41254.09583333333 | 20 |
| 41254.1 | 19.97 |
| 41254.104166666664 | 20 |
| 41254.10833333333 | 19.98 |
| 41254.1125 | 19.97 |
| 41254.11666666667 | 19.99 |
| 41254.120833333334 | 20.02 |
| 41254.125 | 20.01 |
| 41254.129166666666 | 19.98 |
| 41254.13333333333 | 20 |
| 41254.1375 | 19.99 |
| 41254.14166666667 | 20 |
| 41254.145833333336 | 20 |
| 41254.15 | 19.99 |
| 41254.15416666667 | 20.01 |
| 41254.15833333333 | 20.04 |
| 41254.1625 | 19.98 |
| 41254.166666666664 | 20.01 |
| 41254.17083333333 | 20 |
| 41254.175 | 19.98 |
| 41254.17916666667 | 20 |
| 41254.183333333334 | 20 |
| 41254.1875 | 19.95 |
| 41254.191666666666 | 20 |
| 41254.19583333333 | 20.01 |
| 41254.2 | 20.03 |
| 41254.20416666667 | 20.01 |
| 41254.208333333336 | 19.99 |
| 41254.2125 | 20.02 |
| 41254.21666666667 | 19.99 |
| 41254.22083333333 | 19.97 |
| 41254.225 | 19.99 |
| 41254.229166666664 | 20 |
| 41254.23333333333 | 20.01 |
| 41254.2375 | 19.98 |
| 41254.24166666667 | 19.98 |
| 41254.245833333334 | 19.97 |
| 41254.25 | 19.99 |
| 41254.254166666666 | 19.98 |
| 41254.25833333333 | 19.99 |
| 41254.2625 | 20 |
| 41254.26666666667 | 19.98 |
| 41254.270833333336 | 20 |
| 41254.275 | 20.03 |
| 41254.27916666667 | 20 |
| 41254.28333333333 | 20.03 |
| 41254.2875 | 19.98 |
| 41254.291666666664 | 19.96 |
| 41254.29583333333 | 19.94 |
| 41254.3 | 20.01 |
| 41254.30416666667 | 20.04 |
| 41254.308333333334 | 20.03 |
| 41254.3125 | 19.98 |
| 41254.316666666666 | 20 |
| 41254.32083333333 | 19.98 |
| 41254.325 | 19.96 |
| 41254.32916666667 | 19.97 |
| 41254.333333333336 | 19.96 |
| 41254.3375 | 19.98 |
| 41254.34166666667 | 19.99 |
| 41254.34583333333 | 20 |
| 41254.35 | 19.97 |
| 41254.354166666664 | 19.95 |
| 41254.35833333333 | 19.99 |
| 41254.3625 | 20.01 |
| 41254.36666666667 | 19.96 |
| 41254.370833333334 | 19.99 |
| 41254.375 | 19.99 |
| 41254.379166666666 | 19.98 |
| 41254.38333333333 | 19.99 |
| 41254.3875 | 20.01 |
| 41254.39166666667 | 19.98 |
| 41254.395833333336 | 20.04 |
| 41254.4 | 19.98 |
| 41254.40416666667 | 19.97 |
| 41254.40833333333 | 19.96 |
| 41254.4125 | 19.98 |
| 41254.416666666664 | 19.99 |
| 41254.42083333333 | 20 |
| 41254.425 | 19.99 |
| 41254.42916666667 | 20.01 |
| 41254.433333333334 | 19.97 |
| 41254.4375 | 20 |
| 41254.441666666666 | 20 |
| 41254.44583333333 | 20 |
| 41254.45 | 19.98 |
| 41254.45416666667 | 20 |
| 41254.458333333336 | 19.98 |
| 41254.4625 | 20.02 |
| 41254.46666666667 | 20.03 |
| 41254.47083333333 | 20.02 |
| 41254.475 | 20.04 |
| 41254.479166666664 | 20.03 |
| 41254.48333333333 | 20.02 |
| 41254.4875 | 20.01 |
| 41254.49166666667 | 20.01 |
| 41254.495833333334 | 20.02 |
| 41254.5 | 20.05 |
| 41254.504166666666 | 20.04 |
| 41254.50833333333 | 20.02 |
| 41254.5125 | 20.01 |
| 41254.51666666667 | 20.03 |
| 41254.520833333336 | 20.02 |
| 41254.525 | 20.03 |
| 41254.52916666667 | 20.01 |
| 41254.53333333333 | 20.02 |
| 41254.5375 | 20.04 |
| 41254.541666666664 | 20.04 |
| 41254.54583333333 | 20.05 |
| 41254.55 | 20.04 |
| 41254.55416666667 | 20.05 |
| 41254.558333333334 | 20.05 |
| 41254.5625 | 20.03 |
| 41254.566666666666 | 20.04 |
| 41254.57083333333 | 20.03 |
| 41254.575 | 19.99 |
| 41254.57916666667 | 20 |
| 41254.583333333336 | 20.02 |
| 41254.5875 | 20 |
| 41254.59166666667 | 20.06 |
| 41254.59583333333 | 20.04 |
| 41254.6 | 20.01 |
| 41254.604166666664 | 20.01 |
| 41254.60833333333 | 20 |
| 41254.6125 | 20.03 |
| 41254.61666666667 | 20.03 |
| 41254.620833333334 | 20.05 |
| 41254.625 | 20.06 |
| 41254.629166666666 | 20.03 |
| 41254.63333333333 | 20.04 |
| 41254.6375 | 20.02 |
| 41254.64166666667 | 20.04 |
| 41254.645833333336 | 20.03 |
| 41254.65 | 20.01 |
| 41254.65416666667 | 19.98 |
| 41254.65833333333 | 20.04 |
| 41254.6625 | 20.02 |
| 41254.666666666664 | 20.01 |
| 41254.67083333333 | 20.01 |
| 41254.675 | 20 |
| 41254.67916666667 | 19.99 |
| 41254.683333333334 | 20.01 |
| 41254.6875 | 20.02 |
| 41254.691666666666 | 19.99 |
| 41254.69583333333 | 20.02 |
| 41254.7 | 19.97 |
| 41254.70416666667 | 20.03 |
| 41254.708333333336 | 20.02 |
| 41254.7125 | 20.02 |
| 41254.71666666667 | 20.02 |
| 41254.72083333333 | 20.02 |
| 41254.725 | 20.05 |
| 41254.729166666664 | 20.05 |
| 41254.73333333333 | 20.03 |
| 41254.7375 | 20.02 |
| 41254.74166666667 | 20.03 |
| 41254.745833333334 | 20.03 |
| 41254.75 | 20.04 |
| 41254.754166666666 | 20.02 |
| 41254.75833333333 | 20.02 |
| 41254.7625 | 20.04 |
| 41254.76666666667 | 20.02 |
| 41254.770833333336 | 20 |
| 41254.775 | 20.02 |
| 41254.77916666667 | 20.01 |
| 41254.78333333333 | 20 |
| 41254.7875 | 20.01 |
| 41254.791666666664 | 20 |
| 41254.79583333333 | 20.01 |
| 41254.8 | 20.03 |
| 41254.80416666667 | 20.04 |
| 41254.808333333334 | 19.99 |
| 41254.8125 | 20.05 |
| 41254.816666666666 | 20.03 |
| 41254.82083333333 | 20.03 |
| 41254.825 | 20.02 |
| 41254.82916666667 | 20.04 |
| 41254.833333333336 | 20.01 |
| 41254.8375 | 20.02 |
| 41254.84166666667 | 19.97 |
| 41254.84583333333 | 20.01 |
| 41254.85 | 20.03 |
| 41254.854166666664 | 20.01 |
| 41254.85833333333 | 20.02 |
| 41254.8625 | 20.02 |
| 41254.86666666667 | 20.01 |
| 41254.870833333334 | 20.01 |
| 41254.875 | 20 |
| 41254.879166666666 | 20.06 |
| 41254.88333333333 | 20.03 |
| 41254.8875 | 19.99 |
| 41254.89166666667 | 20.02 |
| 41254.895833333336 | 20.03 |
| 41254.9 | 20.02 |
| 41254.90416666667 | 20.01 |
| 41254.90833333333 | 20.01 |
| 41254.9125 | 20.02 |
| 41254.916666666664 | 20.03 |
| 41254.92083333333 | 20.02 |
| 41254.925 | 20.02 |
| 41254.92916666667 | 20.03 |
| 41254.933333333334 | 20.02 |
| 41254.9375 | 20.01 |
| 41254.941666666666 | 20 |
| 41254.94583333333 | 20 |
| 41254.95 | 20 |
| 41254.95416666667 | 20.01 |
| 41254.958333333336 | 20 |
| 41254.9625 | 19.98 |
| 41254.96666666667 | 20 |
| 41254.97083333333 | 20.05 |
| 41254.975 | 20.01 |
| 41254.979166666664 | 20 |
| 41254.98333333333 | 20.01 |
| 41254.9875 | 20.03 |
| 41254.99166666667 | 19.99 |
| 41254.995833333334 | 20.01 |
| 41255.0 | 20.01 |
| 41255.004166666666 | 19.99 |
| 41255.00833333333 | 20.01 |
| 41255.0125 | 19.98 |
| 41255.01666666667 | 19.99 |
| 41255.020833333336 | 20.01 |
| 41255.025 | 19.99 |
| 41255.02916666667 | 19.99 |
| 41255.03333333333 | 19.99 |
| 41255.0375 | 20.01 |
| 41255.041666666664 | 20 |
| 41255.04583333333 | 20.01 |
| 41255.05 | 19.99 |
| 41255.05416666667 | 20 |
| 41255.058333333334 | 19.99 |
| 41255.0625 | 19.97 |
| 41255.066666666666 | 20.01 |
| 41255.07083333333 | 20.03 |
| 41255.075 | 20.02 |
| 41255.07916666667 | 19.99 |
| 41255.083333333336 | 20 |
| 41255.0875 | 19.97 |
| 41255.09166666667 | 20.01 |
| 41255.09583333333 | 20.02 |
| 41255.1 | 20.02 |
| 41255.104166666664 | 19.99 |
| 41255.10833333333 | 19.97 |
| 41255.1125 | 20.01 |
| 41255.11666666667 | 20.01 |
| 41255.120833333334 | 20.02 |
| 41255.125 | 20 |
| 41255.129166666666 | 20.01 |
| 41255.13333333333 | 20.02 |
| 41255.1375 | 20.01 |
| 41255.14166666667 | 20.01 |
| 41255.145833333336 | 20 |
| 41255.15 | 20.03 |
| 41255.15416666667 | 19.99 |
| 41255.15833333333 | 20.03 |
| 41255.1625 | 19.98 |
| 41255.166666666664 | 19.99 |
| 41255.17083333333 | 19.97 |
| 41255.175 | 20.02 |
| 41255.17916666667 | 19.99 |
| 41255.183333333334 | 20 |
| 41255.1875 | 20.01 |
| 41255.191666666666 | 20 |
| 41255.19583333333 | 20.01 |
| 41255.2 | 20 |
| 41255.20416666667 | 20.01 |
| 41255.208333333336 | 20.01 |
| 41255.2125 | 20 |
| 41255.21666666667 | 20.03 |
| 41255.22083333333 | 20.06 |
| 41255.225 | 20 |
| 41255.229166666664 | 20 |
| 41255.23333333333 | 20.01 |
| 41255.2375 | 19.99 |
| 41255.24166666667 | 19.99 |
| 41255.245833333334 | 19.98 |
| 41255.25 | 19.99 |
| 41255.254166666666 | 19.98 |
| 41255.25833333333 | 19.99 |
| 41255.2625 | 19.97 |
| 41255.26666666667 | 19.99 |
| 41255.270833333336 | 19.96 |
| 41255.275 | 20.02 |
| 41255.27916666667 | 19.97 |
| 41255.28333333333 | 20.01 |
| 41255.2875 | 20.01 |
| 41255.291666666664 | 19.98 |
| 41255.29583333333 | 20.02 |
| 41255.3 | 19.98 |
| 41255.30416666667 | 20 |
| 41255.308333333334 | 19.99 |
| 41255.3125 | 20 |
| 41255.316666666666 | 19.98 |
| 41255.32083333333 | 19.99 |
| 41255.325 | 19.98 |
| 41255.32916666667 | 20 |
| 41255.333333333336 | 19.98 |
| 41255.3375 | 19.95 |
| 41255.34166666667 | 19.95 |
| 41255.34583333333 | 19.98 |
| 41255.35 | 19.97 |
| 41255.354166666664 | 20.01 |
| 41255.35833333333 | 19.98 |
| 41255.3625 | 20.01 |
| 41255.36666666667 | 19.97 |
| 41255.370833333334 | 20.03 |
| 41255.375 | 20 |
| 41255.379166666666 | 19.98 |
| 41255.38333333333 | 20.01 |
| 41255.3875 | 20.01 |
| 41255.39166666667 | 19.99 |
| 41255.395833333336 | 19.98 |
| 41255.4 | 20.02 |
| 41255.40416666667 | 20.01 |
| 41255.40833333333 | 19.99 |
| 41255.4125 | 19.95 |
| 41255.416666666664 | 19.99 |
| 41255.42083333333 | 19.98 |
| 41255.425 | 20 |
| 41255.42916666667 | 19.99 |
| 41255.433333333334 | 19.99 |
| 41255.4375 | 19.98 |
| 41255.441666666666 | 20 |
| 41255.44583333333 | 20 |
| 41255.45 | 19.99 |
| 41255.45416666667 | 20.02 |
| 41255.458333333336 | 20.01 |
| 41255.4625 | 19.99 |
| 41255.46666666667 | 20.03 |
| 41255.509201388886 | 19.98 |
| 41255.5125 | 20.01 |
| 41255.51666666667 | 20.03 |
| 41255.520833333336 | 20.03 |
| 41255.525 | 20.02 |
| 41255.52916666667 | 20.02 |
| 41255.53333333333 | 20.04 |
| 41255.5375 | 20 |
| 41255.541666666664 | 20 |
| 41255.54583333333 | 20 |
| 41255.54893518519 | 20.02 |
| 41255.55 | 20.01 |
| 41255.55416666667 | 20.02 |
| 41255.558333333334 | 20 |
| 41255.5625 | 20.03 |
| 41255.566666666666 | 20.01 |
| 41255.57083333333 | 20.04 |
| 41255.575 | 20.04 |
| 41255.57916666667 | 20 |
| 41255.583333333336 | 20.04 |
| 41255.5875 | 20 |
| 41255.59166666667 | 20.05 |
| 41255.59583333333 | 20.02 |
| 41255.6 | 20.01 |
| 41255.604166666664 | 20.03 |
| 41255.60833333333 | 20.02 |
| 41255.6125 | 20.02 |
| 41255.61666666667 | 20.01 |
| 41255.620833333334 | 20.03 |
| 41255.625 | 20.01 |
| 41255.629166666666 | 20.04 |
| 41255.63333333333 | 20.01 |
| 41255.6375 | 20.01 |
| 41255.64166666667 | 20 |
| 41255.645833333336 | 19.99 |
| 41255.65 | 19.93 |
| 41255.65416666667 | 20.02 |
| 41255.65833333333 | 20.03 |
| 41255.6625 | 20 |
| 41255.666666666664 | 20.03 |
| 41255.67083333333 | 20.02 |
| 41255.675 | 20.03 |
| 41255.67916666667 | 20.03 |
| 41255.683333333334 | 20.03 |
| 41255.6875 | 20.02 |
| 41255.691666666666 | 20.01 |
| 41255.69583333333 | 20.04 |
| 41255.7 | 20.05 |
| 41255.70416666667 | 20.04 |
| 41255.708333333336 | 20.03 |
| 41255.7125 | 20.01 |
| 41255.71666666667 | 20.05 |
| 41255.72083333333 | 20.02 |
| 41255.725 | 20.02 |
| 41255.729166666664 | 20.05 |
| 41255.73333333333 | 20.03 |
| 41255.7375 | 20.01 |
| 41255.74166666667 | 20 |
| 41255.745833333334 | 20.01 |
| 41255.75 | 20.02 |
| 41255.754166666666 | 20.03 |
| 41255.75833333333 | 20.01 |
| 41255.7625 | 20.02 |
| 41255.76666666667 | 20.02 |
| 41255.770833333336 | 20.04 |
| 41255.775 | 20.02 |
| 41255.77916666667 | 20.03 |
| 41255.78333333333 | 19.99 |
| 41255.7875 | 20.02 |
| 41255.791666666664 | 20.04 |
| 41255.79583333333 | 20.03 |
| 41255.8 | 20.02 |
| 41255.80416666667 | 20.05 |
| 41255.808333333334 | 19.99 |
| 41255.8125 | 20.02 |
| 41255.816666666666 | 20.02 |
| 41255.825 | 19.99 |
| 41255.82916666667 | 19.98 |
| 41255.833333333336 | 20.01 |
| 41255.8375 | 20 |
| 41255.84166666667 | 20.01 |
| 41255.84583333333 | 20.03 |
| 41255.85 | 20.01 |
| 41255.854166666664 | 19.98 |
| 41255.85833333333 | 20 |
| 41255.8625 | 19.97 |
| 41255.86666666667 | 20.01 |
| 41255.870833333334 | 20.04 |
| 41255.875 | 20.01 |
| 41255.879166666666 | 19.99 |
| 41255.88333333333 | 20 |
| 41255.8875 | 20 |
| 41255.89166666667 | 20.02 |
| 41255.895833333336 | 20.02 |
| 41255.9 | 19.99 |
| 41255.90416666667 | 20 |
| 41255.90833333333 | 20.02 |
| 41255.9125 | 20.02 |
| 41255.916666666664 | 20 |
| 41255.92083333333 | 19.99 |
| 41255.925 | 19.99 |
| 41255.92916666667 | 19.97 |
| 41255.933333333334 | 19.98 |
| 41255.9375 | 19.97 |
| 41255.941666666666 | 19.98 |
| 41255.94583333333 | 19.97 |
| 41255.95 | 19.97 |
| 41255.95416666667 | 19.98 |
| 41255.958333333336 | 20 |
| 41255.9625 | 19.98 |
| 41255.96666666667 | 19.99 |
| 41255.97083333333 | 19.97 |
| 41255.975 | 19.95 |
| 41255.979166666664 | 19.97 |
| 41255.98333333333 | 19.97 |
| 41255.9875 | 19.98 |
| 41255.99166666667 | 19.99 |
| 41255.995833333334 | 20.02 |
| 41256.0 | 19.94 |
| 41256.004166666666 | 19.97 |
| 41256.00833333333 | 19.93 |
| 41256.0125 | 19.96 |
| 41256.01666666667 | 19.95 |
| 41256.020833333336 | 19.96 |
| 41256.025 | 19.99 |
| 41256.02916666667 | 19.94 |
| 41256.03333333333 | 20.01 |
| 41256.0375 | 19.96 |
| 41256.041666666664 | 19.99 |
| 41256.04583333333 | 20.01 |
| 41256.05 | 19.98 |
| 41256.05416666667 | 19.99 |
| 41256.058333333334 | 19.95 |
| 41256.0625 | 19.94 |
| 41256.066666666666 | 19.98 |
| 41256.07083333333 | 19.95 |
| 41256.075 | 19.95 |
| 41256.07916666667 | 19.98 |
| 41256.083333333336 | 19.97 |
| 41256.0875 | 19.94 |
| 41256.09166666667 | 19.98 |
| 41256.09583333333 | 19.97 |
| 41256.1 | 19.95 |
| 41256.104166666664 | 19.92 |
| 41256.10833333333 | 19.96 |
| 41256.1125 | 19.96 |
| 41256.11666666667 | 19.98 |
| 41256.120833333334 | 19.96 |
| 41256.125 | 19.95 |
| 41256.129166666666 | 19.99 |
| 41256.13333333333 | 19.95 |
| 41256.1375 | 19.96 |
| 41256.14166666667 | 19.98 |
| 41256.145833333336 | 19.91 |
| 41256.15 | 19.97 |
| 41256.15416666667 | 19.99 |
| 41256.15833333333 | 19.96 |
| 41256.1625 | 19.95 |
| 41256.166666666664 | 19.92 |
| 41256.17083333333 | 19.96 |
| 41256.175 | 19.94 |
| 41256.17916666667 | 20 |
| 41256.183333333334 | 19.94 |
| 41256.1875 | 19.95 |
| 41256.191666666666 | 19.94 |
| 41256.19583333333 | 19.98 |
| 41256.2 | 19.97 |
| 41256.20416666667 | 19.95 |
| 41256.208333333336 | 19.97 |
| 41256.2125 | 19.99 |
| 41256.21666666667 | 19.91 |
| 41256.22083333333 | 19.96 |
| 41256.225 | 19.94 |
| 41256.229166666664 | 19.96 |
| 41256.23333333333 | 19.95 |
| 41256.2375 | 19.96 |
| 41256.24166666667 | 19.93 |
| 41256.245833333334 | 19.95 |
| 41256.25 | 19.95 |
| 41256.254166666666 | 19.95 |
| 41256.25833333333 | 19.92 |
| 41256.2625 | 19.97 |
| 41256.26666666667 | 19.99 |
| 41256.270833333336 | 19.94 |
| 41256.275 | 19.98 |
| 41256.27916666667 | 19.93 |
| 41256.28333333333 | 19.96 |
| 41256.2875 | 19.94 |
| 41256.291666666664 | 19.98 |
| 41256.29583333333 | 20.01 |
| 41256.3 | 19.98 |
| 41256.30416666667 | 20.01 |
| 41256.308333333334 | 19.97 |
| 41256.3125 | 19.98 |
| 41256.316666666666 | 19.94 |
| 41256.32083333333 | 19.99 |
| 41256.325 | 19.94 |
| 41256.32916666667 | 19.98 |
| 41256.333333333336 | 19.98 |
| 41256.3375 | 19.96 |
| 41256.34166666667 | 19.96 |
| 41256.34583333333 | 19.92 |
| 41256.35 | 19.96 |
| 41256.354166666664 | 19.95 |
| 41256.35833333333 | 19.95 |
| 41256.3625 | 19.93 |
| 41256.36666666667 | 19.91 |
| 41256.370833333334 | 19.96 |
| 41256.375 | 19.97 |
| 41256.379166666666 | 19.99 |
| 41256.38333333333 | 19.94 |
| 41256.3875 | 19.93 |
| 41256.39166666667 | 20.02 |
| 41256.395833333336 | 20.01 |
| 41256.4 | 19.96 |
| 41256.40416666667 | 19.97 |
| 41256.40833333333 | 19.99 |
| 41256.4125 | 19.97 |
| 41256.416666666664 | 19.98 |
| 41256.42083333333 | 19.97 |
| 41256.425 | 19.96 |
| 41256.42916666667 | 19.97 |
| 41256.433333333334 | 19.96 |
| 41256.4375 | 19.99 |
| 41256.441666666666 | 20.01 |
| 41256.44583333333 | 19.98 |
| 41256.45 | 20.02 |
| 41256.45416666667 | 20.01 |
| 41256.458333333336 | 20.02 |
| 41256.4625 | 20 |
| 41256.46666666667 | 19.97 |
| 41256.47083333333 | 20 |
| 41256.475 | 19.97 |
| 41256.479166666664 | 19.97 |
| 41256.48333333333 | 19.99 |
| 41256.4875 | 19.98 |
| 41256.49166666667 | 20.01 |
| 41256.495833333334 | 19.98 |
| 41256.5 | 19.98 |
| 41256.504166666666 | 19.96 |
| 41256.50833333333 | 19.97 |
| 41256.5125 | 20 |
| 41256.51666666667 | 20.01 |
| 41256.520833333336 | 19.97 |
| 41256.525 | 19.98 |
| 41256.52916666667 | 20.01 |
| 41256.53333333333 | 20.02 |
| 41256.5375 | 20.03 |
| 41256.541666666664 | 19.99 |
| 41256.54583333333 | 19.97 |
| 41256.55 | 19.95 |
| 41256.55416666667 | 19.99 |
| 41256.558333333334 | 20 |
| 41256.5625 | 20.02 |
| 41256.566666666666 | 20 |
| 41256.57083333333 | 19.98 |
| 41256.575 | 20 |
| 41256.57916666667 | 20 |
| 41256.583333333336 | 19.97 |
| 41256.5875 | 20.01 |
| 41256.59166666667 | 20.02 |
| 41256.59583333333 | 20.01 |
| 41256.6 | 19.98 |
| 41256.604166666664 | 19.98 |
| 41256.60833333333 | 19.96 |
| 41256.6125 | 20.02 |
| 41256.61666666667 | 20.01 |
| 41256.620833333334 | 19.97 |
| 41256.625 | 20.01 |
| 41256.629166666666 | 19.98 |
| 41256.63333333333 | 20.02 |
| 41256.6375 | 19.99 |
| 41256.64166666667 | 20.02 |
| 41256.645833333336 | 20 |
| 41256.65 | 20.01 |
| 41256.65416666667 | 19.99 |
| 41256.65833333333 | 20.03 |
| 41256.6625 | 19.97 |
| 41256.666666666664 | 19.99 |
| 41256.67083333333 | 20.01 |
| 41256.675 | 19.99 |
| 41256.67916666667 | 20 |
| 41256.683333333334 | 20.02 |
| 41256.6875 | 19.96 |
| 41256.691666666666 | 20.01 |
| 41256.69583333333 | 19.97 |
| 41256.7 | 19.99 |
| 41256.70416666667 | 19.98 |
| 41256.708333333336 | 19.99 |
| 41256.7125 | 20.01 |
| 41256.71666666667 | 19.97 |
| 41256.72083333333 | 19.96 |
| 41256.725 | 20 |
| 41256.729166666664 | 19.97 |
| 41256.73333333333 | 20.01 |
| 41256.7375 | 20.02 |
| 41256.74166666667 | 19.98 |
| 41256.745833333334 | 20.03 |
| 41256.75 | 19.99 |
| 41256.754166666666 | 19.99 |
| 41256.75833333333 | 19.96 |
| 41256.7625 | 20.01 |
| 41256.76666666667 | 20.05 |
| 41256.770833333336 | 19.95 |
| 41256.775 | 19.98 |
| 41256.77916666667 | 19.97 |
| 41256.78333333333 | 19.99 |
| 41256.7875 | 19.93 |
| 41256.791666666664 | 19.96 |
| 41256.79583333333 | 20 |
| 41256.8 | 20 |
| 41256.80416666667 | 20.03 |
| 41256.808333333334 | 19.97 |
| 41256.8125 | 19.95 |
| 41256.816666666666 | 19.97 |
| 41256.82083333333 | 19.99 |
| 41256.825 | 19.97 |
| 41256.82916666667 | 19.98 |
| 41256.833333333336 | 20.01 |
| 41256.8375 | 19.98 |
| 41256.84166666667 | 20.01 |
| 41256.84583333333 | 20.01 |
| 41256.85 | 19.97 |
| 41256.854166666664 | 19.97 |
| 41256.85833333333 | 20.02 |
| 41256.8625 | 20.01 |
| 41256.86666666667 | 20.02 |
| 41256.870833333334 | 20 |
| 41256.875 | 20.02 |
| 41256.879166666666 | 20.02 |
| 41256.88333333333 | 20 |
| 41256.8875 | 20.02 |
| 41256.89166666667 | 20 |
| 41256.895833333336 | 19.99 |
| 41256.9 | 19.97 |
| 41256.90416666667 | 19.98 |
| 41256.90833333333 | 19.97 |
| 41256.9125 | 19.97 |
| 41256.916666666664 | 19.95 |
| 41256.92083333333 | 19.98 |
| 41256.925 | 19.94 |
| 41256.92916666667 | 20 |
| 41256.933333333334 | 19.99 |
| 41256.9375 | 20 |
| 41256.941666666666 | 19.98 |
| 41256.94583333333 | 19.99 |
| 41256.95 | 19.98 |
| 41256.95416666667 | 19.95 |
| 41256.958333333336 | 20 |
| 41256.9625 | 19.99 |
| 41256.96666666667 | 19.94 |
| 41256.97083333333 | 19.99 |
| 41256.975 | 20.05 |
| 41256.979166666664 | 20 |
| 41256.98333333333 | 20 |
| 41256.9875 | 20 |
| 41256.99166666667 | 19.93 |
| 41256.995833333334 | 19.99 |
| 41257.0 | 19.95 |
| 41257.004166666666 | 19.99 |
| 41257.00833333333 | 19.97 |
| 41257.0125 | 19.94 |
| 41257.01666666667 | 19.98 |
| 41257.020833333336 | 19.98 |
| 41257.025 | 19.96 |
| 41257.02916666667 | 19.96 |
| 41257.03333333333 | 20.01 |
| 41257.0375 | 20 |
| 41257.041666666664 | 20 |
| 41257.04583333333 | 20 |
| 41257.05 | 19.94 |
| 41257.05416666667 | 19.98 |
| 41257.058333333334 | 20.01 |
| 41257.0625 | 19.98 |
| 41257.066666666666 | 19.96 |
| 41257.07083333333 | 19.97 |
| 41257.075 | 20.01 |
| 41257.07916666667 | 19.97 |
| 41257.083333333336 | 19.96 |
| 41257.0875 | 19.95 |
| 41257.09166666667 | 19.96 |
| 41257.09583333333 | 19.96 |
| 41257.1 | 19.95 |
| 41257.104166666664 | 19.98 |
| 41257.10833333333 | 19.96 |
| 41257.1125 | 19.95 |
| 41257.11666666667 | 19.98 |
| 41257.120833333334 | 19.97 |
| 41257.125 | 19.99 |
| 41257.129166666666 | 20.01 |
| 41257.13333333333 | 20.01 |
| 41257.1375 | 19.94 |
| 41257.14166666667 | 19.96 |
| 41257.145833333336 | 19.96 |
| 41257.15 | 19.94 |
| 41257.15416666667 | 20.02 |
| 41257.15833333333 | 19.97 |
| 41257.1625 | 19.98 |
| 41257.166666666664 | 19.96 |
| 41257.17083333333 | 19.96 |
| 41257.175 | 19.98 |
| 41257.17916666667 | 19.96 |
| 41257.183333333334 | 19.98 |
| 41257.1875 | 19.97 |
| 41257.191666666666 | 20 |
| 41257.19583333333 | 19.95 |
| 41257.2 | 19.99 |
| 41257.20416666667 | 19.99 |
| 41257.208333333336 | 19.97 |
| 41257.2125 | 19.94 |
| 41257.21666666667 | 19.95 |
| 41257.22083333333 | 19.99 |
| 41257.225 | 19.94 |
| 41257.229166666664 | 19.98 |
| 41257.23333333333 | 19.99 |
| 41257.2375 | 19.96 |
| 41257.24166666667 | 19.93 |
| 41257.245833333334 | 19.96 |
| 41257.25 | 19.98 |
| 41257.254166666666 | 19.97 |
| 41257.25833333333 | 19.97 |
| 41257.2625 | 19.98 |
| 41257.26666666667 | 19.99 |
| 41257.270833333336 | 19.96 |
| 41257.275 | 19.94 |
| 41257.27916666667 | 19.95 |
| 41257.28333333333 | 20.02 |
| 41257.2875 | 19.94 |
| 41257.291666666664 | 19.95 |
| 41257.29583333333 | 20.04 |
| 41257.3 | 19.97 |
| 41257.30416666667 | 19.96 |
| 41257.308333333334 | 19.96 |
| 41257.3125 | 19.92 |
| 41257.316666666666 | 19.95 |
| 41257.32083333333 | 19.96 |
| 41257.325 | 19.92 |
| 41257.32916666667 | 19.97 |
| 41257.333333333336 | 19.95 |
| 41257.3375 | 19.97 |
| 41257.34166666667 | 19.96 |
| 41257.34583333333 | 20.01 |
| 41257.35 | 19.95 |
| 41257.354166666664 | 19.97 |
| 41257.35833333333 | 19.98 |
| 41257.3625 | 19.98 |
| 41257.36666666667 | 20.01 |
| 41257.370833333334 | 19.96 |
| 41257.375 | 19.97 |
| 41257.379166666666 | 19.97 |
| 41257.38333333333 | 19.98 |
| 41257.3875 | 19.99 |
| 41257.39166666667 | 19.95 |
| 41257.395833333336 | 19.97 |
| 41257.4 | 19.98 |
| 41257.40416666667 | 19.99 |
| 41257.40833333333 | 20 |
| 41257.4125 | 19.94 |
| 41257.416666666664 | 20 |
| 41257.42083333333 | 20.02 |
| 41257.425 | 19.96 |
| 41257.42916666667 | 19.99 |
| 41257.433333333334 | 19.97 |
| 41257.4375 | 19.91 |
| 41257.441666666666 | 19.98 |
| 41257.44583333333 | 19.97 |
| 41257.45 | 20 |
| 41257.45416666667 | 19.96 |
| 41257.458333333336 | 19.97 |
| 41257.4625 | 19.97 |
| 41257.46666666667 | 19.96 |
| 41257.47083333333 | 19.94 |
| 41257.475 | 19.88 |
| 41257.479166666664 | 19.95 |
| 41257.48333333333 | 19.97 |
| 41257.4875 | 19.93 |
| 41257.49166666667 | 19.98 |
| 41257.495833333334 | 19.98 |
| 41257.5 | 19.98 |
| 41257.504166666666 | 19.96 |
| 41257.50833333333 | 19.98 |
| 41257.5125 | 19.96 |
| 41257.51666666667 | 20 |
| 41257.520833333336 | 19.96 |
| 41257.525 | 19.97 |
| 41257.52916666667 | 19.95 |
| 41257.53333333333 | 20 |
| 41257.5375 | 19.96 |
| 41257.541666666664 | 19.99 |
| 41257.54583333333 | 20 |
| 41257.55 | 19.97 |
| 41257.55416666667 | 19.96 |
| 41257.558333333334 | 19.96 |
| 41257.5625 | 19.97 |
| 41257.566666666666 | 20.01 |
| 41257.57083333333 | 20.01 |
| 41257.575 | 19.97 |
| 41257.57916666667 | 19.98 |
| 41257.583333333336 | 20 |
| 41257.5875 | 20.01 |
| 41257.59166666667 | 20.01 |
| 41257.59583333333 | 20 |
| 41257.6 | 19.95 |
| 41257.604166666664 | 19.97 |
| 41257.60833333333 | 20.02 |
| 41257.6125 | 20.07 |
| 41257.61666666667 | 20.01 |
| 41257.620833333334 | 19.98 |
| 41257.625 | 19.98 |
| 41257.629166666666 | 20.04 |
| 41257.63333333333 | 20.04 |
| 41257.6375 | 20.03 |
| 41257.64166666667 | 19.98 |
| 41257.645833333336 | 19.97 |
| 41257.65 | 19.99 |
| 41257.65416666667 | 20.02 |
| 41257.65833333333 | 19.96 |
| 41257.6625 | 19.97 |
| 41257.666666666664 | 19.99 |
| 41257.67083333333 | 19.98 |
| 41257.675 | 19.96 |
| 41257.67916666667 | 20 |
| 41257.683333333334 | 20.01 |
| 41257.6875 | 19.93 |
| 41257.691666666666 | 20.03 |
| 41257.69583333333 | 19.99 |
| 41257.7 | 20.02 |
| 41257.70416666667 | 19.94 |
| 41257.708333333336 | 19.99 |
| 41257.7125 | 19.98 |
| 41257.71666666667 | 19.98 |
| 41257.72083333333 | 20 |
| 41257.725 | 20 |
| 41257.729166666664 | 20 |
| 41257.73333333333 | 20.01 |
| 41257.7375 | 19.99 |
| 41257.74166666667 | 19.98 |
| 41257.745833333334 | 20.01 |
| 41257.75 | 19.98 |
| 41257.754166666666 | 19.97 |
| 41257.75833333333 | 19.98 |
| 41257.7625 | 20 |
| 41257.76666666667 | 19.96 |
| 41257.770833333336 | 19.96 |
| 41257.775 | 20 |
| 41257.77916666667 | 20 |
| 41257.78333333333 | 20.01 |
| 41257.7875 | 20.03 |
| 41257.791666666664 | 20.02 |
| 41257.79583333333 | 19.98 |
| 41257.8 | 20.03 |
| 41257.80416666667 | 20 |
| 41257.808333333334 | 20.02 |
| 41257.8125 | 20 |
| 41257.816666666666 | 20 |
| 41257.82083333333 | 20 |
| 41257.825 | 20.01 |
| 41257.82916666667 | 19.98 |
| 41257.833333333336 | 19.98 |
| 41257.8375 | 20.05 |
| 41257.84166666667 | 19.97 |
| 41257.84583333333 | 19.98 |
| 41257.85 | 19.99 |
| 41257.854166666664 | 19.96 |
| 41257.85833333333 | 19.95 |
| 41257.8625 | 19.98 |
| 41257.86666666667 | 19.99 |
| 41257.870833333334 | 19.99 |
| 41257.875 | 19.98 |
| 41257.879166666666 | 19.95 |
| 41257.88333333333 | 20.02 |
| 41257.8875 | 19.96 |
| 41257.89166666667 | 19.97 |
| 41257.895833333336 | 19.98 |
| 41257.9 | 19.97 |
| 41257.90416666667 | 19.95 |
| 41257.90833333333 | 19.98 |
| 41257.9125 | 19.98 |
| 41257.916666666664 | 19.97 |
| 41257.92083333333 | 19.99 |
| 41257.925 | 19.99 |
| 41257.92916666667 | 19.99 |
| 41257.933333333334 | 19.98 |
| 41257.9375 | 19.98 |
| 41257.941666666666 | 19.99 |
| 41257.94583333333 | 19.97 |
| 41257.95 | 19.97 |
| 41257.95416666667 | 19.97 |
| 41257.958333333336 | 19.96 |
| 41257.9625 | 19.98 |
| 41257.96666666667 | 19.96 |
| 41257.97083333333 | 19.99 |
| 41257.975 | 20 |
| 41257.979166666664 | 19.97 |
| 41257.98333333333 | 19.98 |
| 41257.9875 | 19.98 |
| 41257.99166666667 | 20 |
| 41257.995833333334 | 19.95 |
| 41258.0 | 19.96 |
| 41258.004166666666 | 19.99 |
| 41258.00833333333 | 19.99 |
| 41258.0125 | 19.99 |
| 41258.01666666667 | 19.96 |
| 41258.020833333336 | 19.95 |
| 41258.025 | 19.94 |
| 41258.02916666667 | 19.94 |
| 41258.03333333333 | 19.99 |
| 41258.0375 | 19.97 |
| 41258.041666666664 | 19.99 |
| 41258.04583333333 | 19.97 |
| 41258.05 | 19.97 |
| 41258.05416666667 | 20.01 |
| 41258.058333333334 | 19.96 |
| 41258.0625 | 19.97 |
| 41258.066666666666 | 20 |
| 41258.07083333333 | 19.95 |
| 41258.075 | 20.01 |
| 41258.07916666667 | 19.97 |
| 41258.083333333336 | 19.99 |
| 41258.0875 | 19.98 |
| 41258.09166666667 | 19.98 |
| 41258.09583333333 | 20.01 |
| 41258.1 | 19.96 |
| 41258.104166666664 | 19.98 |
| 41258.10833333333 | 19.97 |
| 41258.1125 | 19.98 |
| 41258.11666666667 | 19.98 |
| 41258.120833333334 | 19.98 |
| 41258.125 | 19.94 |
| 41258.129166666666 | 19.95 |
| 41258.13333333333 | 19.95 |
| 41258.1375 | 20.01 |
| 41258.14166666667 | 19.94 |
| 41258.145833333336 | 19.94 |
| 41258.15 | 19.97 |
| 41258.15416666667 | 19.97 |
| 41258.15833333333 | 19.95 |
| 41258.1625 | 19.93 |
| 41258.166666666664 | 19.94 |
| 41258.17083333333 | 19.96 |
| 41258.175 | 19.94 |
| 41258.183333333334 | 19.96 |
| 41258.1875 | 19.98 |
| 41258.191666666666 | 19.95 |
| 41258.19583333333 | 19.99 |
| 41258.2 | 19.99 |
| 41258.20416666667 | 19.96 |
| 41258.208333333336 | 19.91 |
| 41258.2125 | 19.99 |
| 41258.21666666667 | 19.96 |
| 41258.22083333333 | 19.99 |
| 41258.225 | 19.98 |
| 41258.229166666664 | 20 |
| 41258.23333333333 | 19.94 |
| 41258.2375 | 19.99 |
| 41258.24166666667 | 20 |
| 41258.245833333334 | 20.01 |
| 41258.25 | 19.96 |
| 41258.254166666666 | 19.97 |
| 41258.25833333333 | 19.96 |
| 41258.2625 | 19.99 |
| 41258.26666666667 | 19.97 |
| 41258.270833333336 | 19.99 |
| 41258.275 | 19.94 |
| 41258.27916666667 | 19.97 |
| 41258.28333333333 | 19.95 |
| 41258.2875 | 19.95 |
| 41258.291666666664 | 19.98 |
| 41258.29583333333 | 19.97 |
| 41258.3 | 20.01 |
| 41258.30416666667 | 19.99 |
| 41258.308333333334 | 19.94 |
| 41258.3125 | 19.95 |
| 41258.316666666666 | 19.98 |
| 41258.32083333333 | 19.96 |
| 41258.325 | 19.96 |
| 41258.32916666667 | 19.98 |
| 41258.333333333336 | 19.96 |
| 41258.3375 | 19.97 |
| 41258.34166666667 | 19.99 |
| 41258.34583333333 | 20.02 |
| 41258.35 | 20 |
| 41258.354166666664 | 19.99 |
| 41258.35833333333 | 19.97 |
| 41258.3625 | 19.97 |
| 41258.36666666667 | 19.99 |
| 41258.370833333334 | 20.04 |
| 41258.375 | 20 |
| 41258.379166666666 | 19.98 |
| 41258.38333333333 | 19.97 |
| 41258.3875 | 19.97 |
| 41258.39166666667 | 19.95 |
| 41258.395833333336 | 19.95 |
| 41258.4 | 19.96 |
| 41258.40416666667 | 19.98 |
| 41258.40833333333 | 19.96 |
| 41258.4125 | 19.95 |
| 41258.416666666664 | 20.01 |
| 41258.42083333333 | 19.99 |
| 41258.425 | 19.99 |
| 41258.42916666667 | 19.97 |
| 41258.433333333334 | 19.99 |
| 41258.4375 | 19.97 |
| 41258.441666666666 | 19.98 |
| 41258.44583333333 | 19.98 |
| 41258.45 | 20 |
| 41258.45416666667 | 19.98 |
| 41258.458333333336 | 19.99 |
| 41258.4625 | 19.96 |
| 41258.46666666667 | 19.99 |
| 41258.47083333333 | 19.98 |
| 41258.475 | 20.01 |
| 41258.479166666664 | 19.92 |
| 41258.48333333333 | 19.97 |
| 41258.4875 | 20 |
| 41258.49166666667 | 19.95 |
| 41258.495833333334 | 19.97 |
| 41258.5 | 19.97 |
| 41258.504166666666 | 19.99 |
| 41258.50833333333 | 19.96 |
| 41258.5125 | 19.94 |
| 41258.51666666667 | 19.97 |
| 41258.520833333336 | 20 |
| 41258.525 | 19.97 |
| 41258.52916666667 | 19.94 |
| 41258.53333333333 | 20.01 |
| 41258.5375 | 19.99 |
| 41258.541666666664 | 19.98 |
| 41258.54583333333 | 19.98 |
| 41258.55 | 19.95 |
| 41258.55416666667 | 19.96 |
| 41258.558333333334 | 19.94 |
| 41258.5625 | 19.99 |
| 41258.566666666666 | 19.97 |
| 41258.57083333333 | 19.95 |
| 41258.575 | 19.96 |
| 41258.57916666667 | 19.98 |
| 41258.583333333336 | 20 |
| 41258.5875 | 19.97 |
| 41258.59166666667 | 20.03 |
| 41258.59583333333 | 19.95 |
| 41258.6 | 19.99 |
| 41258.604166666664 | 19.96 |
| 41258.60833333333 | 19.96 |
| 41258.6125 | 19.99 |
| 41258.61666666667 | 19.96 |
| 41258.620833333334 | 19.96 |
| 41258.625 | 20 |
| 41258.629166666666 | 19.97 |
| 41258.63333333333 | 19.98 |
| 41258.6375 | 19.96 |
| 41258.64166666667 | 19.97 |
| 41258.645833333336 | 20 |
| 41258.65 | 19.96 |
| 41258.65416666667 | 19.95 |
| 41258.65833333333 | 19.96 |
| 41258.6625 | 19.96 |
| 41258.666666666664 | 19.99 |
| 41258.67083333333 | 19.97 |
| 41258.675 | 19.98 |
| 41258.67916666667 | 19.95 |
| 41258.683333333334 | 19.98 |
| 41258.6875 | 19.98 |
| 41258.691666666666 | 19.98 |
| 41258.69583333333 | 19.96 |
| 41258.7 | 19.94 |
| 41258.70416666667 | 19.92 |
| 41258.708333333336 | 19.93 |
| 41258.7125 | 19.96 |
| 41258.71666666667 | 19.95 |
| 41258.72083333333 | 20 |
| 41258.725 | 19.94 |
| 41258.729166666664 | 19.99 |
| 41258.73333333333 | 19.97 |
| 41258.7375 | 19.97 |
| 41258.74166666667 | 19.99 |
| 41258.745833333334 | 19.97 |
| 41258.75 | 19.97 |
| 41258.754166666666 | 20 |
| 41258.75833333333 | 19.99 |
| 41258.7625 | 19.96 |
| 41258.76666666667 | 20.01 |
| 41258.770833333336 | 19.98 |
| 41258.775 | 19.98 |
| 41258.77916666667 | 19.99 |
| 41258.78333333333 | 19.94 |
| 41258.7875 | 19.98 |
| 41258.791666666664 | 19.99 |
| 41258.79583333333 | 19.97 |
| 41258.8 | 20 |
| 41258.80416666667 | 20.02 |
| 41258.808333333334 | 19.99 |
| 41258.8125 | 20.03 |
| 41258.816666666666 | 19.95 |
| 41258.82083333333 | 20 |
| 41258.825 | 19.97 |
| 41258.82916666667 | 19.96 |
| 41258.833333333336 | 19.99 |
| 41258.8375 | 19.96 |
| 41258.84166666667 | 19.97 |
| 41258.84583333333 | 19.98 |
| 41258.85 | 20.01 |
| 41258.854166666664 | 19.98 |
| 41258.85833333333 | 19.97 |
| 41258.8625 | 19.96 |
| 41258.86666666667 | 19.97 |
| 41258.870833333334 | 19.96 |
| 41258.875 | 20.01 |
| 41258.879166666666 | 19.97 |
| 41258.88333333333 | 20 |
| 41258.8875 | 19.99 |
| 41258.89166666667 | 20.01 |
| 41258.895833333336 | 20 |
| 41258.9 | 20 |
| 41258.90416666667 | 19.99 |
| 41258.90833333333 | 19.98 |
| 41258.9125 | 20 |
| 41258.916666666664 | 20 |
| 41258.92083333333 | 20 |
| 41258.925 | 19.98 |
| 41258.92916666667 | 19.96 |
| 41258.933333333334 | 19.98 |
| 41258.9375 | 20 |
| 41258.941666666666 | 19.98 |
| 41258.94583333333 | 20.01 |
| 41258.95 | 19.95 |
| 41258.95416666667 | 20 |
| 41258.958333333336 | 19.94 |
| 41258.9625 | 19.99 |
| 41258.96666666667 | 20 |
| 41258.97083333333 | 19.98 |
| 41258.975 | 19.96 |
| 41258.979166666664 | 19.95 |
| 41258.98333333333 | 19.95 |
| 41258.9875 | 19.98 |
| 41258.99166666667 | 20 |
| 41258.995833333334 | 20.01 |
| 41259.0 | 20 |
| 41259.004166666666 | 19.98 |
| 41259.00833333333 | 19.95 |
| 41259.0125 | 19.98 |
| 41259.01666666667 | 19.95 |
| 41259.020833333336 | 19.98 |
| 41259.025 | 20.01 |
| 41259.02916666667 | 19.96 |
| 41259.03333333333 | 19.98 |
| 41259.0375 | 19.97 |
| 41259.041666666664 | 19.98 |
| 41259.04583333333 | 19.94 |
| 41259.05 | 19.97 |
| 41259.05416666667 | 19.95 |
| 41259.058333333334 | 19.97 |
| 41259.0625 | 19.99 |
| 41259.066666666666 | 19.98 |
| 41259.07083333333 | 19.97 |
| 41259.075 | 19.98 |
| 41259.07916666667 | 20.01 |
| 41259.083333333336 | 19.98 |
| 41259.0875 | 20 |
| 41259.09166666667 | 20.01 |
| 41259.09583333333 | 19.98 |
| 41259.1 | 19.99 |
| 41259.104166666664 | 20.01 |
| 41259.10833333333 | 20.01 |
| 41259.1125 | 19.95 |
| 41259.11666666667 | 19.97 |
| 41259.120833333334 | 19.98 |
| 41259.125 | 19.95 |
| 41259.129166666666 | 19.98 |
| 41259.13333333333 | 20 |
| 41259.1375 | 19.98 |
| 41259.14166666667 | 20.01 |
| 41259.145833333336 | 19.98 |
| 41259.15 | 20.01 |
| 41259.15416666667 | 19.99 |
| 41259.15833333333 | 19.95 |
| 41259.1625 | 20.01 |
| 41259.166666666664 | 20 |
| 41259.17083333333 | 20.02 |
| 41259.175 | 19.98 |
| 41259.17916666667 | 20 |
| 41259.183333333334 | 19.98 |
| 41259.1875 | 20.02 |
| 41259.191666666666 | 19.96 |
| 41259.19583333333 | 19.98 |
| 41259.2 | 19.96 |
| 41259.20416666667 | 20 |
| 41259.208333333336 | 19.95 |
| 41259.2125 | 19.98 |
| 41259.21666666667 | 19.95 |
| 41259.22083333333 | 20.01 |
| 41259.225 | 19.98 |
| 41259.229166666664 | 19.96 |
| 41259.23333333333 | 19.99 |
| 41259.2375 | 19.96 |
| 41259.24166666667 | 19.99 |
| 41259.245833333334 | 20 |
| 41259.25 | 20.01 |
| 41259.254166666666 | 20.01 |
| 41259.25833333333 | 19.99 |
| 41259.2625 | 20 |
| 41259.26666666667 | 19.98 |
| 41259.270833333336 | 20 |
| 41259.275 | 19.94 |
| 41259.27916666667 | 19.97 |
| 41259.28333333333 | 20.03 |
| 41259.2875 | 19.97 |
| 41259.291666666664 | 19.98 |
| 41259.29583333333 | 20 |
| 41259.3 | 20 |
| 41259.30416666667 | 19.99 |
| 41259.308333333334 | 20.02 |
| 41259.3125 | 20 |
| 41259.316666666666 | 20.01 |
| 41259.32083333333 | 19.96 |
| 41259.325 | 19.97 |
| 41259.32916666667 | 19.93 |
| 41259.333333333336 | 20.01 |
| 41259.3375 | 19.98 |
| 41259.34166666667 | 19.98 |
| 41259.34583333333 | 20 |
| 41259.35 | 19.99 |
| 41259.354166666664 | 19.95 |
| 41259.35833333333 | 19.97 |
| 41259.3625 | 19.99 |
| 41259.36666666667 | 19.97 |
| 41259.370833333334 | 19.94 |
| 41259.375 | 19.97 |
| 41259.379166666666 | 20 |
| 41259.38333333333 | 19.99 |
| 41259.3875 | 19.94 |
| 41259.39166666667 | 20.01 |
| 41259.395833333336 | 19.99 |
| 41259.4 | 19.96 |
| 41259.40416666667 | 20.03 |
| 41259.40833333333 | 20.02 |
| 41259.4125 | 20 |
| 41259.416666666664 | 20.01 |
| 41259.42083333333 | 19.99 |
| 41259.425 | 19.98 |
| 41259.42916666667 | 20.01 |
| 41259.433333333334 | 20.04 |
| 41259.4375 | 19.94 |
| 41259.441666666666 | 19.99 |
| 41259.44583333333 | 19.94 |
| 41259.45 | 19.95 |
| 41259.45416666667 | 20 |
| 41259.458333333336 | 19.99 |
| 41259.4625 | 19.97 |
| 41259.46666666667 | 19.95 |
| 41259.47083333333 | 19.95 |
| 41259.475 | 19.97 |
| 41259.479166666664 | 19.95 |
| 41259.48333333333 | 19.97 |
| 41259.4875 | 20 |
| 41259.49166666667 | 19.99 |
| 41259.495833333334 | 20 |
| 41259.5 | 19.95 |
| 41259.504166666666 | 19.98 |
| 41259.50833333333 | 19.97 |
| 41259.5125 | 20.02 |
| 41259.51666666667 | 19.99 |
| 41259.520833333336 | 19.97 |
| 41259.525 | 19.97 |
| 41259.52916666667 | 20.04 |
| 41259.53333333333 | 19.97 |
| 41259.5375 | 20 |
| 41259.541666666664 | 19.98 |
| 41259.54583333333 | 19.99 |
| 41259.55 | 20 |
| 41259.55416666667 | 19.98 |
| 41259.558333333334 | 19.96 |
| 41259.5625 | 19.98 |
| 41259.566666666666 | 20 |
| 41259.57083333333 | 19.96 |
| 41259.575 | 20.04 |
| 41259.57916666667 | 20 |
| 41259.583333333336 | 19.98 |
| 41259.5875 | 19.97 |
| 41259.59166666667 | 19.98 |
| 41259.59583333333 | 19.95 |
| 41259.6 | 19.99 |
| 41259.604166666664 | 20 |
| 41259.60833333333 | 20.04 |
| 41259.6125 | 20.03 |
| 41259.61666666667 | 20 |
| 41259.620833333334 | 20 |
| 41259.625 | 20.01 |
| 41259.629166666666 | 19.98 |
| 41259.63333333333 | 20 |
| 41259.6375 | 20.02 |
| 41259.64166666667 | 20.02 |
| 41259.645833333336 | 19.97 |
| 41259.65 | 20 |
| 41259.65416666667 | 19.98 |
| 41259.65833333333 | 19.97 |
| 41259.6625 | 20 |
| 41259.666666666664 | 19.97 |
| 41259.67083333333 | 19.98 |
| 41259.675 | 20 |
| 41259.67916666667 | 19.99 |
| 41259.683333333334 | 19.99 |
| 41259.6875 | 19.99 |
| 41259.691666666666 | 19.97 |
| 41259.69583333333 | 20.02 |
| 41259.7 | 20.02 |
| 41259.70416666667 | 20 |
| 41259.708333333336 | 19.97 |
| 41259.7125 | 20 |
| 41259.71666666667 | 19.99 |
| 41259.72083333333 | 19.97 |
| 41259.725 | 20.02 |
| 41259.729166666664 | 19.98 |
| 41259.73333333333 | 20.01 |
| 41259.7375 | 20 |
| 41259.74166666667 | 20 |
| 41259.745833333334 | 20 |
| 41259.75 | 19.98 |
| 41259.754166666666 | 20.01 |
| 41259.75833333333 | 19.99 |
| 41259.7625 | 19.99 |
| 41259.76666666667 | 20 |
| 41259.770833333336 | 20 |
| 41259.775 | 20.01 |
| 41259.77916666667 | 20.02 |
| 41259.78333333333 | 20.01 |
| 41259.7875 | 19.98 |
| 41259.791666666664 | 20.01 |
| 41259.79583333333 | 20 |
| 41259.8 | 20.04 |
| 41259.80416666667 | 20.02 |
| 41259.808333333334 | 20.02 |
| 41259.8125 | 19.98 |
| 41259.816666666666 | 19.99 |
| 41259.82083333333 | 20 |
| 41259.825 | 19.96 |
| 41259.82916666667 | 20 |
| 41259.833333333336 | 19.98 |
| 41259.8375 | 19.96 |
| 41259.84166666667 | 19.96 |
| 41259.84583333333 | 19.97 |
| 41259.85 | 19.99 |
| 41259.854166666664 | 20.03 |
| 41259.85833333333 | 20.02 |
| 41259.8625 | 20.01 |
| 41259.86666666667 | 19.98 |
| 41259.870833333334 | 19.97 |
| 41259.875 | 19.95 |
| 41259.879166666666 | 19.97 |
| 41259.88333333333 | 19.98 |
| 41259.8875 | 19.97 |
| 41259.89166666667 | 20.01 |
| 41259.895833333336 | 19.97 |
| 41259.9 | 20.01 |
| 41259.90416666667 | 20.01 |
| 41259.90833333333 | 19.99 |
| 41259.9125 | 19.97 |
| 41259.916666666664 | 19.99 |
| 41259.92083333333 | 19.96 |
| 41259.925 | 19.98 |
| 41259.92916666667 | 20.01 |
| 41259.933333333334 | 20 |
| 41259.9375 | 19.99 |
| 41259.941666666666 | 20.01 |
| 41259.94583333333 | 20.01 |
| 41259.95 | 20.01 |
| 41259.95416666667 | 20.02 |
| 41259.958333333336 | 20.01 |
| 41259.9625 | 20.01 |
| 41259.96666666667 | 20.02 |
| 41259.97083333333 | 19.99 |
| 41259.975 | 20.01 |
| 41259.979166666664 | 19.99 |
| 41259.98333333333 | 19.99 |
| 41259.9875 | 19.96 |
| 41259.99166666667 | 20 |
| 41259.995833333334 | 19.99 |
| 41260.0 | 20 |
| 41260.004166666666 | 19.98 |
| 41260.00833333333 | 20.01 |
| 41260.0125 | 19.98 |
| 41260.01666666667 | 19.97 |
| 41260.020833333336 | 19.96 |
| 41260.025 | 19.99 |
| 41260.02916666667 | 20 |
| 41260.03333333333 | 19.99 |
| 41260.0375 | 20 |
| 41260.041666666664 | 19.99 |
| 41260.04583333333 | 20.02 |
| 41260.05 | 20 |
| 41260.05416666667 | 19.98 |
| 41260.058333333334 | 20.01 |
| 41260.0625 | 20 |
| 41260.066666666666 | 20.01 |
| 41260.07083333333 | 19.99 |
| 41260.075 | 20.01 |
| 41260.07916666667 | 19.99 |
| 41260.083333333336 | 20 |
| 41260.0875 | 20 |
| 41260.09166666667 | 20.01 |
| 41260.09583333333 | 20.02 |
| 41260.1 | 20 |
| 41260.104166666664 | 19.98 |
| 41260.10833333333 | 19.98 |
| 41260.1125 | 20.01 |
| 41260.11666666667 | 20 |
| 41260.120833333334 | 19.99 |
| 41260.125 | 19.99 |
| 41260.129166666666 | 20 |
| 41260.13333333333 | 19.97 |
| 41260.1375 | 20.01 |
| 41260.14166666667 | 19.99 |
| 41260.145833333336 | 19.97 |
| 41260.15 | 19.98 |
| 41260.15416666667 | 19.99 |
| 41260.15833333333 | 19.96 |
| 41260.1625 | 19.98 |
| 41260.166666666664 | 19.98 |
| 41260.17083333333 | 19.98 |
| 41260.175 | 20 |
| 41260.17916666667 | 19.98 |
| 41260.183333333334 | 19.98 |
| 41260.1875 | 20.05 |
| 41260.191666666666 | 19.98 |
| 41260.19583333333 | 20.01 |
| 41260.2 | 19.98 |
| 41260.20416666667 | 19.97 |
| 41260.208333333336 | 19.97 |
| 41260.2125 | 20 |
| 41260.21666666667 | 20 |
| 41260.22083333333 | 20.03 |
| 41260.225 | 19.99 |
| 41260.229166666664 | 20.01 |
| 41260.23333333333 | 19.99 |
| 41260.2375 | 20.02 |
| 41260.24166666667 | 20.04 |
| 41260.245833333334 | 19.98 |
| 41260.25 | 19.99 |
| 41260.254166666666 | 20.03 |
| 41260.25833333333 | 20.01 |
| 41260.2625 | 19.99 |
| 41260.26666666667 | 19.99 |
| 41260.270833333336 | 20 |
| 41260.275 | 19.98 |
| 41260.27916666667 | 19.98 |
| 41260.28333333333 | 19.96 |
| 41260.2875 | 19.99 |
| 41260.291666666664 | 20 |
| 41260.29583333333 | 19.96 |
| 41260.3 | 19.99 |
| 41260.30416666667 | 19.98 |
| 41260.308333333334 | 19.99 |
| 41260.3125 | 19.98 |
| 41260.316666666666 | 20.01 |
| 41260.32083333333 | 20.02 |
| 41260.325 | 19.99 |
| 41260.32916666667 | 20.01 |
| 41260.333333333336 | 19.97 |
| 41260.3375 | 20 |
| 41260.34166666667 | 19.99 |
| 41260.34583333333 | 20.03 |
| 41260.35 | 20.04 |
| 41260.354166666664 | 19.98 |
| 41260.35833333333 | 20.03 |
| 41260.3625 | 20.04 |
| 41260.36666666667 | 19.99 |
| 41260.375 | 19.99 |
| 41260.379166666666 | 19.99 |
| 41260.38333333333 | 19.97 |
| 41260.3875 | 19.94 |
| 41260.39166666667 | 19.91 |
| 41260.395833333336 | 19.93 |
| 41260.4 | 19.96 |
| 41260.40416666667 | 19.96 |
| 41260.40833333333 | 19.97 |
| 41260.4125 | 19.98 |
| 41260.416666666664 | 19.99 |
| 41260.42083333333 | 19.89 |
| 41260.425 | 19.86 |
| 41260.42916666667 | 19.96 |
| 41260.433333333334 | 19.95 |
| 41260.4375 | 19.94 |
| 41260.441666666666 | 19.99 |
| 41260.44583333333 | 20.03 |
| 41260.45 | 19.9 |
| 41260.45416666667 | 19.99 |
| 41260.458333333336 | 20.01 |
| 41260.4625 | 20 |
| 41260.46666666667 | 20.04 |
| 41260.47083333333 | 19.98 |
| 41260.475 | 20.02 |
| 41260.479166666664 | 20.03 |
| 41260.48333333333 | 20.04 |
| 41260.4875 | 20 |
| 41260.49166666667 | 20.04 |
| 41260.495833333334 | 20.02 |
| 41260.5 | 20.04 |
| 41260.504166666666 | 20.02 |
| 41260.50833333333 | 20.03 |
| 41260.5125 | 20 |
| 41260.51666666667 | 20.04 |
| 41260.520833333336 | 20 |
| 41260.525 | 20.02 |
| 41260.52916666667 | 20.03 |
| 41260.53333333333 | 20.04 |
| 41260.5375 | 20 |
| 41260.541666666664 | 20.02 |
| 41260.54583333333 | 20.05 |
| 41260.55 | 20.03 |
| 41260.55416666667 | 20.04 |
| 41260.558333333334 | 20 |
| 41260.5625 | 20.03 |
| 41260.566666666666 | 20.03 |
| 41260.57083333333 | 20 |
| 41260.575 | 20.02 |
| 41260.57916666667 | 20.02 |
| 41260.583333333336 | 20.04 |
| 41260.5875 | 19.99 |
| 41260.59166666667 | 20.02 |
| 41260.59583333333 | 20.03 |
| 41260.6 | 20.02 |
| 41260.604166666664 | 20.04 |
| 41260.60833333333 | 20.06 |
| 41260.6125 | 20.04 |
| 41260.61666666667 | 20.01 |
| 41260.620833333334 | 20.04 |
| 41260.625 | 20.05 |
| 41260.629166666666 | 20.02 |
| 41260.63333333333 | 20.02 |
| 41260.6375 | 20.04 |
| 41260.64166666667 | 20.04 |
| 41260.645833333336 | 20 |
| 41260.65 | 20.02 |
| 41260.65416666667 | 20.01 |
| 41260.65833333333 | 20.04 |
| 41260.6625 | 20.05 |
| 41260.666666666664 | 19.99 |
| 41260.67083333333 | 20.02 |
| 41260.675 | 20.02 |
| 41260.67916666667 | 19.99 |
| 41260.683333333334 | 20.01 |
| 41260.6875 | 20.04 |
| 41260.691666666666 | 20.02 |
| 41260.69583333333 | 20.03 |
| 41260.7 | 20 |
| 41260.70416666667 | 20.04 |
| 41260.708333333336 | 20.03 |
| 41260.7125 | 20.04 |
| 41260.71666666667 | 19.99 |
| 41260.72083333333 | 20.02 |
| 41260.725 | 19.99 |
| 41260.729166666664 | 20.03 |
| 41260.73333333333 | 20.03 |
| 41260.7375 | 20 |
| 41260.74166666667 | 20.01 |
| 41260.745833333334 | 20.01 |
| 41260.75 | 20.05 |
| 41260.754166666666 | 20.02 |
| 41260.75833333333 | 20.03 |
| 41260.7625 | 20.01 |
| 41260.76666666667 | 20.02 |
| 41260.770833333336 | 20.01 |
| 41260.775 | 20 |
| 41260.77916666667 | 20.06 |
| 41260.78333333333 | 20.03 |
| 41260.7875 | 19.99 |
| 41260.791666666664 | 20.03 |
| 41260.79583333333 | 20.02 |
| 41260.8 | 20.03 |
| 41260.80416666667 | 20 |
| 41260.808333333334 | 20.03 |
| 41260.8125 | 20 |
| 41260.816666666666 | 19.96 |
| 41260.82083333333 | 19.99 |
| 41260.825 | 20 |
| 41260.82916666667 | 20.01 |
| 41260.833333333336 | 19.99 |
| 41260.8375 | 20.01 |
| 41260.84166666667 | 20 |
| 41260.84583333333 | 20.01 |
| 41260.85 | 19.98 |
| 41260.854166666664 | 20.01 |
| 41260.85833333333 | 19.99 |
| 41260.8625 | 19.98 |
| 41260.86666666667 | 20.01 |
| 41260.870833333334 | 19.98 |
| 41260.875 | 19.98 |
| 41260.879166666666 | 19.98 |
| 41260.88333333333 | 20.02 |
| 41260.8875 | 19.99 |
| 41260.89166666667 | 20.01 |
| 41260.895833333336 | 20.02 |
| 41260.9 | 20.01 |
| 41260.90416666667 | 20.01 |
| 41260.90833333333 | 20.01 |
| 41260.9125 | 20.01 |
| 41260.916666666664 | 20.01 |
| 41260.92083333333 | 19.93 |
| 41260.925 | 19.97 |
| 41260.92916666667 | 20.02 |
| 41260.933333333334 | 19.98 |
| 41260.9375 | 20.01 |
| 41260.941666666666 | 19.96 |
| 41260.94583333333 | 19.98 |
| 41260.95 | 20 |
| 41260.95416666667 | 19.98 |
| 41260.958333333336 | 19.96 |
| 41260.9625 | 19.99 |
| 41260.96666666667 | 19.95 |
| 41260.97083333333 | 19.97 |
| 41260.975 | 19.99 |
| 41260.979166666664 | 20.01 |
| 41260.98333333333 | 20.06 |
| 41260.9875 | 19.96 |
| 41260.99166666667 | 19.97 |
| 41260.995833333334 | 19.97 |
| 41261.0 | 19.96 |
| 41261.004166666666 | 19.98 |
| 41261.00833333333 | 19.99 |
| 41261.0125 | 19.92 |
| 41261.01666666667 | 19.99 |
| 41261.020833333336 | 19.95 |
| 41261.025 | 19.98 |
| 41261.02916666667 | 19.94 |
| 41261.03333333333 | 19.95 |
| 41261.0375 | 20.02 |
| 41261.041666666664 | 20 |
| 41261.04583333333 | 19.97 |
| 41261.05 | 19.99 |
| 41261.05416666667 | 19.96 |
| 41261.058333333334 | 19.97 |
| 41261.0625 | 19.95 |
| 41261.066666666666 | 19.97 |
| 41261.07083333333 | 19.97 |
| 41261.075 | 19.96 |
| 41261.07916666667 | 19.98 |
| 41261.083333333336 | 19.98 |
| 41261.0875 | 19.93 |
| 41261.09166666667 | 19.98 |
| 41261.09583333333 | 19.94 |
| 41261.1 | 19.97 |
| 41261.104166666664 | 19.95 |
| 41261.10833333333 | 20 |
| 41261.1125 | 19.95 |
| 41261.11666666667 | 19.94 |
| 41261.120833333334 | 19.97 |
| 41261.125 | 19.95 |
| 41261.129166666666 | 19.97 |
| 41261.13333333333 | 19.95 |
| 41261.1375 | 19.97 |
| 41261.14166666667 | 19.95 |
| 41261.145833333336 | 19.94 |
| 41261.15 | 19.93 |
| 41261.15416666667 | 19.94 |
| 41261.15833333333 | 19.96 |
| 41261.1625 | 20.01 |
| 41261.166666666664 | 19.97 |
| 41261.17083333333 | 19.93 |
| 41261.175 | 19.96 |
| 41261.17916666667 | 19.98 |
| 41261.183333333334 | 19.99 |
| 41261.1875 | 19.97 |
| 41261.191666666666 | 19.93 |
| 41261.19583333333 | 19.97 |
| 41261.2 | 19.94 |
| 41261.20416666667 | 19.96 |
| 41261.208333333336 | 19.95 |
| 41261.2125 | 19.95 |
| 41261.21666666667 | 19.93 |
| 41261.22083333333 | 19.97 |
| 41261.225 | 19.99 |
| 41261.229166666664 | 19.92 |
| 41261.23333333333 | 19.98 |
| 41261.2375 | 19.93 |
| 41261.24166666667 | 19.94 |
| 41261.245833333334 | 19.93 |
| 41261.25 | 19.96 |
| 41261.254166666666 | 19.94 |
| 41261.25833333333 | 19.93 |
| 41261.2625 | 19.95 |
| 41261.26666666667 | 19.98 |
| 41261.270833333336 | 20 |
| 41261.275 | 20.03 |
| 41261.27916666667 | 19.93 |
| 41261.28333333333 | 19.95 |
| 41261.2875 | 19.95 |
| 41261.291666666664 | 19.98 |
| 41261.29583333333 | 19.93 |
| 41261.3 | 19.96 |
| 41261.30416666667 | 19.94 |
| 41261.308333333334 | 19.96 |
| 41261.3125 | 19.94 |
| 41261.316666666666 | 19.96 |
| 41261.32083333333 | 19.95 |
| 41261.325 | 19.97 |
| 41261.32916666667 | 19.97 |
| 41261.333333333336 | 19.96 |
| 41261.3375 | 19.97 |
| 41261.34166666667 | 19.95 |
| 41261.34583333333 | 19.98 |
| 41261.35 | 19.93 |
| 41261.354166666664 | 19.94 |
| 41261.35833333333 | 19.97 |
| 41261.3625 | 19.96 |
| 41261.36666666667 | 19.97 |
| 41261.370833333334 | 19.98 |
| 41261.375 | 19.99 |
| 41261.379166666666 | 19.95 |
| 41261.38333333333 | 19.98 |
| 41261.3875 | 19.98 |
| 41261.39166666667 | 20.04 |
| 41261.395833333336 | 19.96 |
| 41261.4 | 19.98 |
| 41261.40416666667 | 19.96 |
| 41261.40833333333 | 19.94 |
| 41261.4125 | 19.99 |
| 41261.416666666664 | 20 |
| 41261.42083333333 | 19.99 |
| 41261.425 | 19.98 |
| 41261.42916666667 | 19.97 |
| 41261.433333333334 | 19.94 |
| 41261.4375 | 19.99 |
| 41261.441666666666 | 19.97 |
| 41261.44583333333 | 19.9 |
| 41261.45 | 19.87 |
| 41261.45416666667 | 19.91 |
| 41261.458333333336 | 19.93 |
| 41261.4625 | 19.91 |
| 41261.46666666667 | 19.95 |
| 41261.47083333333 | 20 |
| 41261.475 | 19.97 |
| 41261.479166666664 | 19.95 |
| 41261.48333333333 | 19.96 |
| 41261.4875 | 19.95 |
| 41261.49166666667 | 20.01 |
| 41261.495833333334 | 19.92 |
| 41261.5 | 19.96 |
| 41261.504166666666 | 19.92 |
| 41261.50833333333 | 19.88 |
| 41261.5125 | 19.96 |
| 41261.51666666667 | 20 |
| 41261.520833333336 | 19.93 |
| 41261.525 | 19.94 |
| 41261.52916666667 | 19.98 |
| 41261.53333333333 | 19.88 |
| 41261.5375 | 19.91 |
| 41261.541666666664 | 19.91 |
| 41261.54583333333 | 19.9 |
| 41261.55 | 19.86 |
| 41261.55416666667 | 19.78 |
| 41261.558333333334 | 19.88 |
| 41261.5625 | 19.92 |
| 41261.566666666666 | 19.92 |
| 41261.57083333333 | 19.96 |
| 41261.575 | 19.92 |
| 41261.57916666667 | 19.92 |
| 41261.583333333336 | 19.95 |
| 41261.5875 | 19.94 |
| 41261.59166666667 | 19.95 |
| 41261.59583333333 | 20 |
| 41261.6 | 19.98 |
| 41261.604166666664 | 19.95 |
| 41261.60833333333 | 20.01 |
| 41261.6125 | 19.97 |
| 41261.61666666667 | 19.91 |
| 41261.620833333334 | 19.96 |
| 41261.625 | 19.94 |
| 41261.629166666666 | 19.97 |
| 41261.63333333333 | 19.97 |
| 41261.6375 | 19.98 |
| 41261.64166666667 | 19.97 |
| 41261.645833333336 | 19.98 |
| 41261.65 | 20.03 |
| 41261.65416666667 | 20 |
| 41261.65833333333 | 20 |
| 41261.6625 | 19.99 |
| 41261.666666666664 | 20 |
| 41261.67083333333 | 20.01 |
| 41261.675 | 20.01 |
| 41261.67916666667 | 19.99 |
| 41261.683333333334 | 20 |
| 41261.6875 | 20.01 |
| 41261.691666666666 | 20.01 |
| 41261.69583333333 | 19.99 |
| 41261.7 | 20 |
| 41261.70416666667 | 20 |
| 41261.708333333336 | 20.02 |
| 41261.7125 | 20.05 |
| 41261.71666666667 | 19.99 |
| 41261.72083333333 | 20.02 |
| 41261.725 | 19.99 |
| 41261.729166666664 | 20 |
| 41261.73333333333 | 20.01 |
| 41261.7375 | 20.03 |
| 41261.74166666667 | 19.99 |
| 41261.745833333334 | 20.03 |
| 41261.75 | 20.05 |
| 41261.754166666666 | 20 |
| 41261.75833333333 | 20.03 |
| 41261.7625 | 20.02 |
| 41261.76666666667 | 20.01 |
| 41261.770833333336 | 19.99 |
| 41261.775 | 20.01 |
| 41261.77916666667 | 20.02 |
| 41261.78333333333 | 20.03 |
| 41261.7875 | 20.01 |
| 41261.791666666664 | 20.01 |
| 41261.79583333333 | 20 |
| 41261.8 | 19.99 |
| 41261.80416666667 | 19.99 |
| 41261.808333333334 | 19.97 |
| 41261.8125 | 19.99 |
| 41261.816666666666 | 20.04 |
| 41261.82083333333 | 20.02 |
| 41261.825 | 19.99 |
| 41261.82916666667 | 20.03 |
| 41261.833333333336 | 19.99 |
| 41261.8375 | 20.02 |
| 41261.84166666667 | 19.99 |
| 41261.84583333333 | 20.01 |
| 41261.85 | 20.04 |
| 41261.854166666664 | 20.02 |
| 41261.85833333333 | 20 |
| 41261.8625 | 19.99 |
| 41261.86666666667 | 19.98 |
| 41261.870833333334 | 20.02 |
| 41261.875 | 20.03 |
| 41261.879166666666 | 20.02 |
| 41261.88333333333 | 20.05 |
| 41261.8875 | 20 |
| 41261.89166666667 | 19.99 |
| 41261.895833333336 | 20.04 |
| 41261.9 | 20.02 |
| 41261.90416666667 | 20.02 |
| 41261.90833333333 | 20.01 |
| 41261.9125 | 20.02 |
| 41261.916666666664 | 20.01 |
| 41261.92083333333 | 20.01 |
| 41261.925 | 19.99 |
| 41261.92916666667 | 20.03 |
| 41261.933333333334 | 20.03 |
| 41261.9375 | 19.98 |
| 41261.941666666666 | 20.03 |
| 41261.94583333333 | 20 |
| 41261.95 | 20.01 |
| 41261.95416666667 | 20.02 |
| 41261.958333333336 | 20.03 |
| 41261.9625 | 19.98 |
| 41261.96666666667 | 20.01 |
| 41261.97083333333 | 20 |
| 41261.975 | 19.99 |
| 41261.979166666664 | 20.02 |
| 41261.98333333333 | 19.99 |
| 41261.9875 | 20.01 |
| 41261.99166666667 | 20.03 |
| 41261.995833333334 | 20.05 |
| 41262.0 | 20.01 |
| 41262.004166666666 | 20 |
| 41262.00833333333 | 19.98 |
| 41262.0125 | 20 |
| 41262.01666666667 | 20 |
| 41262.020833333336 | 19.96 |
| 41262.025 | 20 |
| 41262.02916666667 | 19.99 |
| 41262.03333333333 | 20 |
| 41262.0375 | 19.99 |
| 41262.041666666664 | 19.96 |
| 41262.04583333333 | 20.03 |
| 41262.05 | 20.01 |
| 41262.05416666667 | 19.98 |
| 41262.058333333334 | 19.98 |
| 41262.0625 | 19.97 |
| 41262.066666666666 | 19.97 |
| 41262.07083333333 | 20.01 |
| 41262.075 | 19.99 |
| 41262.07916666667 | 20.03 |
| 41262.083333333336 | 19.97 |
| 41262.0875 | 19.96 |
| 41262.09166666667 | 19.98 |
| 41262.09583333333 | 19.96 |
| 41262.1 | 20.01 |
| 41262.104166666664 | 20 |
| 41262.10833333333 | 19.99 |
| 41262.1125 | 19.99 |
| 41262.11666666667 | 20.01 |
| 41262.120833333334 | 20.03 |
| 41262.125 | 20 |
| 41262.129166666666 | 20 |
| 41262.13333333333 | 20 |
| 41262.1375 | 20.01 |
| 41262.14166666667 | 19.99 |
| 41262.145833333336 | 20.04 |
| 41262.15 | 20.03 |
| 41262.15416666667 | 19.98 |
| 41262.15833333333 | 20 |
| 41262.1625 | 20.03 |
| 41262.166666666664 | 20 |
| 41262.17083333333 | 20 |
| 41262.175 | 20.01 |
| 41262.17916666667 | 20 |
| 41262.183333333334 | 19.98 |
| 41262.1875 | 19.99 |
| 41262.191666666666 | 19.99 |
| 41262.19583333333 | 19.99 |
| 41262.2 | 19.99 |
| 41262.20416666667 | 19.97 |
| 41262.208333333336 | 19.97 |
| 41262.2125 | 20 |
| 41262.21666666667 | 19.99 |
| 41262.22083333333 | 19.99 |
| 41262.225 | 19.96 |
| 41262.229166666664 | 19.98 |
| 41262.23333333333 | 19.97 |
| 41262.2375 | 19.97 |
| 41262.24166666667 | 20.02 |
| 41262.245833333334 | 19.98 |
| 41262.25 | 19.98 |
| 41262.254166666666 | 20.01 |
| 41262.25833333333 | 19.99 |
| 41262.2625 | 20 |
| 41262.26666666667 | 20 |
| 41262.270833333336 | 19.99 |
| 41262.275 | 20.01 |
| 41262.27916666667 | 20.01 |
| 41262.28333333333 | 19.98 |
| 41262.2875 | 20.01 |
| 41262.291666666664 | 20 |
| 41262.29583333333 | 20 |
| 41262.3 | 20.01 |
| 41262.30416666667 | 20.01 |
| 41262.308333333334 | 20.04 |
| 41262.3125 | 20.02 |
| 41262.316666666666 | 19.96 |
| 41262.32083333333 | 19.98 |
| 41262.325 | 19.99 |
| 41262.32916666667 | 19.99 |
| 41262.333333333336 | 19.99 |
| 41262.3375 | 19.99 |
| 41262.34166666667 | 19.99 |
| 41262.34583333333 | 20.02 |
| 41262.35 | 20.01 |
| 41262.354166666664 | 20.02 |
| 41262.35833333333 | 20.01 |
| 41262.3625 | 20.06 |
| 41262.36666666667 | 20 |
| 41262.370833333334 | 20.02 |
| 41262.375 | 20.04 |
| 41262.379166666666 | 19.96 |
| 41262.38333333333 | 20 |
| 41262.3875 | 19.99 |
| 41262.390555555554 | 19.98 |
| 41262.39166666667 | 19.96 |
| 41262.395833333336 | 19.98 |
| 41262.4 | 19.96 |
| 41262.40416666667 | 19.94 |
| 41262.40833333333 | 19.98 |
| 41262.4125 | 19.99 |
| 41262.416666666664 | 20 |
| 41262.42083333333 | 19.97 |
| 41262.425 | 19.96 |
| 41262.42916666667 | 19.99 |
| 41262.433333333334 | 19.98 |
| 41262.4375 | 20 |
| 41262.441666666666 | 20 |
| 41262.44583333333 | 20.03 |
| 41262.45 | 20 |
| 41262.45416666667 | 20.02 |
| 41262.458333333336 | 19.99 |
| 41262.4625 | 20.03 |
| 41262.46666666667 | 20.01 |
| 41262.47083333333 | 20.04 |
| 41262.475 | 20 |
| 41262.479166666664 | 20.05 |
| 41262.48333333333 | 20.02 |
| 41262.4875 | 20.02 |
| 41262.49166666667 | 20.05 |
| 41262.495833333334 | 20.03 |
| 41262.5 | 20 |
| 41262.504166666666 | 20.02 |
| 41262.50833333333 | 20.03 |
| 41262.5125 | 20.02 |
| 41262.51666666667 | 20.02 |
| 41262.520833333336 | 20.03 |
| 41262.525 | 20.01 |
| 41262.52916666667 | 20.03 |
| 41262.53333333333 | 19.99 |
| 41262.5375 | 20.01 |
| 41262.541666666664 | 19.99 |
| 41262.54583333333 | 20.01 |
| 41262.55 | 20 |
| 41262.55416666667 | 20.03 |
| 41262.558333333334 | 20 |
| 41262.5625 | 19.99 |
| 41262.566666666666 | 19.97 |
| 41262.57083333333 | 20.01 |
| 41262.575 | 19.98 |
| 41262.57916666667 | 19.98 |
| 41262.583333333336 | 19.99 |
| 41262.5875 | 20.01 |
| 41262.59166666667 | 19.98 |
| 41262.59583333333 | 20.07 |
| 41262.6 | 20.02 |
| 41262.604166666664 | 20.05 |
| 41262.60833333333 | 19.99 |
| 41262.6125 | 20.04 |
| 41262.61666666667 | 20.01 |
| 41262.620833333334 | 20.02 |
| 41262.625 | 20.02 |
| 41262.629166666666 | 20.03 |
| 41262.63333333333 | 19.99 |
| 41262.6375 | 20.04 |
| 41262.64166666667 | 20.02 |
| 41262.645833333336 | 20.04 |
| 41262.65 | 20.05 |
| 41262.65416666667 | 20 |
| 41262.65833333333 | 20.01 |
| 41262.6625 | 20.03 |
| 41262.666666666664 | 20 |
| 41262.67083333333 | 20 |
| 41262.675 | 20.01 |
| 41262.67916666667 | 19.98 |
| 41262.683333333334 | 20.01 |
| 41262.6875 | 20.01 |
| 41262.691666666666 | 19.97 |
| 41262.69583333333 | 20.02 |
| 41262.7 | 20.01 |
| 41262.70416666667 | 20.02 |
| 41262.708333333336 | 20.01 |
| 41262.7125 | 20.03 |
| 41262.71666666667 | 20.02 |
| 41262.72083333333 | 19.99 |
| 41262.725 | 20.01 |
| 41262.729166666664 | 20.05 |
| 41262.73333333333 | 20.05 |
| 41262.7375 | 20.03 |
| 41262.74166666667 | 20.02 |
| 41262.745833333334 | 19.98 |
| 41262.75 | 20 |
| 41262.754166666666 | 20.04 |
| 41262.75833333333 | 20.02 |
| 41262.7625 | 19.99 |
| 41262.76666666667 | 19.98 |
| 41262.770833333336 | 19.99 |
| 41262.775 | 20 |
| 41262.77916666667 | 20 |
| 41262.78333333333 | 20 |
| 41262.7875 | 20 |
| 41262.791666666664 | 20 |
| 41262.79583333333 | 20.02 |
| 41262.8 | 20 |
| 41262.80416666667 | 20 |
| 41262.808333333334 | 19.99 |
| 41262.8125 | 20 |
| 41262.816666666666 | 20.01 |
| 41262.82083333333 | 20 |
| 41262.825 | 20.02 |
| 41262.82916666667 | 20.02 |
| 41262.833333333336 | 20 |
| 41262.8375 | 20.01 |
| 41262.84166666667 | 20 |
| 41262.84583333333 | 20.03 |
| 41262.85 | 20.04 |
| 41262.854166666664 | 19.99 |
| 41262.85833333333 | 20 |
| 41262.8625 | 19.99 |
| 41262.86666666667 | 19.97 |
| 41262.870833333334 | 19.99 |
| 41262.875 | 19.99 |
| 41262.879166666666 | 20 |
| 41262.88333333333 | 20.02 |
| 41262.8875 | 19.98 |
| 41262.89166666667 | 20 |
| 41262.895833333336 | 19.97 |
| 41262.9 | 19.98 |
| 41262.90416666667 | 19.99 |
| 41262.90833333333 | 20.01 |
| 41262.9125 | 20.02 |
| 41262.916666666664 | 20 |
| 41262.92083333333 | 20.01 |
| 41262.925 | 19.99 |
| 41262.92916666667 | 19.99 |
| 41262.933333333334 | 20.01 |
| 41262.9375 | 19.99 |
| 41262.941666666666 | 19.99 |
| 41262.94583333333 | 20 |
| 41262.95 | 19.99 |
| 41262.95416666667 | 19.99 |
| 41262.958333333336 | 19.99 |
| 41262.9625 | 20.02 |
| 41262.96666666667 | 19.99 |
| 41262.97083333333 | 19.99 |
| 41262.975 | 20.02 |
| 41262.979166666664 | 19.98 |
| 41262.98333333333 | 19.96 |
| 41262.9875 | 19.99 |
| 41262.99166666667 | 19.99 |
| 41262.995833333334 | 20 |
| 41263.0 | 19.99 |
| 41263.004166666666 | 20 |
| 41263.00833333333 | 19.99 |
| 41263.0125 | 19.99 |
| 41263.01666666667 | 19.99 |
| 41263.020833333336 | 20 |
| 41263.025 | 20.01 |
| 41263.02916666667 | 19.99 |
| 41263.03333333333 | 20.01 |
| 41263.0375 | 20.01 |
| 41263.041666666664 | 20.02 |
| 41263.04583333333 | 19.99 |
| 41263.05 | 20.01 |
| 41263.05416666667 | 20 |
| 41263.058333333334 | 20.03 |
| 41263.0625 | 20.01 |
| 41263.066666666666 | 20.03 |
| 41263.07083333333 | 20 |
| 41263.075 | 20 |
| 41263.07916666667 | 19.98 |
| 41263.083333333336 | 20.02 |
| 41263.0875 | 19.98 |
| 41263.09166666667 | 19.99 |
| 41263.09583333333 | 19.98 |
| 41263.1 | 19.97 |
| 41263.104166666664 | 20.06 |
| 41263.10833333333 | 20 |
| 41263.1125 | 20.02 |
| 41263.11666666667 | 19.99 |
| 41263.120833333334 | 19.98 |
| 41263.125 | 20.01 |
| 41263.129166666666 | 19.99 |
| 41263.13333333333 | 20 |
| 41263.1375 | 20 |
| 41263.14166666667 | 20.01 |
| 41263.145833333336 | 20.01 |
| 41263.15 | 20.02 |
| 41263.15416666667 | 19.98 |
| 41263.15833333333 | 20.01 |
| 41263.1625 | 20.02 |
| 41263.166666666664 | 20 |
| 41263.17083333333 | 19.98 |
| 41263.175 | 20.01 |
| 41263.17916666667 | 20.01 |
| 41263.183333333334 | 20.02 |
| 41263.1875 | 20.03 |
| 41263.191666666666 | 20 |
| 41263.19583333333 | 20 |
| 41263.2 | 19.99 |
| 41263.20416666667 | 20 |
| 41263.208333333336 | 19.99 |
| 41263.2125 | 19.97 |
| 41263.21666666667 | 19.98 |
| 41263.22083333333 | 19.97 |
| 41263.225 | 20 |
| 41263.229166666664 | 20 |
| 41263.23333333333 | 19.99 |
| 41263.2375 | 19.97 |
| 41263.24166666667 | 19.97 |
| 41263.245833333334 | 19.99 |
| 41263.25 | 20.01 |
| 41263.254166666666 | 19.99 |
| 41263.25833333333 | 19.96 |
| 41263.2625 | 19.96 |
| 41263.26666666667 | 19.97 |
| 41263.270833333336 | 19.97 |
| 41263.275 | 19.95 |
| 41263.27916666667 | 19.98 |
| 41263.28333333333 | 19.98 |
| 41263.2875 | 19.95 |
| 41263.291666666664 | 19.99 |
| 41263.29583333333 | 19.96 |
| 41263.3 | 19.95 |
| 41263.30416666667 | 19.97 |
| 41263.308333333334 | 19.97 |
| 41263.3125 | 19.96 |
| 41263.316666666666 | 19.98 |
| 41263.32083333333 | 20 |
| 41263.325 | 19.96 |
| 41263.32916666667 | 19.98 |
| 41263.333333333336 | 19.97 |
| 41263.3375 | 19.99 |
| 41263.34166666667 | 19.97 |
| 41263.34583333333 | 20 |
| 41263.35 | 20 |
| 41263.354166666664 | 20.01 |
| 41263.35833333333 | 20.02 |
| 41263.3625 | 19.96 |
| 41263.36666666667 | 19.95 |
| 41263.370833333334 | 19.97 |
| 41263.375 | 19.97 |
| 41263.379166666666 | 19.97 |
| 41263.38333333333 | 19.97 |
| 41263.3875 | 19.98 |
| 41263.39166666667 | 19.98 |
| 41263.395833333336 | 19.97 |
| 41263.4 | 19.99 |
| 41263.40416666667 | 19.99 |
| 41263.40833333333 | 19.98 |
| 41263.4125 | 19.98 |
| 41263.416666666664 | 19.98 |
| 41263.42083333333 | 19.98 |
| 41263.425 | 20.03 |
| 41263.42916666667 | 19.99 |
| 41263.433333333334 | 19.99 |
| 41263.4375 | 20.01 |
| 41263.441666666666 | 20.02 |
| 41263.44583333333 | 19.99 |
| 41263.45 | 19.99 |
| 41263.45416666667 | 19.99 |
| 41263.458333333336 | 20.02 |
| 41263.4625 | 20.02 |
| 41263.46666666667 | 19.98 |
| 41263.47083333333 | 20.03 |
| 41263.475 | 20.02 |
| 41263.479166666664 | 19.97 |
| 41263.48333333333 | 19.98 |
| 41263.4875 | 19.97 |
| 41263.49166666667 | 19.99 |
| 41263.495833333334 | 19.97 |
| 41263.5 | 20.02 |
| 41263.504166666666 | 20.03 |
| 41263.50833333333 | 19.96 |
| 41263.5125 | 19.99 |
| 41263.51666666667 | 20 |
| 41263.520833333336 | 20.01 |
| 41263.525 | 19.98 |
| 41263.52916666667 | 19.97 |
| 41263.53333333333 | 19.99 |
| 41263.5375 | 20 |
| 41263.541666666664 | 20.01 |
| 41263.54583333333 | 19.96 |
| 41263.55 | 20.03 |
| 41263.55416666667 | 20 |
| 41263.558333333334 | 19.99 |
| 41263.5625 | 20.03 |
| 41263.566666666666 | 20.04 |
| 41263.57083333333 | 20 |
| 41263.575 | 20 |
| 41263.57916666667 | 20 |
| 41263.583333333336 | 20.02 |
| 41263.5875 | 20.01 |
| 41263.59166666667 | 20.02 |
| 41263.59583333333 | 20.01 |
| 41263.6 | 20.04 |
| 41263.604166666664 | 20.01 |
| 41263.60833333333 | 20.03 |
| 41263.6125 | 20.08 |
| 41263.61666666667 | 20.02 |
| 41263.620833333334 | 20.04 |
| 41263.625 | 20 |
| 41263.629166666666 | 20.07 |
| 41263.63333333333 | 20.06 |
| 41263.6375 | 20.03 |
| 41263.64166666667 | 20.03 |
| 41263.645833333336 | 20.01 |
| 41263.65 | 20.02 |
| 41263.65416666667 | 20.04 |
| 41263.65833333333 | 20 |
| 41263.6625 | 20.01 |
| 41263.666666666664 | 20.02 |
| 41263.67083333333 | 19.99 |
| 41263.675 | 20 |
| 41263.67916666667 | 20.02 |
| 41263.683333333334 | 20 |
| 41263.6875 | 20.04 |
| 41263.691666666666 | 20.01 |
| 41263.69583333333 | 20.01 |
| 41263.7 | 20.02 |
| 41263.70416666667 | 20.04 |
| 41263.708333333336 | 20.04 |
| 41263.7125 | 19.99 |
| 41263.71666666667 | 20.03 |
| 41263.72083333333 | 20.01 |
| 41263.725 | 20.04 |
| 41263.729166666664 | 20 |
| 41263.73333333333 | 20 |
| 41263.7375 | 20.02 |
| 41263.74166666667 | 19.99 |
| 41263.745833333334 | 19.99 |
| 41263.75 | 20.01 |
| 41263.754166666666 | 19.99 |
| 41263.75833333333 | 19.99 |
| 41263.7625 | 20.02 |
| 41263.76666666667 | 20.02 |
| 41263.770833333336 | 20 |
| 41263.775 | 20.02 |
| 41263.77916666667 | 20.01 |
| 41263.78333333333 | 20 |
| 41263.7875 | 20.04 |
| 41263.791666666664 | 19.99 |
| 41263.79583333333 | 20 |
| 41263.8 | 20.01 |
| 41263.80416666667 | 19.99 |
| 41263.808333333334 | 20.02 |
| 41263.8125 | 19.99 |
| 41263.816666666666 | 19.99 |
| 41263.82083333333 | 20 |
| 41263.825 | 19.98 |
| 41263.82916666667 | 19.97 |
| 41263.833333333336 | 19.99 |
| 41263.8375 | 19.96 |
| 41263.84166666667 | 20 |
| 41263.84583333333 | 19.98 |
| 41263.85 | 19.96 |
| 41263.854166666664 | 20.02 |
| 41263.85833333333 | 20 |
| 41263.8625 | 20 |
| 41263.86666666667 | 19.99 |
| 41263.870833333334 | 19.98 |
| 41263.875 | 19.96 |
| 41263.879166666666 | 20 |
| 41263.88333333333 | 20.01 |
| 41263.8875 | 19.97 |
| 41263.89166666667 | 20.01 |
| 41263.895833333336 | 19.96 |
| 41263.9 | 19.96 |
| 41263.90416666667 | 19.98 |
| 41263.90833333333 | 19.98 |
| 41263.9125 | 19.98 |
| 41263.916666666664 | 19.99 |
| 41263.92083333333 | 19.97 |
| 41263.925 | 19.95 |
| 41263.92916666667 | 19.99 |
| 41263.933333333334 | 20 |
| 41263.9375 | 19.96 |
| 41263.941666666666 | 19.96 |
| 41263.94583333333 | 19.98 |
| 41263.95 | 19.98 |
| 41263.95416666667 | 20.02 |
| 41263.958333333336 | 19.95 |
| 41263.9625 | 19.99 |
| 41263.96666666667 | 19.98 |
| 41263.97083333333 | 19.97 |
| 41263.975 | 20.01 |
| 41263.979166666664 | 20.01 |
| 41263.98333333333 | 19.98 |
| 41263.9875 | 20.03 |
| 41263.99166666667 | 19.97 |
| 41263.995833333334 | 19.99 |